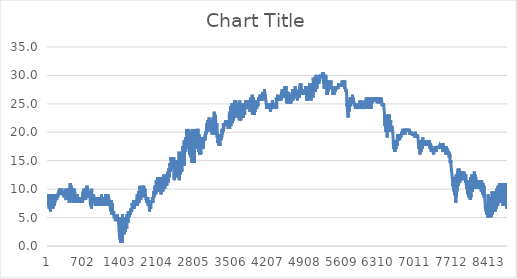
| Category | Series 0 |
|---|---|
| 0 | 9.079 |
| 1 | 9.079 |
| 2 | 8.076 |
| 3 | 7.575 |
| 4 | 7.073 |
| 5 | 7.073 |
| 6 | 7.575 |
| 7 | 8.076 |
| 8 | 8.076 |
| 9 | 8.578 |
| 10 | 8.578 |
| 11 | 9.079 |
| 12 | 8.578 |
| 13 | 8.578 |
| 14 | 8.076 |
| 15 | 7.575 |
| 16 | 8.076 |
| 17 | 8.076 |
| 18 | 7.575 |
| 19 | 7.575 |
| 20 | 7.073 |
| 21 | 6.572 |
| 22 | 7.575 |
| 23 | 8.076 |
| 24 | 8.076 |
| 25 | 8.076 |
| 26 | 8.076 |
| 27 | 8.076 |
| 28 | 7.073 |
| 29 | 7.073 |
| 30 | 7.073 |
| 31 | 6.572 |
| 32 | 7.073 |
| 33 | 7.575 |
| 34 | 7.575 |
| 35 | 8.076 |
| 36 | 8.076 |
| 37 | 8.076 |
| 38 | 8.076 |
| 39 | 7.575 |
| 40 | 7.575 |
| 41 | 7.073 |
| 42 | 7.073 |
| 43 | 7.073 |
| 44 | 6.572 |
| 45 | 6.07 |
| 46 | 6.572 |
| 47 | 7.575 |
| 48 | 8.076 |
| 49 | 8.578 |
| 50 | 8.578 |
| 51 | 8.578 |
| 52 | 8.578 |
| 53 | 8.076 |
| 54 | 7.575 |
| 55 | 7.575 |
| 56 | 7.575 |
| 57 | 8.076 |
| 58 | 8.076 |
| 59 | 9.079 |
| 60 | 9.079 |
| 61 | 9.079 |
| 62 | 9.079 |
| 63 | 8.076 |
| 64 | 8.076 |
| 65 | 8.076 |
| 66 | 7.575 |
| 67 | 7.575 |
| 68 | 7.575 |
| 69 | 6.572 |
| 70 | 6.572 |
| 71 | 7.073 |
| 72 | 8.076 |
| 73 | 8.578 |
| 74 | 8.578 |
| 75 | 8.578 |
| 76 | 8.578 |
| 77 | 8.578 |
| 78 | 8.076 |
| 79 | 7.575 |
| 80 | 7.073 |
| 81 | 7.575 |
| 82 | 7.575 |
| 83 | 7.575 |
| 84 | 8.076 |
| 85 | 8.076 |
| 86 | 8.076 |
| 87 | 7.575 |
| 88 | 7.575 |
| 89 | 7.575 |
| 90 | 7.575 |
| 91 | 7.575 |
| 92 | 7.575 |
| 93 | 6.572 |
| 94 | 6.572 |
| 95 | 7.073 |
| 96 | 8.578 |
| 97 | 9.079 |
| 98 | 9.079 |
| 99 | 9.079 |
| 100 | 9.079 |
| 101 | 9.079 |
| 102 | 8.076 |
| 103 | 7.575 |
| 104 | 7.575 |
| 105 | 7.073 |
| 106 | 7.073 |
| 107 | 7.575 |
| 108 | 7.575 |
| 109 | 8.076 |
| 110 | 8.578 |
| 111 | 8.076 |
| 112 | 8.578 |
| 113 | 8.076 |
| 114 | 7.575 |
| 115 | 7.575 |
| 116 | 7.575 |
| 117 | 7.073 |
| 118 | 7.073 |
| 119 | 7.073 |
| 120 | 8.076 |
| 121 | 8.578 |
| 122 | 9.079 |
| 123 | 9.079 |
| 124 | 9.079 |
| 125 | 9.079 |
| 126 | 8.578 |
| 127 | 8.076 |
| 128 | 7.575 |
| 129 | 7.575 |
| 130 | 7.575 |
| 131 | 7.575 |
| 132 | 8.076 |
| 133 | 8.578 |
| 134 | 9.079 |
| 135 | 9.079 |
| 136 | 8.578 |
| 137 | 8.578 |
| 138 | 8.076 |
| 139 | 8.076 |
| 140 | 8.076 |
| 141 | 8.076 |
| 142 | 8.076 |
| 143 | 8.076 |
| 144 | 8.076 |
| 145 | 8.578 |
| 146 | 9.079 |
| 147 | 9.079 |
| 148 | 9.079 |
| 149 | 9.079 |
| 150 | 8.578 |
| 151 | 8.076 |
| 152 | 8.076 |
| 153 | 8.076 |
| 154 | 8.076 |
| 155 | 8.076 |
| 156 | 8.076 |
| 157 | 8.578 |
| 158 | 8.578 |
| 159 | 8.578 |
| 160 | 8.578 |
| 161 | 8.578 |
| 162 | 8.578 |
| 163 | 8.578 |
| 164 | 8.578 |
| 165 | 8.076 |
| 166 | 8.578 |
| 167 | 8.578 |
| 168 | 8.578 |
| 169 | 8.578 |
| 170 | 8.578 |
| 171 | 8.578 |
| 172 | 8.578 |
| 173 | 9.079 |
| 174 | 9.079 |
| 175 | 8.578 |
| 176 | 8.578 |
| 177 | 8.578 |
| 178 | 8.578 |
| 179 | 8.578 |
| 180 | 9.079 |
| 181 | 9.079 |
| 182 | 8.578 |
| 183 | 9.079 |
| 184 | 9.079 |
| 185 | 8.578 |
| 186 | 9.079 |
| 187 | 9.079 |
| 188 | 9.079 |
| 189 | 9.079 |
| 190 | 9.079 |
| 191 | 9.079 |
| 192 | 9.079 |
| 193 | 9.079 |
| 194 | 9.079 |
| 195 | 9.079 |
| 196 | 9.079 |
| 197 | 9.079 |
| 198 | 9.079 |
| 199 | 9.079 |
| 200 | 9.58 |
| 201 | 9.58 |
| 202 | 9.079 |
| 203 | 9.58 |
| 204 | 9.58 |
| 205 | 9.58 |
| 206 | 9.58 |
| 207 | 9.58 |
| 208 | 9.58 |
| 209 | 9.58 |
| 210 | 9.58 |
| 211 | 9.58 |
| 212 | 9.58 |
| 213 | 9.58 |
| 214 | 9.58 |
| 215 | 9.58 |
| 216 | 9.58 |
| 217 | 9.58 |
| 218 | 9.58 |
| 219 | 9.58 |
| 220 | 9.58 |
| 221 | 9.58 |
| 222 | 10.082 |
| 223 | 9.58 |
| 224 | 9.58 |
| 225 | 9.58 |
| 226 | 9.58 |
| 227 | 9.58 |
| 228 | 9.58 |
| 229 | 9.58 |
| 230 | 9.58 |
| 231 | 9.58 |
| 232 | 9.58 |
| 233 | 9.58 |
| 234 | 9.58 |
| 235 | 9.58 |
| 236 | 9.58 |
| 237 | 9.58 |
| 238 | 9.58 |
| 239 | 9.58 |
| 240 | 9.58 |
| 241 | 9.58 |
| 242 | 9.58 |
| 243 | 9.58 |
| 244 | 9.58 |
| 245 | 9.58 |
| 246 | 9.58 |
| 247 | 10.082 |
| 248 | 9.58 |
| 249 | 9.58 |
| 250 | 9.58 |
| 251 | 9.58 |
| 252 | 9.58 |
| 253 | 9.58 |
| 254 | 9.58 |
| 255 | 10.082 |
| 256 | 9.58 |
| 257 | 9.58 |
| 258 | 9.58 |
| 259 | 9.58 |
| 260 | 9.58 |
| 261 | 9.58 |
| 262 | 9.079 |
| 263 | 9.079 |
| 264 | 9.079 |
| 265 | 9.58 |
| 266 | 9.58 |
| 267 | 9.079 |
| 268 | 9.079 |
| 269 | 9.079 |
| 270 | 9.079 |
| 271 | 9.58 |
| 272 | 9.079 |
| 273 | 9.079 |
| 274 | 9.079 |
| 275 | 9.58 |
| 276 | 9.58 |
| 277 | 9.58 |
| 278 | 9.58 |
| 279 | 9.58 |
| 280 | 9.58 |
| 281 | 9.58 |
| 282 | 9.079 |
| 283 | 9.079 |
| 284 | 9.079 |
| 285 | 9.079 |
| 286 | 9.079 |
| 287 | 9.079 |
| 288 | 9.079 |
| 289 | 9.079 |
| 290 | 9.079 |
| 291 | 9.079 |
| 292 | 9.079 |
| 293 | 9.079 |
| 294 | 9.079 |
| 295 | 9.079 |
| 296 | 9.079 |
| 297 | 9.079 |
| 298 | 9.079 |
| 299 | 9.079 |
| 300 | 9.079 |
| 301 | 9.079 |
| 302 | 9.079 |
| 303 | 9.079 |
| 304 | 9.079 |
| 305 | 9.079 |
| 306 | 9.079 |
| 307 | 9.079 |
| 308 | 9.079 |
| 309 | 8.578 |
| 310 | 9.079 |
| 311 | 8.578 |
| 312 | 8.578 |
| 313 | 8.578 |
| 314 | 8.578 |
| 315 | 8.578 |
| 316 | 8.578 |
| 317 | 8.578 |
| 318 | 8.578 |
| 319 | 8.578 |
| 320 | 9.079 |
| 321 | 9.079 |
| 322 | 9.079 |
| 323 | 9.079 |
| 324 | 9.079 |
| 325 | 10.082 |
| 326 | 9.079 |
| 327 | 9.079 |
| 328 | 9.079 |
| 329 | 9.079 |
| 330 | 9.079 |
| 331 | 8.578 |
| 332 | 8.578 |
| 333 | 9.079 |
| 334 | 9.58 |
| 335 | 9.58 |
| 336 | 9.58 |
| 337 | 9.58 |
| 338 | 9.079 |
| 339 | 8.578 |
| 340 | 8.578 |
| 341 | 8.578 |
| 342 | 8.076 |
| 343 | 8.578 |
| 344 | 9.079 |
| 345 | 9.079 |
| 346 | 9.079 |
| 347 | 9.079 |
| 348 | 9.58 |
| 349 | 9.079 |
| 350 | 8.578 |
| 351 | 8.578 |
| 352 | 8.578 |
| 353 | 8.578 |
| 354 | 8.076 |
| 355 | 8.578 |
| 356 | 8.076 |
| 357 | 9.079 |
| 358 | 9.58 |
| 359 | 9.58 |
| 360 | 9.58 |
| 361 | 9.58 |
| 362 | 10.082 |
| 363 | 9.58 |
| 364 | 9.079 |
| 365 | 8.578 |
| 366 | 8.076 |
| 367 | 8.578 |
| 368 | 9.079 |
| 369 | 9.58 |
| 370 | 10.082 |
| 371 | 10.082 |
| 372 | 10.082 |
| 373 | 10.082 |
| 374 | 9.58 |
| 375 | 9.079 |
| 376 | 8.578 |
| 377 | 8.578 |
| 378 | 8.578 |
| 379 | 8.578 |
| 380 | 8.578 |
| 381 | 8.578 |
| 382 | 9.58 |
| 383 | 10.082 |
| 384 | 9.58 |
| 385 | 10.082 |
| 386 | 10.082 |
| 387 | 9.58 |
| 388 | 9.58 |
| 389 | 9.079 |
| 390 | 9.079 |
| 391 | 8.578 |
| 392 | 9.079 |
| 393 | 9.58 |
| 394 | 10.082 |
| 395 | 10.082 |
| 396 | 10.082 |
| 397 | 10.082 |
| 398 | 9.58 |
| 399 | 9.079 |
| 400 | 8.578 |
| 401 | 8.578 |
| 402 | 8.578 |
| 403 | 8.076 |
| 404 | 8.076 |
| 405 | 7.575 |
| 406 | 8.076 |
| 407 | 8.578 |
| 408 | 8.578 |
| 409 | 9.079 |
| 410 | 9.58 |
| 411 | 9.58 |
| 412 | 8.578 |
| 413 | 8.076 |
| 414 | 7.575 |
| 415 | 7.575 |
| 416 | 8.578 |
| 417 | 9.079 |
| 418 | 10.082 |
| 419 | 10.583 |
| 420 | 10.583 |
| 421 | 10.583 |
| 422 | 11.084 |
| 423 | 10.082 |
| 424 | 9.079 |
| 425 | 8.578 |
| 426 | 8.076 |
| 427 | 8.076 |
| 428 | 8.076 |
| 429 | 8.076 |
| 430 | 8.578 |
| 431 | 9.58 |
| 432 | 10.082 |
| 433 | 10.082 |
| 434 | 10.082 |
| 435 | 10.082 |
| 436 | 9.58 |
| 437 | 10.082 |
| 438 | 9.079 |
| 439 | 8.578 |
| 440 | 8.076 |
| 441 | 8.578 |
| 442 | 9.58 |
| 443 | 10.082 |
| 444 | 10.583 |
| 445 | 10.583 |
| 446 | 10.583 |
| 447 | 10.082 |
| 448 | 9.079 |
| 449 | 9.079 |
| 450 | 8.578 |
| 451 | 8.578 |
| 452 | 8.578 |
| 453 | 8.076 |
| 454 | 8.076 |
| 455 | 9.079 |
| 456 | 10.082 |
| 457 | 9.58 |
| 458 | 10.082 |
| 459 | 10.082 |
| 460 | 10.082 |
| 461 | 9.58 |
| 462 | 9.079 |
| 463 | 8.578 |
| 464 | 8.076 |
| 465 | 8.076 |
| 466 | 9.079 |
| 467 | 9.079 |
| 468 | 9.58 |
| 469 | 10.082 |
| 470 | 9.58 |
| 471 | 9.58 |
| 472 | 9.079 |
| 473 | 8.578 |
| 474 | 8.578 |
| 475 | 8.578 |
| 476 | 8.578 |
| 477 | 8.076 |
| 478 | 7.575 |
| 479 | 8.578 |
| 480 | 9.58 |
| 481 | 9.58 |
| 482 | 9.58 |
| 483 | 10.082 |
| 484 | 10.082 |
| 485 | 10.082 |
| 486 | 10.082 |
| 487 | 9.079 |
| 488 | 8.578 |
| 489 | 8.578 |
| 490 | 9.079 |
| 491 | 9.079 |
| 492 | 10.082 |
| 493 | 9.58 |
| 494 | 10.082 |
| 495 | 9.58 |
| 496 | 9.58 |
| 497 | 9.079 |
| 498 | 8.578 |
| 499 | 8.578 |
| 500 | 8.578 |
| 501 | 8.076 |
| 502 | 7.575 |
| 503 | 7.575 |
| 504 | 8.578 |
| 505 | 9.079 |
| 506 | 9.58 |
| 507 | 9.58 |
| 508 | 9.58 |
| 509 | 9.58 |
| 510 | 9.58 |
| 511 | 9.079 |
| 512 | 8.578 |
| 513 | 8.076 |
| 514 | 8.578 |
| 515 | 8.578 |
| 516 | 9.079 |
| 517 | 9.079 |
| 518 | 9.079 |
| 519 | 9.079 |
| 520 | 8.578 |
| 521 | 8.578 |
| 522 | 8.076 |
| 523 | 8.076 |
| 524 | 8.076 |
| 525 | 8.076 |
| 526 | 8.076 |
| 527 | 8.076 |
| 528 | 8.578 |
| 529 | 8.578 |
| 530 | 9.079 |
| 531 | 9.079 |
| 532 | 9.079 |
| 533 | 9.079 |
| 534 | 8.578 |
| 535 | 8.578 |
| 536 | 8.076 |
| 537 | 8.076 |
| 538 | 8.076 |
| 539 | 8.076 |
| 540 | 8.076 |
| 541 | 9.079 |
| 542 | 8.578 |
| 543 | 8.578 |
| 544 | 8.578 |
| 545 | 8.578 |
| 546 | 8.578 |
| 547 | 8.578 |
| 548 | 8.076 |
| 549 | 8.076 |
| 550 | 8.076 |
| 551 | 7.575 |
| 552 | 8.076 |
| 553 | 8.578 |
| 554 | 8.578 |
| 555 | 8.578 |
| 556 | 9.079 |
| 557 | 8.578 |
| 558 | 8.578 |
| 559 | 8.578 |
| 560 | 8.578 |
| 561 | 8.076 |
| 562 | 8.076 |
| 563 | 8.076 |
| 564 | 8.076 |
| 565 | 8.578 |
| 566 | 8.076 |
| 567 | 8.076 |
| 568 | 8.076 |
| 569 | 8.076 |
| 570 | 8.076 |
| 571 | 7.575 |
| 572 | 7.575 |
| 573 | 7.575 |
| 574 | 7.575 |
| 575 | 7.575 |
| 576 | 8.076 |
| 577 | 8.076 |
| 578 | 8.076 |
| 579 | 8.578 |
| 580 | 8.578 |
| 581 | 8.578 |
| 582 | 8.578 |
| 583 | 8.076 |
| 584 | 8.578 |
| 585 | 8.578 |
| 586 | 8.076 |
| 587 | 7.575 |
| 588 | 7.575 |
| 589 | 7.575 |
| 590 | 8.076 |
| 591 | 7.575 |
| 592 | 7.575 |
| 593 | 7.575 |
| 594 | 7.575 |
| 595 | 7.575 |
| 596 | 7.575 |
| 597 | 7.575 |
| 598 | 7.575 |
| 599 | 7.575 |
| 600 | 7.575 |
| 601 | 7.575 |
| 602 | 7.575 |
| 603 | 8.076 |
| 604 | 8.076 |
| 605 | 8.076 |
| 606 | 8.076 |
| 607 | 8.076 |
| 608 | 8.076 |
| 609 | 8.076 |
| 610 | 8.076 |
| 611 | 7.575 |
| 612 | 7.575 |
| 613 | 7.575 |
| 614 | 8.076 |
| 615 | 8.076 |
| 616 | 7.575 |
| 617 | 7.575 |
| 618 | 7.575 |
| 619 | 7.575 |
| 620 | 8.076 |
| 621 | 8.076 |
| 622 | 8.076 |
| 623 | 8.076 |
| 624 | 7.575 |
| 625 | 7.575 |
| 626 | 7.575 |
| 627 | 7.575 |
| 628 | 7.575 |
| 629 | 7.575 |
| 630 | 8.076 |
| 631 | 8.076 |
| 632 | 8.076 |
| 633 | 8.076 |
| 634 | 8.076 |
| 635 | 8.076 |
| 636 | 8.076 |
| 637 | 7.575 |
| 638 | 8.076 |
| 639 | 8.076 |
| 640 | 8.076 |
| 641 | 7.575 |
| 642 | 7.575 |
| 643 | 7.575 |
| 644 | 8.076 |
| 645 | 8.578 |
| 646 | 8.076 |
| 647 | 8.578 |
| 648 | 8.578 |
| 649 | 8.076 |
| 650 | 8.076 |
| 651 | 8.076 |
| 652 | 8.076 |
| 653 | 7.575 |
| 654 | 8.076 |
| 655 | 8.578 |
| 656 | 9.079 |
| 657 | 8.578 |
| 658 | 8.578 |
| 659 | 9.079 |
| 660 | 8.578 |
| 661 | 8.076 |
| 662 | 8.076 |
| 663 | 8.076 |
| 664 | 8.578 |
| 665 | 8.076 |
| 666 | 8.076 |
| 667 | 8.076 |
| 668 | 8.578 |
| 669 | 9.58 |
| 670 | 9.58 |
| 671 | 9.079 |
| 672 | 9.58 |
| 673 | 9.079 |
| 674 | 9.079 |
| 675 | 8.076 |
| 676 | 8.076 |
| 677 | 8.578 |
| 678 | 8.578 |
| 679 | 8.578 |
| 680 | 9.58 |
| 681 | 10.082 |
| 682 | 9.58 |
| 683 | 9.58 |
| 684 | 9.58 |
| 685 | 9.079 |
| 686 | 8.578 |
| 687 | 8.578 |
| 688 | 8.578 |
| 689 | 8.076 |
| 690 | 8.076 |
| 691 | 8.076 |
| 692 | 9.079 |
| 693 | 9.079 |
| 694 | 9.58 |
| 695 | 9.58 |
| 696 | 9.58 |
| 697 | 9.079 |
| 698 | 9.58 |
| 699 | 9.079 |
| 700 | 8.578 |
| 701 | 8.578 |
| 702 | 8.578 |
| 703 | 8.578 |
| 704 | 9.079 |
| 705 | 10.082 |
| 706 | 10.082 |
| 707 | 10.082 |
| 708 | 10.082 |
| 709 | 9.58 |
| 710 | 9.079 |
| 711 | 8.578 |
| 712 | 8.578 |
| 713 | 8.578 |
| 714 | 8.578 |
| 715 | 8.076 |
| 716 | 8.076 |
| 717 | 9.079 |
| 718 | 9.079 |
| 719 | 10.082 |
| 720 | 10.082 |
| 721 | 10.082 |
| 722 | 10.082 |
| 723 | 9.58 |
| 724 | 9.079 |
| 725 | 8.578 |
| 726 | 8.578 |
| 727 | 9.079 |
| 728 | 9.079 |
| 729 | 9.58 |
| 730 | 10.583 |
| 731 | 10.583 |
| 732 | 10.583 |
| 733 | 10.583 |
| 734 | 10.082 |
| 735 | 9.079 |
| 736 | 9.079 |
| 737 | 8.578 |
| 738 | 8.578 |
| 739 | 8.578 |
| 740 | 8.578 |
| 741 | 8.578 |
| 742 | 9.58 |
| 743 | 10.082 |
| 744 | 10.583 |
| 745 | 10.583 |
| 746 | 10.583 |
| 747 | 10.583 |
| 748 | 10.082 |
| 749 | 9.079 |
| 750 | 9.079 |
| 751 | 9.079 |
| 752 | 9.58 |
| 753 | 9.58 |
| 754 | 10.082 |
| 755 | 10.082 |
| 756 | 10.082 |
| 757 | 10.082 |
| 758 | 10.082 |
| 759 | 9.58 |
| 760 | 9.58 |
| 761 | 9.58 |
| 762 | 9.58 |
| 763 | 9.079 |
| 764 | 9.079 |
| 765 | 9.079 |
| 766 | 9.079 |
| 767 | 9.079 |
| 768 | 9.58 |
| 769 | 9.58 |
| 770 | 9.58 |
| 771 | 9.58 |
| 772 | 9.58 |
| 773 | 9.079 |
| 774 | 9.079 |
| 775 | 9.079 |
| 776 | 9.079 |
| 777 | 9.079 |
| 778 | 9.58 |
| 779 | 9.58 |
| 780 | 9.58 |
| 781 | 9.58 |
| 782 | 9.58 |
| 783 | 9.58 |
| 784 | 9.079 |
| 785 | 9.079 |
| 786 | 9.079 |
| 787 | 9.079 |
| 788 | 8.578 |
| 789 | 8.578 |
| 790 | 8.578 |
| 791 | 9.079 |
| 792 | 9.079 |
| 793 | 9.079 |
| 794 | 9.079 |
| 795 | 8.578 |
| 796 | 8.578 |
| 797 | 8.578 |
| 798 | 8.578 |
| 799 | 8.578 |
| 800 | 8.076 |
| 801 | 8.076 |
| 802 | 8.076 |
| 803 | 7.575 |
| 804 | 7.575 |
| 805 | 7.575 |
| 806 | 7.575 |
| 807 | 7.575 |
| 808 | 7.575 |
| 809 | 7.575 |
| 810 | 7.073 |
| 811 | 7.073 |
| 812 | 7.073 |
| 813 | 7.073 |
| 814 | 7.073 |
| 815 | 7.073 |
| 816 | 8.076 |
| 817 | 8.076 |
| 818 | 8.076 |
| 819 | 8.578 |
| 820 | 8.578 |
| 821 | 7.575 |
| 822 | 7.575 |
| 823 | 7.073 |
| 824 | 7.073 |
| 825 | 6.572 |
| 826 | 7.575 |
| 827 | 9.079 |
| 828 | 9.58 |
| 829 | 10.082 |
| 830 | 9.58 |
| 831 | 9.58 |
| 832 | 9.079 |
| 833 | 8.076 |
| 834 | 7.575 |
| 835 | 7.575 |
| 836 | 7.575 |
| 837 | 7.575 |
| 838 | 7.575 |
| 839 | 7.575 |
| 840 | 7.575 |
| 841 | 9.079 |
| 842 | 9.079 |
| 843 | 9.079 |
| 844 | 9.079 |
| 845 | 9.079 |
| 846 | 8.578 |
| 847 | 8.076 |
| 848 | 8.076 |
| 849 | 8.076 |
| 850 | 7.575 |
| 851 | 7.575 |
| 852 | 8.076 |
| 853 | 8.076 |
| 854 | 8.076 |
| 855 | 8.076 |
| 856 | 8.076 |
| 857 | 8.076 |
| 858 | 8.076 |
| 859 | 8.076 |
| 860 | 7.575 |
| 861 | 7.575 |
| 862 | 7.575 |
| 863 | 7.575 |
| 864 | 8.076 |
| 865 | 8.578 |
| 866 | 9.079 |
| 867 | 9.079 |
| 868 | 9.079 |
| 869 | 8.578 |
| 870 | 8.578 |
| 871 | 8.578 |
| 872 | 8.076 |
| 873 | 8.076 |
| 874 | 7.575 |
| 875 | 7.575 |
| 876 | 8.076 |
| 877 | 8.076 |
| 878 | 8.076 |
| 879 | 8.076 |
| 880 | 8.076 |
| 881 | 8.076 |
| 882 | 8.076 |
| 883 | 7.575 |
| 884 | 7.575 |
| 885 | 7.575 |
| 886 | 7.575 |
| 887 | 7.575 |
| 888 | 7.575 |
| 889 | 7.575 |
| 890 | 8.076 |
| 891 | 8.578 |
| 892 | 8.578 |
| 893 | 7.575 |
| 894 | 7.575 |
| 895 | 7.575 |
| 896 | 7.575 |
| 897 | 7.575 |
| 898 | 7.073 |
| 899 | 7.073 |
| 900 | 7.575 |
| 901 | 7.575 |
| 902 | 7.575 |
| 903 | 7.575 |
| 904 | 7.575 |
| 905 | 7.073 |
| 906 | 7.073 |
| 907 | 7.575 |
| 908 | 7.073 |
| 909 | 7.073 |
| 910 | 7.073 |
| 911 | 7.575 |
| 912 | 8.076 |
| 913 | 8.076 |
| 914 | 8.578 |
| 915 | 8.578 |
| 916 | 8.578 |
| 917 | 8.578 |
| 918 | 8.076 |
| 919 | 8.076 |
| 920 | 8.076 |
| 921 | 7.575 |
| 922 | 7.073 |
| 923 | 7.073 |
| 924 | 7.073 |
| 925 | 7.073 |
| 926 | 7.575 |
| 927 | 7.575 |
| 928 | 7.575 |
| 929 | 7.575 |
| 930 | 7.575 |
| 931 | 8.076 |
| 932 | 8.578 |
| 933 | 8.578 |
| 934 | 8.578 |
| 935 | 8.578 |
| 936 | 8.076 |
| 937 | 8.076 |
| 938 | 8.076 |
| 939 | 7.575 |
| 940 | 7.575 |
| 941 | 8.076 |
| 942 | 8.076 |
| 943 | 8.076 |
| 944 | 8.076 |
| 945 | 8.076 |
| 946 | 7.575 |
| 947 | 7.575 |
| 948 | 7.575 |
| 949 | 7.575 |
| 950 | 8.076 |
| 951 | 7.575 |
| 952 | 7.575 |
| 953 | 7.575 |
| 954 | 8.578 |
| 955 | 8.578 |
| 956 | 8.578 |
| 957 | 8.578 |
| 958 | 8.578 |
| 959 | 8.076 |
| 960 | 8.076 |
| 961 | 8.076 |
| 962 | 7.575 |
| 963 | 7.575 |
| 964 | 7.575 |
| 965 | 7.575 |
| 966 | 7.073 |
| 967 | 7.575 |
| 968 | 7.575 |
| 969 | 7.575 |
| 970 | 7.575 |
| 971 | 7.575 |
| 972 | 7.575 |
| 973 | 7.575 |
| 974 | 8.578 |
| 975 | 8.076 |
| 976 | 8.076 |
| 977 | 8.076 |
| 978 | 7.575 |
| 979 | 7.575 |
| 980 | 7.575 |
| 981 | 7.575 |
| 982 | 7.575 |
| 983 | 7.575 |
| 984 | 7.575 |
| 985 | 7.575 |
| 986 | 7.575 |
| 987 | 7.575 |
| 988 | 7.575 |
| 989 | 7.073 |
| 990 | 7.073 |
| 991 | 7.073 |
| 992 | 7.073 |
| 993 | 7.575 |
| 994 | 7.575 |
| 995 | 7.575 |
| 996 | 7.575 |
| 997 | 7.575 |
| 998 | 7.575 |
| 999 | 8.076 |
| 1000 | 7.575 |
| 1001 | 7.575 |
| 1002 | 7.575 |
| 1003 | 7.575 |
| 1004 | 7.575 |
| 1005 | 8.076 |
| 1006 | 8.578 |
| 1007 | 8.578 |
| 1008 | 8.578 |
| 1009 | 8.578 |
| 1010 | 8.578 |
| 1011 | 8.076 |
| 1012 | 7.575 |
| 1013 | 8.076 |
| 1014 | 8.076 |
| 1015 | 8.578 |
| 1016 | 8.578 |
| 1017 | 9.079 |
| 1018 | 8.578 |
| 1019 | 8.076 |
| 1020 | 8.076 |
| 1021 | 8.076 |
| 1022 | 8.076 |
| 1023 | 7.575 |
| 1024 | 7.575 |
| 1025 | 7.575 |
| 1026 | 7.575 |
| 1027 | 7.073 |
| 1028 | 7.073 |
| 1029 | 7.575 |
| 1030 | 8.076 |
| 1031 | 8.076 |
| 1032 | 7.575 |
| 1033 | 7.575 |
| 1034 | 7.073 |
| 1035 | 7.073 |
| 1036 | 7.073 |
| 1037 | 7.073 |
| 1038 | 7.073 |
| 1039 | 7.073 |
| 1040 | 7.073 |
| 1041 | 7.575 |
| 1042 | 7.575 |
| 1043 | 7.575 |
| 1044 | 7.575 |
| 1045 | 7.575 |
| 1046 | 7.073 |
| 1047 | 7.073 |
| 1048 | 7.073 |
| 1049 | 7.575 |
| 1050 | 7.073 |
| 1051 | 7.073 |
| 1052 | 7.073 |
| 1053 | 8.076 |
| 1054 | 8.076 |
| 1055 | 8.578 |
| 1056 | 8.578 |
| 1057 | 8.076 |
| 1058 | 8.076 |
| 1059 | 7.575 |
| 1060 | 7.073 |
| 1061 | 7.073 |
| 1062 | 7.073 |
| 1063 | 7.073 |
| 1064 | 7.073 |
| 1065 | 7.575 |
| 1066 | 8.076 |
| 1067 | 8.076 |
| 1068 | 8.076 |
| 1069 | 8.578 |
| 1070 | 8.076 |
| 1071 | 7.575 |
| 1072 | 7.575 |
| 1073 | 7.575 |
| 1074 | 7.575 |
| 1075 | 7.575 |
| 1076 | 7.073 |
| 1077 | 7.575 |
| 1078 | 8.076 |
| 1079 | 8.076 |
| 1080 | 8.578 |
| 1081 | 8.076 |
| 1082 | 8.076 |
| 1083 | 7.575 |
| 1084 | 7.575 |
| 1085 | 7.073 |
| 1086 | 7.073 |
| 1087 | 7.073 |
| 1088 | 7.575 |
| 1089 | 7.575 |
| 1090 | 8.076 |
| 1091 | 8.076 |
| 1092 | 8.578 |
| 1093 | 9.079 |
| 1094 | 8.076 |
| 1095 | 7.575 |
| 1096 | 7.575 |
| 1097 | 7.575 |
| 1098 | 7.575 |
| 1099 | 7.575 |
| 1100 | 7.073 |
| 1101 | 7.073 |
| 1102 | 7.575 |
| 1103 | 8.076 |
| 1104 | 8.578 |
| 1105 | 8.578 |
| 1106 | 8.076 |
| 1107 | 8.076 |
| 1108 | 8.076 |
| 1109 | 7.575 |
| 1110 | 7.073 |
| 1111 | 7.073 |
| 1112 | 7.575 |
| 1113 | 7.575 |
| 1114 | 8.076 |
| 1115 | 8.578 |
| 1116 | 8.578 |
| 1117 | 8.578 |
| 1118 | 8.578 |
| 1119 | 8.076 |
| 1120 | 8.076 |
| 1121 | 8.076 |
| 1122 | 8.076 |
| 1123 | 7.575 |
| 1124 | 7.575 |
| 1125 | 7.575 |
| 1126 | 8.076 |
| 1127 | 8.076 |
| 1128 | 8.076 |
| 1129 | 8.578 |
| 1130 | 8.578 |
| 1131 | 8.076 |
| 1132 | 8.076 |
| 1133 | 8.076 |
| 1134 | 7.575 |
| 1135 | 7.575 |
| 1136 | 7.073 |
| 1137 | 7.575 |
| 1138 | 8.076 |
| 1139 | 8.076 |
| 1140 | 9.079 |
| 1141 | 8.578 |
| 1142 | 8.578 |
| 1143 | 8.076 |
| 1144 | 8.076 |
| 1145 | 8.076 |
| 1146 | 8.076 |
| 1147 | 8.076 |
| 1148 | 7.575 |
| 1149 | 7.575 |
| 1150 | 8.076 |
| 1151 | 8.578 |
| 1152 | 8.578 |
| 1153 | 8.578 |
| 1154 | 8.578 |
| 1155 | 8.578 |
| 1156 | 8.578 |
| 1157 | 8.076 |
| 1158 | 8.076 |
| 1159 | 8.076 |
| 1160 | 7.575 |
| 1161 | 7.575 |
| 1162 | 8.076 |
| 1163 | 8.076 |
| 1164 | 8.076 |
| 1165 | 8.076 |
| 1166 | 8.076 |
| 1167 | 8.076 |
| 1168 | 8.076 |
| 1169 | 8.076 |
| 1170 | 7.575 |
| 1171 | 7.575 |
| 1172 | 7.575 |
| 1173 | 7.575 |
| 1174 | 7.073 |
| 1175 | 7.073 |
| 1176 | 8.076 |
| 1177 | 8.076 |
| 1178 | 8.076 |
| 1179 | 7.575 |
| 1180 | 7.073 |
| 1181 | 7.073 |
| 1182 | 7.073 |
| 1183 | 7.073 |
| 1184 | 7.073 |
| 1185 | 7.073 |
| 1186 | 6.572 |
| 1187 | 6.572 |
| 1188 | 6.572 |
| 1189 | 6.572 |
| 1190 | 6.572 |
| 1191 | 6.572 |
| 1192 | 6.572 |
| 1193 | 6.572 |
| 1194 | 6.572 |
| 1195 | 6.572 |
| 1196 | 6.572 |
| 1197 | 6.572 |
| 1198 | 6.07 |
| 1199 | 6.07 |
| 1200 | 7.073 |
| 1201 | 8.076 |
| 1202 | 8.076 |
| 1203 | 7.575 |
| 1204 | 7.073 |
| 1205 | 6.572 |
| 1206 | 6.07 |
| 1207 | 6.07 |
| 1208 | 6.07 |
| 1209 | 6.07 |
| 1210 | 5.569 |
| 1211 | 6.07 |
| 1212 | 6.572 |
| 1213 | 7.575 |
| 1214 | 7.073 |
| 1215 | 6.572 |
| 1216 | 6.572 |
| 1217 | 6.572 |
| 1218 | 6.07 |
| 1219 | 6.07 |
| 1220 | 6.07 |
| 1221 | 6.07 |
| 1222 | 6.07 |
| 1223 | 6.07 |
| 1224 | 6.572 |
| 1225 | 7.575 |
| 1226 | 7.073 |
| 1227 | 6.572 |
| 1228 | 6.572 |
| 1229 | 6.07 |
| 1230 | 6.07 |
| 1231 | 6.07 |
| 1232 | 5.569 |
| 1233 | 5.569 |
| 1234 | 5.569 |
| 1235 | 5.569 |
| 1236 | 5.569 |
| 1237 | 6.07 |
| 1238 | 6.07 |
| 1239 | 6.07 |
| 1240 | 6.07 |
| 1241 | 5.569 |
| 1242 | 5.569 |
| 1243 | 5.569 |
| 1244 | 5.569 |
| 1245 | 5.569 |
| 1246 | 5.569 |
| 1247 | 5.569 |
| 1248 | 6.07 |
| 1249 | 5.569 |
| 1250 | 5.569 |
| 1251 | 5.569 |
| 1252 | 5.569 |
| 1253 | 5.569 |
| 1254 | 5.569 |
| 1255 | 5.067 |
| 1256 | 5.067 |
| 1257 | 5.067 |
| 1258 | 5.067 |
| 1259 | 5.067 |
| 1260 | 5.067 |
| 1261 | 5.067 |
| 1262 | 5.067 |
| 1263 | 5.067 |
| 1264 | 5.067 |
| 1265 | 5.067 |
| 1266 | 5.067 |
| 1267 | 5.067 |
| 1268 | 5.067 |
| 1269 | 5.067 |
| 1270 | 5.067 |
| 1271 | 5.067 |
| 1272 | 5.067 |
| 1273 | 5.067 |
| 1274 | 5.067 |
| 1275 | 5.067 |
| 1276 | 5.067 |
| 1277 | 4.566 |
| 1278 | 4.566 |
| 1279 | 4.566 |
| 1280 | 4.566 |
| 1281 | 4.566 |
| 1282 | 4.566 |
| 1283 | 4.566 |
| 1284 | 4.566 |
| 1285 | 4.566 |
| 1286 | 4.566 |
| 1287 | 4.566 |
| 1288 | 4.566 |
| 1289 | 4.566 |
| 1290 | 4.566 |
| 1291 | 4.566 |
| 1292 | 4.566 |
| 1293 | 4.566 |
| 1294 | 4.566 |
| 1295 | 4.566 |
| 1296 | 4.566 |
| 1297 | 4.566 |
| 1298 | 4.566 |
| 1299 | 4.566 |
| 1300 | 4.566 |
| 1301 | 4.566 |
| 1302 | 4.566 |
| 1303 | 4.566 |
| 1304 | 4.566 |
| 1305 | 4.566 |
| 1306 | 4.566 |
| 1307 | 4.566 |
| 1308 | 5.067 |
| 1309 | 5.067 |
| 1310 | 5.067 |
| 1311 | 5.569 |
| 1312 | 5.569 |
| 1313 | 5.569 |
| 1314 | 5.569 |
| 1315 | 5.569 |
| 1316 | 5.569 |
| 1317 | 5.569 |
| 1318 | 5.569 |
| 1319 | 5.569 |
| 1320 | 5.569 |
| 1321 | 5.569 |
| 1322 | 5.067 |
| 1323 | 5.067 |
| 1324 | 5.067 |
| 1325 | 5.067 |
| 1326 | 5.067 |
| 1327 | 5.067 |
| 1328 | 5.067 |
| 1329 | 5.067 |
| 1330 | 5.067 |
| 1331 | 4.566 |
| 1332 | 4.566 |
| 1333 | 4.566 |
| 1334 | 4.566 |
| 1335 | 4.566 |
| 1336 | 4.566 |
| 1337 | 5.067 |
| 1338 | 4.566 |
| 1339 | 4.064 |
| 1340 | 4.064 |
| 1341 | 4.064 |
| 1342 | 4.064 |
| 1343 | 4.064 |
| 1344 | 4.064 |
| 1345 | 4.064 |
| 1346 | 3.562 |
| 1347 | 3.562 |
| 1348 | 3.06 |
| 1349 | 3.06 |
| 1350 | 3.06 |
| 1351 | 2.558 |
| 1352 | 2.558 |
| 1353 | 2.558 |
| 1354 | 2.558 |
| 1355 | 2.056 |
| 1356 | 2.056 |
| 1357 | 2.056 |
| 1358 | 2.056 |
| 1359 | 2.056 |
| 1360 | 1.555 |
| 1361 | 2.056 |
| 1362 | 1.555 |
| 1363 | 1.555 |
| 1364 | 1.555 |
| 1365 | 2.056 |
| 1366 | 2.056 |
| 1367 | 2.056 |
| 1368 | 1.555 |
| 1369 | 1.555 |
| 1370 | 1.555 |
| 1371 | 1.053 |
| 1372 | 1.053 |
| 1373 | 1.053 |
| 1374 | 1.053 |
| 1375 | 1.555 |
| 1376 | 1.053 |
| 1377 | 1.555 |
| 1378 | 2.558 |
| 1379 | 0.551 |
| 1380 | 1.053 |
| 1381 | 1.053 |
| 1382 | 1.053 |
| 1383 | 0.551 |
| 1384 | 0.551 |
| 1385 | 0.551 |
| 1386 | 1.053 |
| 1387 | 1.053 |
| 1388 | 2.558 |
| 1389 | 4.064 |
| 1390 | 4.566 |
| 1391 | 4.566 |
| 1392 | 4.566 |
| 1393 | 4.064 |
| 1394 | 3.06 |
| 1395 | 2.056 |
| 1396 | 1.555 |
| 1397 | 1.555 |
| 1398 | 1.053 |
| 1399 | 1.053 |
| 1400 | 3.06 |
| 1401 | 4.064 |
| 1402 | 5.067 |
| 1403 | 4.566 |
| 1404 | 3.562 |
| 1405 | 3.562 |
| 1406 | 3.06 |
| 1407 | 2.558 |
| 1408 | 2.056 |
| 1409 | 0.551 |
| 1410 | 2.056 |
| 1411 | 2.056 |
| 1412 | 3.06 |
| 1413 | 4.566 |
| 1414 | 5.569 |
| 1415 | 5.569 |
| 1416 | 4.064 |
| 1417 | 4.566 |
| 1418 | 4.064 |
| 1419 | 3.06 |
| 1420 | 3.06 |
| 1421 | 3.06 |
| 1422 | 2.558 |
| 1423 | 3.06 |
| 1424 | 3.06 |
| 1425 | 4.064 |
| 1426 | 4.566 |
| 1427 | 4.566 |
| 1428 | 4.566 |
| 1429 | 3.562 |
| 1430 | 3.06 |
| 1431 | 3.06 |
| 1432 | 3.06 |
| 1433 | 2.558 |
| 1434 | 2.558 |
| 1435 | 2.056 |
| 1436 | 2.056 |
| 1437 | 2.558 |
| 1438 | 4.064 |
| 1439 | 4.566 |
| 1440 | 4.566 |
| 1441 | 4.566 |
| 1442 | 4.566 |
| 1443 | 3.06 |
| 1444 | 2.558 |
| 1445 | 2.558 |
| 1446 | 2.558 |
| 1447 | 2.056 |
| 1448 | 2.056 |
| 1449 | 3.06 |
| 1450 | 4.064 |
| 1451 | 4.566 |
| 1452 | 4.566 |
| 1453 | 4.566 |
| 1454 | 4.566 |
| 1455 | 4.064 |
| 1456 | 3.06 |
| 1457 | 3.06 |
| 1458 | 3.06 |
| 1459 | 2.558 |
| 1460 | 3.06 |
| 1461 | 3.562 |
| 1462 | 4.566 |
| 1463 | 4.566 |
| 1464 | 5.067 |
| 1465 | 5.067 |
| 1466 | 5.067 |
| 1467 | 4.566 |
| 1468 | 3.562 |
| 1469 | 3.06 |
| 1470 | 3.06 |
| 1471 | 2.558 |
| 1472 | 2.558 |
| 1473 | 3.06 |
| 1474 | 3.562 |
| 1475 | 4.566 |
| 1476 | 5.067 |
| 1477 | 5.067 |
| 1478 | 5.067 |
| 1479 | 4.566 |
| 1480 | 4.064 |
| 1481 | 3.562 |
| 1482 | 3.562 |
| 1483 | 3.562 |
| 1484 | 3.562 |
| 1485 | 3.562 |
| 1486 | 4.064 |
| 1487 | 4.566 |
| 1488 | 5.067 |
| 1489 | 5.067 |
| 1490 | 5.067 |
| 1491 | 5.067 |
| 1492 | 4.064 |
| 1493 | 3.562 |
| 1494 | 3.562 |
| 1495 | 3.562 |
| 1496 | 3.06 |
| 1497 | 3.06 |
| 1498 | 3.06 |
| 1499 | 4.064 |
| 1500 | 5.067 |
| 1501 | 5.569 |
| 1502 | 4.566 |
| 1503 | 4.566 |
| 1504 | 5.067 |
| 1505 | 4.566 |
| 1506 | 4.064 |
| 1507 | 4.064 |
| 1508 | 4.064 |
| 1509 | 4.566 |
| 1510 | 4.566 |
| 1511 | 5.569 |
| 1512 | 5.569 |
| 1513 | 5.569 |
| 1514 | 5.569 |
| 1515 | 5.569 |
| 1516 | 5.067 |
| 1517 | 4.566 |
| 1518 | 4.566 |
| 1519 | 4.566 |
| 1520 | 4.566 |
| 1521 | 4.064 |
| 1522 | 4.064 |
| 1523 | 5.067 |
| 1524 | 5.569 |
| 1525 | 6.07 |
| 1526 | 6.07 |
| 1527 | 6.07 |
| 1528 | 6.07 |
| 1529 | 6.07 |
| 1530 | 5.569 |
| 1531 | 5.067 |
| 1532 | 5.067 |
| 1533 | 5.067 |
| 1534 | 5.067 |
| 1535 | 5.569 |
| 1536 | 5.569 |
| 1537 | 5.569 |
| 1538 | 5.569 |
| 1539 | 5.569 |
| 1540 | 5.569 |
| 1541 | 5.067 |
| 1542 | 5.067 |
| 1543 | 5.067 |
| 1544 | 5.067 |
| 1545 | 5.067 |
| 1546 | 5.067 |
| 1547 | 5.569 |
| 1548 | 5.569 |
| 1549 | 6.07 |
| 1550 | 6.07 |
| 1551 | 6.07 |
| 1552 | 6.07 |
| 1553 | 6.07 |
| 1554 | 5.569 |
| 1555 | 5.569 |
| 1556 | 5.569 |
| 1557 | 5.569 |
| 1558 | 5.569 |
| 1559 | 5.569 |
| 1560 | 6.07 |
| 1561 | 6.07 |
| 1562 | 6.07 |
| 1563 | 6.07 |
| 1564 | 6.07 |
| 1565 | 6.07 |
| 1566 | 5.569 |
| 1567 | 5.569 |
| 1568 | 5.569 |
| 1569 | 5.569 |
| 1570 | 5.569 |
| 1571 | 5.569 |
| 1572 | 6.07 |
| 1573 | 6.07 |
| 1574 | 6.07 |
| 1575 | 6.572 |
| 1576 | 6.572 |
| 1577 | 6.572 |
| 1578 | 6.572 |
| 1579 | 6.572 |
| 1580 | 6.07 |
| 1581 | 6.07 |
| 1582 | 6.572 |
| 1583 | 6.572 |
| 1584 | 6.572 |
| 1585 | 6.572 |
| 1586 | 6.572 |
| 1587 | 6.572 |
| 1588 | 6.572 |
| 1589 | 6.07 |
| 1590 | 6.07 |
| 1591 | 6.07 |
| 1592 | 6.07 |
| 1593 | 6.07 |
| 1594 | 6.07 |
| 1595 | 6.07 |
| 1596 | 6.572 |
| 1597 | 6.572 |
| 1598 | 6.572 |
| 1599 | 7.073 |
| 1600 | 7.575 |
| 1601 | 7.073 |
| 1602 | 7.073 |
| 1603 | 7.575 |
| 1604 | 7.073 |
| 1605 | 7.073 |
| 1606 | 7.073 |
| 1607 | 7.073 |
| 1608 | 7.073 |
| 1609 | 6.572 |
| 1610 | 6.572 |
| 1611 | 6.572 |
| 1612 | 6.572 |
| 1613 | 6.572 |
| 1614 | 6.572 |
| 1615 | 6.572 |
| 1616 | 6.572 |
| 1617 | 6.572 |
| 1618 | 6.572 |
| 1619 | 6.572 |
| 1620 | 7.073 |
| 1621 | 7.575 |
| 1622 | 7.575 |
| 1623 | 7.575 |
| 1624 | 7.575 |
| 1625 | 7.575 |
| 1626 | 8.076 |
| 1627 | 7.575 |
| 1628 | 7.575 |
| 1629 | 7.073 |
| 1630 | 7.073 |
| 1631 | 7.073 |
| 1632 | 7.073 |
| 1633 | 7.073 |
| 1634 | 7.073 |
| 1635 | 7.073 |
| 1636 | 7.073 |
| 1637 | 7.073 |
| 1638 | 6.572 |
| 1639 | 7.073 |
| 1640 | 7.073 |
| 1641 | 7.073 |
| 1642 | 7.073 |
| 1643 | 7.073 |
| 1644 | 7.073 |
| 1645 | 7.575 |
| 1646 | 8.076 |
| 1647 | 8.076 |
| 1648 | 8.076 |
| 1649 | 8.076 |
| 1650 | 8.076 |
| 1651 | 7.575 |
| 1652 | 7.575 |
| 1653 | 7.073 |
| 1654 | 7.073 |
| 1655 | 7.073 |
| 1656 | 7.575 |
| 1657 | 7.073 |
| 1658 | 7.073 |
| 1659 | 7.073 |
| 1660 | 7.575 |
| 1661 | 7.575 |
| 1662 | 7.575 |
| 1663 | 7.575 |
| 1664 | 7.575 |
| 1665 | 7.575 |
| 1666 | 7.575 |
| 1667 | 7.575 |
| 1668 | 7.575 |
| 1669 | 7.575 |
| 1670 | 7.575 |
| 1671 | 7.575 |
| 1672 | 7.575 |
| 1673 | 7.575 |
| 1674 | 7.575 |
| 1675 | 7.575 |
| 1676 | 7.073 |
| 1677 | 7.575 |
| 1678 | 7.575 |
| 1679 | 7.575 |
| 1680 | 7.575 |
| 1681 | 7.575 |
| 1682 | 7.575 |
| 1683 | 7.575 |
| 1684 | 7.575 |
| 1685 | 8.076 |
| 1686 | 8.076 |
| 1687 | 8.076 |
| 1688 | 8.076 |
| 1689 | 8.076 |
| 1690 | 8.076 |
| 1691 | 8.076 |
| 1692 | 8.076 |
| 1693 | 8.076 |
| 1694 | 8.578 |
| 1695 | 9.079 |
| 1696 | 9.079 |
| 1697 | 8.578 |
| 1698 | 8.076 |
| 1699 | 7.073 |
| 1700 | 7.073 |
| 1701 | 7.575 |
| 1702 | 7.073 |
| 1703 | 7.073 |
| 1704 | 7.575 |
| 1705 | 7.575 |
| 1706 | 7.575 |
| 1707 | 8.076 |
| 1708 | 8.076 |
| 1709 | 8.076 |
| 1710 | 8.076 |
| 1711 | 8.578 |
| 1712 | 8.076 |
| 1713 | 8.076 |
| 1714 | 8.076 |
| 1715 | 8.076 |
| 1716 | 8.076 |
| 1717 | 8.578 |
| 1718 | 8.578 |
| 1719 | 9.079 |
| 1720 | 9.58 |
| 1721 | 9.58 |
| 1722 | 9.079 |
| 1723 | 8.578 |
| 1724 | 8.578 |
| 1725 | 8.076 |
| 1726 | 8.076 |
| 1727 | 7.575 |
| 1728 | 7.575 |
| 1729 | 8.076 |
| 1730 | 8.076 |
| 1731 | 8.578 |
| 1732 | 8.578 |
| 1733 | 8.578 |
| 1734 | 8.578 |
| 1735 | 8.578 |
| 1736 | 8.578 |
| 1737 | 8.578 |
| 1738 | 8.076 |
| 1739 | 8.076 |
| 1740 | 8.076 |
| 1741 | 8.578 |
| 1742 | 9.079 |
| 1743 | 9.079 |
| 1744 | 9.58 |
| 1745 | 10.082 |
| 1746 | 10.583 |
| 1747 | 10.082 |
| 1748 | 9.58 |
| 1749 | 9.079 |
| 1750 | 9.58 |
| 1751 | 9.079 |
| 1752 | 8.076 |
| 1753 | 8.076 |
| 1754 | 8.578 |
| 1755 | 9.079 |
| 1756 | 9.58 |
| 1757 | 9.58 |
| 1758 | 9.58 |
| 1759 | 9.58 |
| 1760 | 9.079 |
| 1761 | 8.578 |
| 1762 | 8.076 |
| 1763 | 8.076 |
| 1764 | 8.578 |
| 1765 | 8.578 |
| 1766 | 9.079 |
| 1767 | 9.58 |
| 1768 | 9.58 |
| 1769 | 9.58 |
| 1770 | 9.58 |
| 1771 | 10.082 |
| 1772 | 9.58 |
| 1773 | 9.079 |
| 1774 | 9.079 |
| 1775 | 8.578 |
| 1776 | 8.578 |
| 1777 | 8.578 |
| 1778 | 8.578 |
| 1779 | 9.079 |
| 1780 | 9.079 |
| 1781 | 9.079 |
| 1782 | 9.58 |
| 1783 | 9.58 |
| 1784 | 9.58 |
| 1785 | 9.079 |
| 1786 | 9.079 |
| 1787 | 9.079 |
| 1788 | 9.079 |
| 1789 | 9.58 |
| 1790 | 9.58 |
| 1791 | 10.082 |
| 1792 | 10.082 |
| 1793 | 10.583 |
| 1794 | 10.583 |
| 1795 | 10.583 |
| 1796 | 10.583 |
| 1797 | 10.583 |
| 1798 | 9.58 |
| 1799 | 9.58 |
| 1800 | 9.58 |
| 1801 | 9.079 |
| 1802 | 9.58 |
| 1803 | 9.58 |
| 1804 | 9.58 |
| 1805 | 9.58 |
| 1806 | 10.082 |
| 1807 | 10.082 |
| 1808 | 10.082 |
| 1809 | 9.58 |
| 1810 | 9.079 |
| 1811 | 9.079 |
| 1812 | 9.079 |
| 1813 | 9.58 |
| 1814 | 9.58 |
| 1815 | 9.58 |
| 1816 | 9.58 |
| 1817 | 10.082 |
| 1818 | 10.082 |
| 1819 | 10.583 |
| 1820 | 10.082 |
| 1821 | 10.082 |
| 1822 | 9.079 |
| 1823 | 8.578 |
| 1824 | 9.58 |
| 1825 | 9.079 |
| 1826 | 9.58 |
| 1827 | 9.58 |
| 1828 | 9.58 |
| 1829 | 9.58 |
| 1830 | 9.58 |
| 1831 | 9.58 |
| 1832 | 9.58 |
| 1833 | 9.58 |
| 1834 | 9.58 |
| 1835 | 9.58 |
| 1836 | 9.58 |
| 1837 | 9.58 |
| 1838 | 9.58 |
| 1839 | 9.58 |
| 1840 | 9.58 |
| 1841 | 10.082 |
| 1842 | 10.082 |
| 1843 | 10.082 |
| 1844 | 10.082 |
| 1845 | 10.082 |
| 1846 | 9.58 |
| 1847 | 9.58 |
| 1848 | 9.58 |
| 1849 | 9.58 |
| 1850 | 9.58 |
| 1851 | 9.58 |
| 1852 | 9.58 |
| 1853 | 9.079 |
| 1854 | 9.079 |
| 1855 | 9.079 |
| 1856 | 9.079 |
| 1857 | 8.578 |
| 1858 | 8.578 |
| 1859 | 8.578 |
| 1860 | 8.578 |
| 1861 | 8.578 |
| 1862 | 8.578 |
| 1863 | 8.578 |
| 1864 | 8.578 |
| 1865 | 8.578 |
| 1866 | 8.076 |
| 1867 | 8.076 |
| 1868 | 8.076 |
| 1869 | 8.076 |
| 1870 | 8.076 |
| 1871 | 8.076 |
| 1872 | 8.076 |
| 1873 | 8.076 |
| 1874 | 8.578 |
| 1875 | 7.575 |
| 1876 | 8.076 |
| 1877 | 8.076 |
| 1878 | 7.575 |
| 1879 | 7.575 |
| 1880 | 7.575 |
| 1881 | 7.575 |
| 1882 | 7.575 |
| 1883 | 7.575 |
| 1884 | 8.076 |
| 1885 | 8.578 |
| 1886 | 8.578 |
| 1887 | 8.578 |
| 1888 | 8.578 |
| 1889 | 8.578 |
| 1890 | 8.578 |
| 1891 | 8.076 |
| 1892 | 8.076 |
| 1893 | 8.076 |
| 1894 | 8.076 |
| 1895 | 8.578 |
| 1896 | 8.578 |
| 1897 | 8.076 |
| 1898 | 8.076 |
| 1899 | 8.076 |
| 1900 | 8.076 |
| 1901 | 7.575 |
| 1902 | 7.575 |
| 1903 | 7.575 |
| 1904 | 7.073 |
| 1905 | 7.073 |
| 1906 | 7.073 |
| 1907 | 7.575 |
| 1908 | 7.575 |
| 1909 | 7.575 |
| 1910 | 7.575 |
| 1911 | 8.076 |
| 1912 | 8.076 |
| 1913 | 7.575 |
| 1914 | 7.575 |
| 1915 | 7.575 |
| 1916 | 7.575 |
| 1917 | 7.575 |
| 1918 | 7.575 |
| 1919 | 7.575 |
| 1920 | 7.575 |
| 1921 | 7.575 |
| 1922 | 7.073 |
| 1923 | 7.073 |
| 1924 | 7.073 |
| 1925 | 7.073 |
| 1926 | 7.073 |
| 1927 | 6.572 |
| 1928 | 6.572 |
| 1929 | 6.572 |
| 1930 | 6.07 |
| 1931 | 6.572 |
| 1932 | 6.572 |
| 1933 | 6.572 |
| 1934 | 6.572 |
| 1935 | 7.073 |
| 1936 | 7.073 |
| 1937 | 7.073 |
| 1938 | 7.073 |
| 1939 | 7.073 |
| 1940 | 7.073 |
| 1941 | 7.073 |
| 1942 | 7.073 |
| 1943 | 7.073 |
| 1944 | 7.575 |
| 1945 | 7.575 |
| 1946 | 7.073 |
| 1947 | 7.073 |
| 1948 | 7.073 |
| 1949 | 7.073 |
| 1950 | 7.073 |
| 1951 | 7.073 |
| 1952 | 7.073 |
| 1953 | 7.073 |
| 1954 | 6.572 |
| 1955 | 7.073 |
| 1956 | 7.575 |
| 1957 | 7.575 |
| 1958 | 7.575 |
| 1959 | 7.575 |
| 1960 | 8.076 |
| 1961 | 8.076 |
| 1962 | 8.076 |
| 1963 | 8.076 |
| 1964 | 7.575 |
| 1965 | 8.076 |
| 1966 | 8.076 |
| 1967 | 8.076 |
| 1968 | 8.076 |
| 1969 | 8.076 |
| 1970 | 8.076 |
| 1971 | 8.076 |
| 1972 | 8.076 |
| 1973 | 7.575 |
| 1974 | 7.575 |
| 1975 | 7.575 |
| 1976 | 7.575 |
| 1977 | 7.575 |
| 1978 | 7.575 |
| 1979 | 7.575 |
| 1980 | 8.076 |
| 1981 | 8.076 |
| 1982 | 8.076 |
| 1983 | 8.578 |
| 1984 | 8.578 |
| 1985 | 8.578 |
| 1986 | 8.076 |
| 1987 | 8.076 |
| 1988 | 8.076 |
| 1989 | 8.076 |
| 1990 | 8.076 |
| 1991 | 8.076 |
| 1992 | 8.076 |
| 1993 | 8.076 |
| 1994 | 8.076 |
| 1995 | 8.076 |
| 1996 | 7.575 |
| 1997 | 8.076 |
| 1998 | 8.076 |
| 1999 | 8.076 |
| 2000 | 8.076 |
| 2001 | 8.076 |
| 2002 | 8.076 |
| 2003 | 8.076 |
| 2004 | 8.578 |
| 2005 | 8.578 |
| 2006 | 9.079 |
| 2007 | 9.58 |
| 2008 | 9.079 |
| 2009 | 9.58 |
| 2010 | 9.079 |
| 2011 | 9.079 |
| 2012 | 8.578 |
| 2013 | 8.578 |
| 2014 | 8.578 |
| 2015 | 8.578 |
| 2016 | 8.578 |
| 2017 | 8.578 |
| 2018 | 8.578 |
| 2019 | 8.578 |
| 2020 | 8.578 |
| 2021 | 8.578 |
| 2022 | 8.578 |
| 2023 | 8.578 |
| 2024 | 8.578 |
| 2025 | 8.578 |
| 2026 | 8.578 |
| 2027 | 9.079 |
| 2028 | 9.58 |
| 2029 | 9.58 |
| 2030 | 9.58 |
| 2031 | 10.082 |
| 2032 | 10.583 |
| 2033 | 10.082 |
| 2034 | 9.58 |
| 2035 | 9.58 |
| 2036 | 9.58 |
| 2037 | 9.079 |
| 2038 | 9.079 |
| 2039 | 9.079 |
| 2040 | 9.079 |
| 2041 | 9.079 |
| 2042 | 9.079 |
| 2043 | 9.58 |
| 2044 | 9.58 |
| 2045 | 9.58 |
| 2046 | 9.58 |
| 2047 | 9.58 |
| 2048 | 9.079 |
| 2049 | 9.079 |
| 2050 | 9.079 |
| 2051 | 9.079 |
| 2052 | 9.58 |
| 2053 | 9.58 |
| 2054 | 10.082 |
| 2055 | 10.082 |
| 2056 | 11.585 |
| 2057 | 11.084 |
| 2058 | 10.583 |
| 2059 | 10.583 |
| 2060 | 10.082 |
| 2061 | 9.58 |
| 2062 | 9.58 |
| 2063 | 9.58 |
| 2064 | 9.58 |
| 2065 | 9.58 |
| 2066 | 9.58 |
| 2067 | 9.58 |
| 2068 | 9.58 |
| 2069 | 10.082 |
| 2070 | 9.58 |
| 2071 | 9.58 |
| 2072 | 9.58 |
| 2073 | 9.58 |
| 2074 | 9.58 |
| 2075 | 9.58 |
| 2076 | 10.082 |
| 2077 | 10.583 |
| 2078 | 10.583 |
| 2079 | 11.084 |
| 2080 | 11.585 |
| 2081 | 12.086 |
| 2082 | 11.585 |
| 2083 | 11.585 |
| 2084 | 11.084 |
| 2085 | 10.082 |
| 2086 | 9.58 |
| 2087 | 9.58 |
| 2088 | 9.58 |
| 2089 | 9.58 |
| 2090 | 10.082 |
| 2091 | 10.583 |
| 2092 | 10.583 |
| 2093 | 11.084 |
| 2094 | 10.583 |
| 2095 | 10.583 |
| 2096 | 10.082 |
| 2097 | 10.082 |
| 2098 | 9.58 |
| 2099 | 10.082 |
| 2100 | 10.082 |
| 2101 | 10.583 |
| 2102 | 10.583 |
| 2103 | 11.084 |
| 2104 | 11.084 |
| 2105 | 11.084 |
| 2106 | 11.585 |
| 2107 | 11.585 |
| 2108 | 10.583 |
| 2109 | 10.082 |
| 2110 | 9.58 |
| 2111 | 9.58 |
| 2112 | 9.58 |
| 2113 | 9.58 |
| 2114 | 10.082 |
| 2115 | 10.583 |
| 2116 | 10.583 |
| 2117 | 10.583 |
| 2118 | 10.583 |
| 2119 | 10.583 |
| 2120 | 10.583 |
| 2121 | 10.082 |
| 2122 | 9.58 |
| 2123 | 9.58 |
| 2124 | 10.082 |
| 2125 | 10.583 |
| 2126 | 11.084 |
| 2127 | 11.084 |
| 2128 | 11.585 |
| 2129 | 11.585 |
| 2130 | 12.086 |
| 2131 | 11.585 |
| 2132 | 10.583 |
| 2133 | 10.082 |
| 2134 | 9.58 |
| 2135 | 9.58 |
| 2136 | 9.58 |
| 2137 | 9.58 |
| 2138 | 9.58 |
| 2139 | 10.082 |
| 2140 | 10.082 |
| 2141 | 10.583 |
| 2142 | 10.583 |
| 2143 | 11.084 |
| 2144 | 11.084 |
| 2145 | 10.082 |
| 2146 | 9.58 |
| 2147 | 9.58 |
| 2148 | 9.079 |
| 2149 | 9.58 |
| 2150 | 9.58 |
| 2151 | 10.082 |
| 2152 | 10.583 |
| 2153 | 11.084 |
| 2154 | 11.084 |
| 2155 | 11.084 |
| 2156 | 10.583 |
| 2157 | 9.58 |
| 2158 | 9.58 |
| 2159 | 9.58 |
| 2160 | 9.58 |
| 2161 | 9.58 |
| 2162 | 9.58 |
| 2163 | 10.082 |
| 2164 | 10.082 |
| 2165 | 10.082 |
| 2166 | 10.583 |
| 2167 | 10.583 |
| 2168 | 11.084 |
| 2169 | 11.084 |
| 2170 | 10.583 |
| 2171 | 10.082 |
| 2172 | 10.082 |
| 2173 | 10.082 |
| 2174 | 10.082 |
| 2175 | 10.082 |
| 2176 | 11.084 |
| 2177 | 11.585 |
| 2178 | 12.086 |
| 2179 | 12.086 |
| 2180 | 11.585 |
| 2181 | 11.084 |
| 2182 | 10.082 |
| 2183 | 9.58 |
| 2184 | 9.58 |
| 2185 | 9.58 |
| 2186 | 9.58 |
| 2187 | 10.583 |
| 2188 | 11.084 |
| 2189 | 11.084 |
| 2190 | 11.084 |
| 2191 | 11.084 |
| 2192 | 11.084 |
| 2193 | 11.585 |
| 2194 | 11.084 |
| 2195 | 10.583 |
| 2196 | 10.583 |
| 2197 | 10.583 |
| 2198 | 10.583 |
| 2199 | 11.084 |
| 2200 | 11.585 |
| 2201 | 12.086 |
| 2202 | 12.086 |
| 2203 | 12.086 |
| 2204 | 12.587 |
| 2205 | 12.086 |
| 2206 | 11.585 |
| 2207 | 10.082 |
| 2208 | 10.082 |
| 2209 | 10.082 |
| 2210 | 10.082 |
| 2211 | 10.082 |
| 2212 | 11.084 |
| 2213 | 11.585 |
| 2214 | 11.585 |
| 2215 | 11.585 |
| 2216 | 12.086 |
| 2217 | 12.086 |
| 2218 | 11.585 |
| 2219 | 10.583 |
| 2220 | 10.082 |
| 2221 | 10.082 |
| 2222 | 10.583 |
| 2223 | 10.583 |
| 2224 | 11.084 |
| 2225 | 11.585 |
| 2226 | 12.086 |
| 2227 | 12.086 |
| 2228 | 12.086 |
| 2229 | 12.086 |
| 2230 | 11.585 |
| 2231 | 10.583 |
| 2232 | 10.583 |
| 2233 | 10.583 |
| 2234 | 10.583 |
| 2235 | 10.583 |
| 2236 | 11.084 |
| 2237 | 11.585 |
| 2238 | 11.585 |
| 2239 | 11.585 |
| 2240 | 11.585 |
| 2241 | 12.086 |
| 2242 | 12.086 |
| 2243 | 12.086 |
| 2244 | 11.585 |
| 2245 | 11.585 |
| 2246 | 11.585 |
| 2247 | 11.585 |
| 2248 | 12.086 |
| 2249 | 12.086 |
| 2250 | 12.086 |
| 2251 | 12.086 |
| 2252 | 12.086 |
| 2253 | 12.086 |
| 2254 | 12.587 |
| 2255 | 11.585 |
| 2256 | 10.583 |
| 2257 | 10.583 |
| 2258 | 10.583 |
| 2259 | 11.084 |
| 2260 | 11.084 |
| 2261 | 11.585 |
| 2262 | 11.585 |
| 2263 | 12.086 |
| 2264 | 12.086 |
| 2265 | 12.086 |
| 2266 | 12.587 |
| 2267 | 12.587 |
| 2268 | 12.086 |
| 2269 | 12.587 |
| 2270 | 12.086 |
| 2271 | 12.086 |
| 2272 | 12.086 |
| 2273 | 12.086 |
| 2274 | 12.086 |
| 2275 | 12.587 |
| 2276 | 13.088 |
| 2277 | 13.088 |
| 2278 | 13.088 |
| 2279 | 12.587 |
| 2280 | 11.585 |
| 2281 | 11.585 |
| 2282 | 11.084 |
| 2283 | 11.084 |
| 2284 | 11.585 |
| 2285 | 12.086 |
| 2286 | 12.086 |
| 2287 | 12.587 |
| 2288 | 12.587 |
| 2289 | 12.587 |
| 2290 | 13.088 |
| 2291 | 13.088 |
| 2292 | 13.589 |
| 2293 | 13.589 |
| 2294 | 13.088 |
| 2295 | 13.088 |
| 2296 | 13.589 |
| 2297 | 13.589 |
| 2298 | 13.088 |
| 2299 | 13.088 |
| 2300 | 13.088 |
| 2301 | 13.088 |
| 2302 | 13.088 |
| 2303 | 13.088 |
| 2304 | 12.587 |
| 2305 | 12.587 |
| 2306 | 12.587 |
| 2307 | 12.086 |
| 2308 | 12.086 |
| 2309 | 12.587 |
| 2310 | 12.587 |
| 2311 | 12.587 |
| 2312 | 13.088 |
| 2313 | 13.088 |
| 2314 | 14.09 |
| 2315 | 14.09 |
| 2316 | 14.09 |
| 2317 | 14.09 |
| 2318 | 14.591 |
| 2319 | 14.09 |
| 2320 | 14.09 |
| 2321 | 14.09 |
| 2322 | 14.09 |
| 2323 | 14.591 |
| 2324 | 14.09 |
| 2325 | 14.09 |
| 2326 | 13.088 |
| 2327 | 13.589 |
| 2328 | 13.088 |
| 2329 | 13.088 |
| 2330 | 13.088 |
| 2331 | 13.088 |
| 2332 | 13.088 |
| 2333 | 13.088 |
| 2334 | 13.088 |
| 2335 | 13.088 |
| 2336 | 13.589 |
| 2337 | 13.589 |
| 2338 | 14.09 |
| 2339 | 14.591 |
| 2340 | 15.593 |
| 2341 | 15.092 |
| 2342 | 15.593 |
| 2343 | 15.092 |
| 2344 | 15.593 |
| 2345 | 15.092 |
| 2346 | 15.593 |
| 2347 | 14.591 |
| 2348 | 14.09 |
| 2349 | 13.589 |
| 2350 | 14.09 |
| 2351 | 14.09 |
| 2352 | 14.09 |
| 2353 | 13.589 |
| 2354 | 13.589 |
| 2355 | 14.09 |
| 2356 | 14.09 |
| 2357 | 14.09 |
| 2358 | 14.09 |
| 2359 | 14.09 |
| 2360 | 13.589 |
| 2361 | 13.589 |
| 2362 | 13.589 |
| 2363 | 14.09 |
| 2364 | 15.092 |
| 2365 | 14.591 |
| 2366 | 14.591 |
| 2367 | 14.591 |
| 2368 | 14.591 |
| 2369 | 14.591 |
| 2370 | 14.591 |
| 2371 | 14.591 |
| 2372 | 14.09 |
| 2373 | 14.09 |
| 2374 | 14.09 |
| 2375 | 14.09 |
| 2376 | 14.09 |
| 2377 | 14.09 |
| 2378 | 14.09 |
| 2379 | 14.09 |
| 2380 | 14.09 |
| 2381 | 14.09 |
| 2382 | 14.09 |
| 2383 | 14.09 |
| 2384 | 14.09 |
| 2385 | 14.09 |
| 2386 | 14.09 |
| 2387 | 14.09 |
| 2388 | 14.591 |
| 2389 | 14.591 |
| 2390 | 15.593 |
| 2391 | 15.593 |
| 2392 | 15.092 |
| 2393 | 14.591 |
| 2394 | 14.09 |
| 2395 | 12.587 |
| 2396 | 12.587 |
| 2397 | 12.587 |
| 2398 | 12.587 |
| 2399 | 11.585 |
| 2400 | 12.587 |
| 2401 | 13.088 |
| 2402 | 13.088 |
| 2403 | 13.589 |
| 2404 | 13.589 |
| 2405 | 14.09 |
| 2406 | 14.09 |
| 2407 | 14.09 |
| 2408 | 13.589 |
| 2409 | 13.088 |
| 2410 | 13.088 |
| 2411 | 13.088 |
| 2412 | 13.589 |
| 2413 | 14.09 |
| 2414 | 14.09 |
| 2415 | 14.591 |
| 2416 | 15.092 |
| 2417 | 15.092 |
| 2418 | 14.09 |
| 2419 | 13.088 |
| 2420 | 12.086 |
| 2421 | 12.086 |
| 2422 | 12.587 |
| 2423 | 13.088 |
| 2424 | 13.088 |
| 2425 | 13.088 |
| 2426 | 13.589 |
| 2427 | 14.09 |
| 2428 | 14.09 |
| 2429 | 14.09 |
| 2430 | 14.09 |
| 2431 | 14.09 |
| 2432 | 13.589 |
| 2433 | 13.589 |
| 2434 | 13.589 |
| 2435 | 13.589 |
| 2436 | 13.589 |
| 2437 | 13.589 |
| 2438 | 14.09 |
| 2439 | 14.09 |
| 2440 | 14.591 |
| 2441 | 14.591 |
| 2442 | 14.591 |
| 2443 | 14.09 |
| 2444 | 13.589 |
| 2445 | 13.088 |
| 2446 | 13.088 |
| 2447 | 12.587 |
| 2448 | 12.587 |
| 2449 | 12.587 |
| 2450 | 13.589 |
| 2451 | 13.589 |
| 2452 | 13.589 |
| 2453 | 14.09 |
| 2454 | 14.09 |
| 2455 | 13.589 |
| 2456 | 13.088 |
| 2457 | 12.587 |
| 2458 | 12.086 |
| 2459 | 12.587 |
| 2460 | 12.587 |
| 2461 | 13.088 |
| 2462 | 14.09 |
| 2463 | 14.591 |
| 2464 | 14.591 |
| 2465 | 15.092 |
| 2466 | 15.092 |
| 2467 | 15.092 |
| 2468 | 14.09 |
| 2469 | 13.088 |
| 2470 | 12.587 |
| 2471 | 12.587 |
| 2472 | 12.587 |
| 2473 | 12.587 |
| 2474 | 13.088 |
| 2475 | 14.09 |
| 2476 | 14.09 |
| 2477 | 14.09 |
| 2478 | 14.09 |
| 2479 | 14.09 |
| 2480 | 13.589 |
| 2481 | 13.088 |
| 2482 | 12.086 |
| 2483 | 13.088 |
| 2484 | 13.589 |
| 2485 | 14.09 |
| 2486 | 14.591 |
| 2487 | 14.591 |
| 2488 | 15.593 |
| 2489 | 16.093 |
| 2490 | 16.594 |
| 2491 | 16.093 |
| 2492 | 14.591 |
| 2493 | 13.589 |
| 2494 | 11.585 |
| 2495 | 12.086 |
| 2496 | 12.587 |
| 2497 | 12.086 |
| 2498 | 12.587 |
| 2499 | 13.589 |
| 2500 | 14.591 |
| 2501 | 15.092 |
| 2502 | 15.092 |
| 2503 | 14.591 |
| 2504 | 14.591 |
| 2505 | 14.09 |
| 2506 | 13.589 |
| 2507 | 13.088 |
| 2508 | 13.589 |
| 2509 | 13.589 |
| 2510 | 14.09 |
| 2511 | 14.591 |
| 2512 | 14.591 |
| 2513 | 15.092 |
| 2514 | 15.092 |
| 2515 | 15.593 |
| 2516 | 14.591 |
| 2517 | 13.088 |
| 2518 | 12.587 |
| 2519 | 12.587 |
| 2520 | 12.587 |
| 2521 | 12.587 |
| 2522 | 13.088 |
| 2523 | 14.09 |
| 2524 | 14.09 |
| 2525 | 14.09 |
| 2526 | 14.591 |
| 2527 | 14.591 |
| 2528 | 14.591 |
| 2529 | 14.591 |
| 2530 | 14.09 |
| 2531 | 13.589 |
| 2532 | 13.589 |
| 2533 | 13.589 |
| 2534 | 14.09 |
| 2535 | 15.092 |
| 2536 | 15.593 |
| 2537 | 15.593 |
| 2538 | 16.093 |
| 2539 | 16.594 |
| 2540 | 16.093 |
| 2541 | 15.092 |
| 2542 | 13.589 |
| 2543 | 13.589 |
| 2544 | 13.088 |
| 2545 | 13.589 |
| 2546 | 13.589 |
| 2547 | 14.591 |
| 2548 | 15.092 |
| 2549 | 15.092 |
| 2550 | 15.092 |
| 2551 | 15.593 |
| 2552 | 16.093 |
| 2553 | 16.093 |
| 2554 | 16.093 |
| 2555 | 15.593 |
| 2556 | 14.591 |
| 2557 | 15.092 |
| 2558 | 14.591 |
| 2559 | 15.593 |
| 2560 | 16.093 |
| 2561 | 16.594 |
| 2562 | 16.594 |
| 2563 | 17.595 |
| 2564 | 17.595 |
| 2565 | 17.095 |
| 2566 | 16.093 |
| 2567 | 14.591 |
| 2568 | 14.09 |
| 2569 | 14.09 |
| 2570 | 14.09 |
| 2571 | 15.092 |
| 2572 | 16.093 |
| 2573 | 16.093 |
| 2574 | 16.093 |
| 2575 | 16.594 |
| 2576 | 16.594 |
| 2577 | 17.095 |
| 2578 | 17.095 |
| 2579 | 17.095 |
| 2580 | 15.593 |
| 2581 | 15.593 |
| 2582 | 15.092 |
| 2583 | 15.593 |
| 2584 | 16.594 |
| 2585 | 17.095 |
| 2586 | 17.595 |
| 2587 | 17.595 |
| 2588 | 18.596 |
| 2589 | 17.595 |
| 2590 | 17.095 |
| 2591 | 15.593 |
| 2592 | 14.09 |
| 2593 | 14.591 |
| 2594 | 14.591 |
| 2595 | 15.092 |
| 2596 | 16.093 |
| 2597 | 16.594 |
| 2598 | 16.594 |
| 2599 | 17.095 |
| 2600 | 17.095 |
| 2601 | 17.595 |
| 2602 | 17.595 |
| 2603 | 17.595 |
| 2604 | 17.095 |
| 2605 | 16.594 |
| 2606 | 16.594 |
| 2607 | 17.095 |
| 2608 | 17.095 |
| 2609 | 18.096 |
| 2610 | 18.096 |
| 2611 | 18.596 |
| 2612 | 19.097 |
| 2613 | 18.596 |
| 2614 | 17.595 |
| 2615 | 17.095 |
| 2616 | 16.594 |
| 2617 | 16.594 |
| 2618 | 16.594 |
| 2619 | 16.594 |
| 2620 | 17.095 |
| 2621 | 17.595 |
| 2622 | 17.595 |
| 2623 | 17.095 |
| 2624 | 17.595 |
| 2625 | 18.096 |
| 2626 | 18.596 |
| 2627 | 18.596 |
| 2628 | 18.096 |
| 2629 | 18.096 |
| 2630 | 18.096 |
| 2631 | 18.596 |
| 2632 | 18.596 |
| 2633 | 18.596 |
| 2634 | 18.596 |
| 2635 | 19.097 |
| 2636 | 19.597 |
| 2637 | 20.098 |
| 2638 | 20.598 |
| 2639 | 19.597 |
| 2640 | 19.097 |
| 2641 | 18.596 |
| 2642 | 19.097 |
| 2643 | 18.596 |
| 2644 | 18.096 |
| 2645 | 18.096 |
| 2646 | 18.096 |
| 2647 | 18.596 |
| 2648 | 18.596 |
| 2649 | 19.097 |
| 2650 | 19.597 |
| 2651 | 19.597 |
| 2652 | 19.097 |
| 2653 | 19.097 |
| 2654 | 18.596 |
| 2655 | 18.596 |
| 2656 | 19.097 |
| 2657 | 19.097 |
| 2658 | 18.596 |
| 2659 | 18.596 |
| 2660 | 19.097 |
| 2661 | 19.597 |
| 2662 | 20.098 |
| 2663 | 19.597 |
| 2664 | 19.097 |
| 2665 | 18.596 |
| 2666 | 18.096 |
| 2667 | 17.595 |
| 2668 | 17.595 |
| 2669 | 17.595 |
| 2670 | 18.096 |
| 2671 | 18.096 |
| 2672 | 18.596 |
| 2673 | 18.596 |
| 2674 | 19.097 |
| 2675 | 19.597 |
| 2676 | 20.098 |
| 2677 | 20.598 |
| 2678 | 19.597 |
| 2679 | 18.096 |
| 2680 | 17.095 |
| 2681 | 18.096 |
| 2682 | 17.595 |
| 2683 | 17.595 |
| 2684 | 17.595 |
| 2685 | 17.595 |
| 2686 | 17.595 |
| 2687 | 17.595 |
| 2688 | 17.095 |
| 2689 | 16.093 |
| 2690 | 16.093 |
| 2691 | 16.594 |
| 2692 | 16.093 |
| 2693 | 16.594 |
| 2694 | 16.594 |
| 2695 | 17.095 |
| 2696 | 17.095 |
| 2697 | 17.595 |
| 2698 | 17.595 |
| 2699 | 18.096 |
| 2700 | 18.596 |
| 2701 | 19.597 |
| 2702 | 20.098 |
| 2703 | 19.597 |
| 2704 | 18.596 |
| 2705 | 18.096 |
| 2706 | 16.594 |
| 2707 | 16.093 |
| 2708 | 15.593 |
| 2709 | 15.593 |
| 2710 | 15.593 |
| 2711 | 15.593 |
| 2712 | 16.093 |
| 2713 | 16.594 |
| 2714 | 16.594 |
| 2715 | 17.095 |
| 2716 | 17.595 |
| 2717 | 17.595 |
| 2718 | 17.095 |
| 2719 | 17.095 |
| 2720 | 17.095 |
| 2721 | 17.095 |
| 2722 | 17.095 |
| 2723 | 17.595 |
| 2724 | 18.096 |
| 2725 | 18.596 |
| 2726 | 19.597 |
| 2727 | 19.097 |
| 2728 | 19.097 |
| 2729 | 17.095 |
| 2730 | 17.095 |
| 2731 | 14.591 |
| 2732 | 14.591 |
| 2733 | 15.092 |
| 2734 | 15.092 |
| 2735 | 15.593 |
| 2736 | 16.093 |
| 2737 | 16.594 |
| 2738 | 17.095 |
| 2739 | 17.095 |
| 2740 | 17.595 |
| 2741 | 18.596 |
| 2742 | 18.096 |
| 2743 | 17.595 |
| 2744 | 17.095 |
| 2745 | 17.095 |
| 2746 | 17.095 |
| 2747 | 17.595 |
| 2748 | 18.096 |
| 2749 | 18.596 |
| 2750 | 19.097 |
| 2751 | 19.597 |
| 2752 | 20.598 |
| 2753 | 19.097 |
| 2754 | 17.095 |
| 2755 | 16.594 |
| 2756 | 16.093 |
| 2757 | 15.092 |
| 2758 | 14.591 |
| 2759 | 15.092 |
| 2760 | 15.593 |
| 2761 | 16.594 |
| 2762 | 17.595 |
| 2763 | 17.595 |
| 2764 | 18.096 |
| 2765 | 18.596 |
| 2766 | 18.096 |
| 2767 | 18.096 |
| 2768 | 17.595 |
| 2769 | 17.595 |
| 2770 | 17.095 |
| 2771 | 17.595 |
| 2772 | 18.096 |
| 2773 | 18.596 |
| 2774 | 18.596 |
| 2775 | 19.097 |
| 2776 | 20.098 |
| 2777 | 20.598 |
| 2778 | 19.597 |
| 2779 | 17.595 |
| 2780 | 17.595 |
| 2781 | 15.092 |
| 2782 | 14.591 |
| 2783 | 14.591 |
| 2784 | 15.593 |
| 2785 | 16.594 |
| 2786 | 18.096 |
| 2787 | 18.096 |
| 2788 | 18.596 |
| 2789 | 18.596 |
| 2790 | 18.596 |
| 2791 | 18.096 |
| 2792 | 18.096 |
| 2793 | 18.096 |
| 2794 | 18.096 |
| 2795 | 18.596 |
| 2796 | 18.596 |
| 2797 | 18.596 |
| 2798 | 19.097 |
| 2799 | 19.097 |
| 2800 | 19.597 |
| 2801 | 19.597 |
| 2802 | 20.098 |
| 2803 | 20.098 |
| 2804 | 19.597 |
| 2805 | 19.097 |
| 2806 | 18.596 |
| 2807 | 18.596 |
| 2808 | 18.596 |
| 2809 | 19.097 |
| 2810 | 19.597 |
| 2811 | 19.597 |
| 2812 | 19.597 |
| 2813 | 19.597 |
| 2814 | 19.097 |
| 2815 | 19.097 |
| 2816 | 19.597 |
| 2817 | 19.597 |
| 2818 | 19.097 |
| 2819 | 19.097 |
| 2820 | 18.596 |
| 2821 | 19.097 |
| 2822 | 19.597 |
| 2823 | 20.098 |
| 2824 | 20.098 |
| 2825 | 20.598 |
| 2826 | 20.598 |
| 2827 | 20.598 |
| 2828 | 20.098 |
| 2829 | 18.096 |
| 2830 | 17.595 |
| 2831 | 17.095 |
| 2832 | 17.095 |
| 2833 | 17.095 |
| 2834 | 18.096 |
| 2835 | 19.097 |
| 2836 | 19.097 |
| 2837 | 19.097 |
| 2838 | 19.597 |
| 2839 | 19.597 |
| 2840 | 20.098 |
| 2841 | 19.597 |
| 2842 | 18.096 |
| 2843 | 18.096 |
| 2844 | 19.097 |
| 2845 | 18.096 |
| 2846 | 19.097 |
| 2847 | 20.098 |
| 2848 | 20.098 |
| 2849 | 20.598 |
| 2850 | 20.598 |
| 2851 | 20.598 |
| 2852 | 19.097 |
| 2853 | 18.096 |
| 2854 | 17.595 |
| 2855 | 17.595 |
| 2856 | 17.595 |
| 2857 | 17.095 |
| 2858 | 18.096 |
| 2859 | 19.097 |
| 2860 | 19.097 |
| 2861 | 19.097 |
| 2862 | 19.597 |
| 2863 | 19.597 |
| 2864 | 19.597 |
| 2865 | 19.097 |
| 2866 | 17.595 |
| 2867 | 16.594 |
| 2868 | 17.095 |
| 2869 | 17.595 |
| 2870 | 17.595 |
| 2871 | 18.096 |
| 2872 | 19.097 |
| 2873 | 19.597 |
| 2874 | 19.597 |
| 2875 | 19.597 |
| 2876 | 19.097 |
| 2877 | 18.096 |
| 2878 | 17.095 |
| 2879 | 16.093 |
| 2880 | 16.594 |
| 2881 | 16.093 |
| 2882 | 16.594 |
| 2883 | 17.595 |
| 2884 | 18.596 |
| 2885 | 18.596 |
| 2886 | 18.596 |
| 2887 | 18.596 |
| 2888 | 18.096 |
| 2889 | 18.096 |
| 2890 | 17.095 |
| 2891 | 16.093 |
| 2892 | 16.594 |
| 2893 | 16.594 |
| 2894 | 16.594 |
| 2895 | 16.594 |
| 2896 | 17.595 |
| 2897 | 18.096 |
| 2898 | 18.596 |
| 2899 | 18.596 |
| 2900 | 18.596 |
| 2901 | 17.595 |
| 2902 | 17.095 |
| 2903 | 16.594 |
| 2904 | 16.093 |
| 2905 | 16.093 |
| 2906 | 16.093 |
| 2907 | 16.594 |
| 2908 | 17.595 |
| 2909 | 17.595 |
| 2910 | 17.595 |
| 2911 | 17.595 |
| 2912 | 17.595 |
| 2913 | 17.595 |
| 2914 | 17.595 |
| 2915 | 17.595 |
| 2916 | 17.595 |
| 2917 | 17.595 |
| 2918 | 17.595 |
| 2919 | 18.096 |
| 2920 | 18.096 |
| 2921 | 18.596 |
| 2922 | 18.596 |
| 2923 | 18.596 |
| 2924 | 19.097 |
| 2925 | 18.596 |
| 2926 | 18.596 |
| 2927 | 17.595 |
| 2928 | 17.095 |
| 2929 | 17.095 |
| 2930 | 17.095 |
| 2931 | 17.095 |
| 2932 | 18.096 |
| 2933 | 18.096 |
| 2934 | 18.096 |
| 2935 | 18.096 |
| 2936 | 18.596 |
| 2937 | 18.596 |
| 2938 | 18.596 |
| 2939 | 18.096 |
| 2940 | 17.595 |
| 2941 | 17.595 |
| 2942 | 18.096 |
| 2943 | 18.096 |
| 2944 | 18.096 |
| 2945 | 18.096 |
| 2946 | 18.596 |
| 2947 | 19.097 |
| 2948 | 18.596 |
| 2949 | 18.096 |
| 2950 | 17.595 |
| 2951 | 17.095 |
| 2952 | 17.095 |
| 2953 | 17.095 |
| 2954 | 17.595 |
| 2955 | 17.595 |
| 2956 | 17.595 |
| 2957 | 18.096 |
| 2958 | 18.096 |
| 2959 | 18.096 |
| 2960 | 18.096 |
| 2961 | 18.096 |
| 2962 | 18.596 |
| 2963 | 18.596 |
| 2964 | 18.596 |
| 2965 | 18.596 |
| 2966 | 18.596 |
| 2967 | 18.596 |
| 2968 | 18.596 |
| 2969 | 18.596 |
| 2970 | 18.596 |
| 2971 | 18.596 |
| 2972 | 19.097 |
| 2973 | 19.097 |
| 2974 | 19.097 |
| 2975 | 19.097 |
| 2976 | 19.097 |
| 2977 | 19.097 |
| 2978 | 19.097 |
| 2979 | 18.596 |
| 2980 | 19.097 |
| 2981 | 18.596 |
| 2982 | 18.596 |
| 2983 | 18.596 |
| 2984 | 19.097 |
| 2985 | 19.097 |
| 2986 | 19.097 |
| 2987 | 19.097 |
| 2988 | 19.597 |
| 2989 | 19.097 |
| 2990 | 19.097 |
| 2991 | 19.097 |
| 2992 | 19.597 |
| 2993 | 19.597 |
| 2994 | 19.597 |
| 2995 | 19.597 |
| 2996 | 20.098 |
| 2997 | 20.098 |
| 2998 | 20.098 |
| 2999 | 20.098 |
| 3000 | 19.597 |
| 3001 | 19.597 |
| 3002 | 19.597 |
| 3003 | 19.597 |
| 3004 | 19.597 |
| 3005 | 19.597 |
| 3006 | 19.597 |
| 3007 | 19.597 |
| 3008 | 20.098 |
| 3009 | 20.098 |
| 3010 | 20.098 |
| 3011 | 20.598 |
| 3012 | 20.598 |
| 3013 | 20.598 |
| 3014 | 20.598 |
| 3015 | 20.598 |
| 3016 | 20.598 |
| 3017 | 20.598 |
| 3018 | 20.598 |
| 3019 | 20.598 |
| 3020 | 20.598 |
| 3021 | 21.599 |
| 3022 | 21.599 |
| 3023 | 21.599 |
| 3024 | 20.598 |
| 3025 | 20.098 |
| 3026 | 20.098 |
| 3027 | 20.098 |
| 3028 | 20.098 |
| 3029 | 20.598 |
| 3030 | 20.598 |
| 3031 | 20.598 |
| 3032 | 20.598 |
| 3033 | 20.598 |
| 3034 | 20.598 |
| 3035 | 21.099 |
| 3036 | 21.599 |
| 3037 | 21.599 |
| 3038 | 22.099 |
| 3039 | 21.599 |
| 3040 | 21.599 |
| 3041 | 21.599 |
| 3042 | 21.099 |
| 3043 | 21.599 |
| 3044 | 21.599 |
| 3045 | 21.599 |
| 3046 | 21.599 |
| 3047 | 21.599 |
| 3048 | 21.099 |
| 3049 | 21.099 |
| 3050 | 21.099 |
| 3051 | 21.599 |
| 3052 | 21.599 |
| 3053 | 21.099 |
| 3054 | 21.099 |
| 3055 | 21.099 |
| 3056 | 21.099 |
| 3057 | 21.099 |
| 3058 | 21.599 |
| 3059 | 21.599 |
| 3060 | 22.099 |
| 3061 | 22.099 |
| 3062 | 22.599 |
| 3063 | 22.099 |
| 3064 | 21.599 |
| 3065 | 22.099 |
| 3066 | 21.599 |
| 3067 | 20.598 |
| 3068 | 20.598 |
| 3069 | 21.099 |
| 3070 | 21.099 |
| 3071 | 21.099 |
| 3072 | 21.099 |
| 3073 | 21.099 |
| 3074 | 21.099 |
| 3075 | 21.099 |
| 3076 | 21.099 |
| 3077 | 21.099 |
| 3078 | 21.099 |
| 3079 | 21.099 |
| 3080 | 20.598 |
| 3081 | 20.598 |
| 3082 | 21.099 |
| 3083 | 21.099 |
| 3084 | 21.599 |
| 3085 | 21.599 |
| 3086 | 22.099 |
| 3087 | 22.099 |
| 3088 | 22.099 |
| 3089 | 22.099 |
| 3090 | 21.099 |
| 3091 | 20.598 |
| 3092 | 20.598 |
| 3093 | 20.598 |
| 3094 | 20.098 |
| 3095 | 20.098 |
| 3096 | 20.598 |
| 3097 | 21.099 |
| 3098 | 21.099 |
| 3099 | 21.099 |
| 3100 | 21.099 |
| 3101 | 21.099 |
| 3102 | 21.099 |
| 3103 | 21.099 |
| 3104 | 21.099 |
| 3105 | 21.099 |
| 3106 | 21.099 |
| 3107 | 21.099 |
| 3108 | 21.099 |
| 3109 | 21.599 |
| 3110 | 21.599 |
| 3111 | 22.099 |
| 3112 | 22.099 |
| 3113 | 22.099 |
| 3114 | 21.099 |
| 3115 | 19.597 |
| 3116 | 19.597 |
| 3117 | 19.597 |
| 3118 | 19.597 |
| 3119 | 20.098 |
| 3120 | 20.098 |
| 3121 | 20.598 |
| 3122 | 20.598 |
| 3123 | 20.598 |
| 3124 | 21.099 |
| 3125 | 21.099 |
| 3126 | 21.099 |
| 3127 | 20.598 |
| 3128 | 20.598 |
| 3129 | 20.598 |
| 3130 | 20.598 |
| 3131 | 20.598 |
| 3132 | 20.598 |
| 3133 | 21.099 |
| 3134 | 21.599 |
| 3135 | 21.599 |
| 3136 | 22.599 |
| 3137 | 22.099 |
| 3138 | 21.599 |
| 3139 | 20.598 |
| 3140 | 20.098 |
| 3141 | 20.098 |
| 3142 | 20.098 |
| 3143 | 20.098 |
| 3144 | 20.098 |
| 3145 | 20.598 |
| 3146 | 21.099 |
| 3147 | 21.099 |
| 3148 | 21.599 |
| 3149 | 21.599 |
| 3150 | 21.599 |
| 3151 | 21.099 |
| 3152 | 20.598 |
| 3153 | 20.598 |
| 3154 | 20.598 |
| 3155 | 20.598 |
| 3156 | 21.099 |
| 3157 | 21.599 |
| 3158 | 22.099 |
| 3159 | 22.599 |
| 3160 | 23.099 |
| 3161 | 23.6 |
| 3162 | 22.599 |
| 3163 | 20.598 |
| 3164 | 19.597 |
| 3165 | 19.597 |
| 3166 | 19.597 |
| 3167 | 19.597 |
| 3168 | 19.597 |
| 3169 | 20.098 |
| 3170 | 21.099 |
| 3171 | 21.599 |
| 3172 | 22.099 |
| 3173 | 22.099 |
| 3174 | 22.099 |
| 3175 | 21.599 |
| 3176 | 21.099 |
| 3177 | 20.598 |
| 3178 | 20.098 |
| 3179 | 20.098 |
| 3180 | 20.598 |
| 3181 | 21.099 |
| 3182 | 21.599 |
| 3183 | 22.599 |
| 3184 | 23.099 |
| 3185 | 23.099 |
| 3186 | 22.099 |
| 3187 | 21.599 |
| 3188 | 20.098 |
| 3189 | 19.597 |
| 3190 | 19.597 |
| 3191 | 19.597 |
| 3192 | 19.597 |
| 3193 | 19.597 |
| 3194 | 20.598 |
| 3195 | 21.099 |
| 3196 | 21.099 |
| 3197 | 21.099 |
| 3198 | 21.099 |
| 3199 | 21.099 |
| 3200 | 21.099 |
| 3201 | 20.598 |
| 3202 | 19.597 |
| 3203 | 19.597 |
| 3204 | 19.597 |
| 3205 | 20.098 |
| 3206 | 20.598 |
| 3207 | 21.099 |
| 3208 | 21.599 |
| 3209 | 21.599 |
| 3210 | 21.099 |
| 3211 | 21.099 |
| 3212 | 20.098 |
| 3213 | 19.597 |
| 3214 | 19.097 |
| 3215 | 19.097 |
| 3216 | 19.097 |
| 3217 | 19.097 |
| 3218 | 19.097 |
| 3219 | 20.098 |
| 3220 | 20.098 |
| 3221 | 19.597 |
| 3222 | 19.597 |
| 3223 | 19.597 |
| 3224 | 19.097 |
| 3225 | 19.097 |
| 3226 | 18.596 |
| 3227 | 18.596 |
| 3228 | 18.096 |
| 3229 | 18.596 |
| 3230 | 18.596 |
| 3231 | 19.097 |
| 3232 | 19.097 |
| 3233 | 19.597 |
| 3234 | 19.597 |
| 3235 | 19.597 |
| 3236 | 19.097 |
| 3237 | 19.097 |
| 3238 | 18.596 |
| 3239 | 18.596 |
| 3240 | 18.596 |
| 3241 | 18.596 |
| 3242 | 19.097 |
| 3243 | 18.596 |
| 3244 | 18.596 |
| 3245 | 18.596 |
| 3246 | 18.596 |
| 3247 | 18.596 |
| 3248 | 18.596 |
| 3249 | 18.596 |
| 3250 | 18.596 |
| 3251 | 17.595 |
| 3252 | 17.595 |
| 3253 | 18.096 |
| 3254 | 18.096 |
| 3255 | 18.096 |
| 3256 | 18.596 |
| 3257 | 19.097 |
| 3258 | 19.097 |
| 3259 | 19.097 |
| 3260 | 19.097 |
| 3261 | 19.097 |
| 3262 | 18.596 |
| 3263 | 17.595 |
| 3264 | 18.096 |
| 3265 | 17.595 |
| 3266 | 17.595 |
| 3267 | 18.096 |
| 3268 | 18.596 |
| 3269 | 18.596 |
| 3270 | 18.596 |
| 3271 | 18.596 |
| 3272 | 18.596 |
| 3273 | 18.596 |
| 3274 | 19.097 |
| 3275 | 18.596 |
| 3276 | 18.596 |
| 3277 | 19.097 |
| 3278 | 19.097 |
| 3279 | 19.097 |
| 3280 | 19.097 |
| 3281 | 19.097 |
| 3282 | 19.597 |
| 3283 | 19.597 |
| 3284 | 19.597 |
| 3285 | 19.597 |
| 3286 | 19.097 |
| 3287 | 18.596 |
| 3288 | 18.596 |
| 3289 | 18.596 |
| 3290 | 18.596 |
| 3291 | 19.097 |
| 3292 | 19.097 |
| 3293 | 19.097 |
| 3294 | 19.097 |
| 3295 | 19.097 |
| 3296 | 19.097 |
| 3297 | 19.097 |
| 3298 | 19.597 |
| 3299 | 19.597 |
| 3300 | 19.597 |
| 3301 | 19.097 |
| 3302 | 19.597 |
| 3303 | 19.597 |
| 3304 | 19.597 |
| 3305 | 20.098 |
| 3306 | 20.098 |
| 3307 | 20.098 |
| 3308 | 20.598 |
| 3309 | 20.598 |
| 3310 | 20.598 |
| 3311 | 19.597 |
| 3312 | 19.597 |
| 3313 | 19.597 |
| 3314 | 19.597 |
| 3315 | 19.597 |
| 3316 | 20.098 |
| 3317 | 20.098 |
| 3318 | 20.098 |
| 3319 | 20.098 |
| 3320 | 20.098 |
| 3321 | 20.098 |
| 3322 | 20.598 |
| 3323 | 20.598 |
| 3324 | 20.098 |
| 3325 | 20.598 |
| 3326 | 20.098 |
| 3327 | 20.598 |
| 3328 | 20.098 |
| 3329 | 20.598 |
| 3330 | 20.598 |
| 3331 | 21.099 |
| 3332 | 21.099 |
| 3333 | 21.599 |
| 3334 | 21.599 |
| 3335 | 21.599 |
| 3336 | 21.099 |
| 3337 | 21.099 |
| 3338 | 20.598 |
| 3339 | 20.598 |
| 3340 | 20.598 |
| 3341 | 20.598 |
| 3342 | 20.598 |
| 3343 | 20.598 |
| 3344 | 20.598 |
| 3345 | 20.598 |
| 3346 | 21.099 |
| 3347 | 21.599 |
| 3348 | 21.099 |
| 3349 | 21.099 |
| 3350 | 21.099 |
| 3351 | 21.099 |
| 3352 | 21.599 |
| 3353 | 21.099 |
| 3354 | 21.099 |
| 3355 | 21.099 |
| 3356 | 21.099 |
| 3357 | 21.599 |
| 3358 | 21.599 |
| 3359 | 21.599 |
| 3360 | 21.599 |
| 3361 | 21.099 |
| 3362 | 21.099 |
| 3363 | 21.099 |
| 3364 | 21.099 |
| 3365 | 21.099 |
| 3366 | 21.099 |
| 3367 | 21.099 |
| 3368 | 21.099 |
| 3369 | 21.099 |
| 3370 | 21.599 |
| 3371 | 21.599 |
| 3372 | 22.099 |
| 3373 | 22.099 |
| 3374 | 22.099 |
| 3375 | 21.599 |
| 3376 | 21.599 |
| 3377 | 21.099 |
| 3378 | 21.099 |
| 3379 | 21.099 |
| 3380 | 21.099 |
| 3381 | 21.099 |
| 3382 | 21.099 |
| 3383 | 21.599 |
| 3384 | 22.099 |
| 3385 | 22.099 |
| 3386 | 22.099 |
| 3387 | 22.099 |
| 3388 | 22.099 |
| 3389 | 21.599 |
| 3390 | 21.599 |
| 3391 | 21.599 |
| 3392 | 22.099 |
| 3393 | 21.599 |
| 3394 | 21.599 |
| 3395 | 21.599 |
| 3396 | 21.599 |
| 3397 | 21.599 |
| 3398 | 21.599 |
| 3399 | 22.099 |
| 3400 | 21.599 |
| 3401 | 21.099 |
| 3402 | 21.099 |
| 3403 | 21.099 |
| 3404 | 21.099 |
| 3405 | 21.099 |
| 3406 | 21.099 |
| 3407 | 21.599 |
| 3408 | 21.599 |
| 3409 | 21.599 |
| 3410 | 21.599 |
| 3411 | 21.599 |
| 3412 | 21.599 |
| 3413 | 21.099 |
| 3414 | 21.599 |
| 3415 | 21.099 |
| 3416 | 21.599 |
| 3417 | 21.599 |
| 3418 | 21.599 |
| 3419 | 21.599 |
| 3420 | 21.599 |
| 3421 | 21.099 |
| 3422 | 21.599 |
| 3423 | 21.599 |
| 3424 | 21.099 |
| 3425 | 21.099 |
| 3426 | 20.598 |
| 3427 | 20.598 |
| 3428 | 20.598 |
| 3429 | 20.598 |
| 3430 | 20.598 |
| 3431 | 21.099 |
| 3432 | 21.099 |
| 3433 | 21.599 |
| 3434 | 21.599 |
| 3435 | 21.599 |
| 3436 | 21.599 |
| 3437 | 21.599 |
| 3438 | 21.599 |
| 3439 | 21.099 |
| 3440 | 21.099 |
| 3441 | 21.099 |
| 3442 | 21.599 |
| 3443 | 21.599 |
| 3444 | 22.099 |
| 3445 | 22.099 |
| 3446 | 22.599 |
| 3447 | 22.599 |
| 3448 | 23.6 |
| 3449 | 22.099 |
| 3450 | 21.099 |
| 3451 | 21.099 |
| 3452 | 20.598 |
| 3453 | 20.598 |
| 3454 | 20.598 |
| 3455 | 21.099 |
| 3456 | 21.599 |
| 3457 | 22.099 |
| 3458 | 22.599 |
| 3459 | 22.599 |
| 3460 | 22.599 |
| 3461 | 22.599 |
| 3462 | 22.099 |
| 3463 | 22.099 |
| 3464 | 21.599 |
| 3465 | 21.099 |
| 3466 | 21.599 |
| 3467 | 21.599 |
| 3468 | 22.099 |
| 3469 | 22.599 |
| 3470 | 23.099 |
| 3471 | 23.6 |
| 3472 | 24.6 |
| 3473 | 23.099 |
| 3474 | 22.099 |
| 3475 | 21.099 |
| 3476 | 21.099 |
| 3477 | 21.099 |
| 3478 | 21.099 |
| 3479 | 21.099 |
| 3480 | 21.599 |
| 3481 | 22.099 |
| 3482 | 23.099 |
| 3483 | 23.099 |
| 3484 | 23.099 |
| 3485 | 23.099 |
| 3486 | 23.099 |
| 3487 | 22.599 |
| 3488 | 22.599 |
| 3489 | 22.099 |
| 3490 | 22.099 |
| 3491 | 22.599 |
| 3492 | 22.599 |
| 3493 | 23.099 |
| 3494 | 23.6 |
| 3495 | 24.1 |
| 3496 | 24.1 |
| 3497 | 25.1 |
| 3498 | 23.6 |
| 3499 | 22.099 |
| 3500 | 22.099 |
| 3501 | 21.599 |
| 3502 | 21.599 |
| 3503 | 21.599 |
| 3504 | 21.599 |
| 3505 | 22.099 |
| 3506 | 23.099 |
| 3507 | 23.6 |
| 3508 | 24.1 |
| 3509 | 24.1 |
| 3510 | 23.6 |
| 3511 | 23.6 |
| 3512 | 23.099 |
| 3513 | 23.099 |
| 3514 | 22.099 |
| 3515 | 22.599 |
| 3516 | 22.599 |
| 3517 | 23.099 |
| 3518 | 24.1 |
| 3519 | 24.6 |
| 3520 | 24.6 |
| 3521 | 25.1 |
| 3522 | 24.1 |
| 3523 | 24.1 |
| 3524 | 23.099 |
| 3525 | 22.599 |
| 3526 | 22.099 |
| 3527 | 22.099 |
| 3528 | 22.099 |
| 3529 | 22.599 |
| 3530 | 23.6 |
| 3531 | 24.6 |
| 3532 | 24.6 |
| 3533 | 24.1 |
| 3534 | 24.1 |
| 3535 | 24.1 |
| 3536 | 24.1 |
| 3537 | 23.6 |
| 3538 | 23.099 |
| 3539 | 22.599 |
| 3540 | 23.099 |
| 3541 | 23.6 |
| 3542 | 23.6 |
| 3543 | 24.6 |
| 3544 | 24.6 |
| 3545 | 25.1 |
| 3546 | 25.6 |
| 3547 | 24.6 |
| 3548 | 24.1 |
| 3549 | 23.099 |
| 3550 | 22.599 |
| 3551 | 22.599 |
| 3552 | 22.599 |
| 3553 | 22.599 |
| 3554 | 24.1 |
| 3555 | 24.6 |
| 3556 | 24.6 |
| 3557 | 24.6 |
| 3558 | 24.6 |
| 3559 | 24.6 |
| 3560 | 25.1 |
| 3561 | 24.1 |
| 3562 | 23.099 |
| 3563 | 23.099 |
| 3564 | 23.099 |
| 3565 | 23.099 |
| 3566 | 23.6 |
| 3567 | 24.1 |
| 3568 | 24.6 |
| 3569 | 24.6 |
| 3570 | 25.6 |
| 3571 | 25.1 |
| 3572 | 24.6 |
| 3573 | 24.1 |
| 3574 | 23.099 |
| 3575 | 23.099 |
| 3576 | 23.099 |
| 3577 | 23.099 |
| 3578 | 24.1 |
| 3579 | 24.6 |
| 3580 | 24.6 |
| 3581 | 24.6 |
| 3582 | 24.6 |
| 3583 | 24.6 |
| 3584 | 25.1 |
| 3585 | 25.1 |
| 3586 | 23.6 |
| 3587 | 23.099 |
| 3588 | 23.099 |
| 3589 | 23.6 |
| 3590 | 23.6 |
| 3591 | 23.6 |
| 3592 | 24.6 |
| 3593 | 24.6 |
| 3594 | 25.1 |
| 3595 | 25.1 |
| 3596 | 25.1 |
| 3597 | 24.6 |
| 3598 | 23.6 |
| 3599 | 23.099 |
| 3600 | 23.099 |
| 3601 | 23.099 |
| 3602 | 23.6 |
| 3603 | 24.6 |
| 3604 | 24.6 |
| 3605 | 24.6 |
| 3606 | 24.6 |
| 3607 | 24.6 |
| 3608 | 25.1 |
| 3609 | 25.1 |
| 3610 | 24.1 |
| 3611 | 23.099 |
| 3612 | 22.599 |
| 3613 | 22.599 |
| 3614 | 23.099 |
| 3615 | 23.099 |
| 3616 | 23.6 |
| 3617 | 24.1 |
| 3618 | 25.1 |
| 3619 | 24.6 |
| 3620 | 25.1 |
| 3621 | 24.1 |
| 3622 | 23.6 |
| 3623 | 23.099 |
| 3624 | 23.099 |
| 3625 | 22.599 |
| 3626 | 22.599 |
| 3627 | 23.6 |
| 3628 | 24.1 |
| 3629 | 24.1 |
| 3630 | 24.1 |
| 3631 | 24.6 |
| 3632 | 24.1 |
| 3633 | 24.1 |
| 3634 | 24.1 |
| 3635 | 23.099 |
| 3636 | 22.099 |
| 3637 | 22.099 |
| 3638 | 22.599 |
| 3639 | 22.599 |
| 3640 | 23.099 |
| 3641 | 23.6 |
| 3642 | 24.6 |
| 3643 | 24.6 |
| 3644 | 25.6 |
| 3645 | 24.1 |
| 3646 | 23.099 |
| 3647 | 22.599 |
| 3648 | 22.099 |
| 3649 | 22.099 |
| 3650 | 22.099 |
| 3651 | 22.099 |
| 3652 | 23.099 |
| 3653 | 23.6 |
| 3654 | 24.1 |
| 3655 | 24.1 |
| 3656 | 24.1 |
| 3657 | 24.1 |
| 3658 | 23.6 |
| 3659 | 23.6 |
| 3660 | 23.099 |
| 3661 | 22.599 |
| 3662 | 22.099 |
| 3663 | 22.599 |
| 3664 | 23.099 |
| 3665 | 23.6 |
| 3666 | 23.6 |
| 3667 | 23.6 |
| 3668 | 24.1 |
| 3669 | 24.1 |
| 3670 | 23.099 |
| 3671 | 23.099 |
| 3672 | 22.599 |
| 3673 | 22.599 |
| 3674 | 22.599 |
| 3675 | 22.599 |
| 3676 | 23.099 |
| 3677 | 23.6 |
| 3678 | 24.1 |
| 3679 | 24.1 |
| 3680 | 24.1 |
| 3681 | 24.1 |
| 3682 | 24.6 |
| 3683 | 24.6 |
| 3684 | 24.1 |
| 3685 | 23.6 |
| 3686 | 23.6 |
| 3687 | 23.6 |
| 3688 | 23.6 |
| 3689 | 23.6 |
| 3690 | 24.6 |
| 3691 | 24.6 |
| 3692 | 24.6 |
| 3693 | 25.1 |
| 3694 | 24.6 |
| 3695 | 24.1 |
| 3696 | 23.099 |
| 3697 | 22.599 |
| 3698 | 22.599 |
| 3699 | 23.099 |
| 3700 | 23.099 |
| 3701 | 24.1 |
| 3702 | 24.6 |
| 3703 | 24.6 |
| 3704 | 25.1 |
| 3705 | 25.1 |
| 3706 | 25.1 |
| 3707 | 25.1 |
| 3708 | 25.1 |
| 3709 | 24.1 |
| 3710 | 23.6 |
| 3711 | 22.599 |
| 3712 | 23.099 |
| 3713 | 22.599 |
| 3714 | 23.099 |
| 3715 | 23.6 |
| 3716 | 23.6 |
| 3717 | 24.1 |
| 3718 | 24.1 |
| 3719 | 24.6 |
| 3720 | 24.6 |
| 3721 | 24.1 |
| 3722 | 24.1 |
| 3723 | 23.6 |
| 3724 | 23.6 |
| 3725 | 24.1 |
| 3726 | 24.6 |
| 3727 | 24.6 |
| 3728 | 24.6 |
| 3729 | 24.6 |
| 3730 | 24.6 |
| 3731 | 25.1 |
| 3732 | 25.1 |
| 3733 | 24.6 |
| 3734 | 23.6 |
| 3735 | 23.6 |
| 3736 | 23.6 |
| 3737 | 23.099 |
| 3738 | 23.099 |
| 3739 | 23.099 |
| 3740 | 23.6 |
| 3741 | 23.6 |
| 3742 | 24.1 |
| 3743 | 24.1 |
| 3744 | 24.6 |
| 3745 | 24.6 |
| 3746 | 24.6 |
| 3747 | 24.6 |
| 3748 | 24.6 |
| 3749 | 24.1 |
| 3750 | 24.1 |
| 3751 | 24.6 |
| 3752 | 24.6 |
| 3753 | 25.1 |
| 3754 | 25.1 |
| 3755 | 25.6 |
| 3756 | 25.6 |
| 3757 | 25.1 |
| 3758 | 25.1 |
| 3759 | 24.1 |
| 3760 | 24.6 |
| 3761 | 24.1 |
| 3762 | 24.1 |
| 3763 | 24.1 |
| 3764 | 24.1 |
| 3765 | 24.1 |
| 3766 | 24.6 |
| 3767 | 24.6 |
| 3768 | 25.1 |
| 3769 | 25.1 |
| 3770 | 24.6 |
| 3771 | 24.6 |
| 3772 | 24.6 |
| 3773 | 24.6 |
| 3774 | 24.6 |
| 3775 | 24.6 |
| 3776 | 24.6 |
| 3777 | 24.6 |
| 3778 | 25.1 |
| 3779 | 25.1 |
| 3780 | 25.1 |
| 3781 | 25.1 |
| 3782 | 25.6 |
| 3783 | 25.1 |
| 3784 | 25.1 |
| 3785 | 25.1 |
| 3786 | 24.6 |
| 3787 | 24.1 |
| 3788 | 24.6 |
| 3789 | 24.1 |
| 3790 | 24.6 |
| 3791 | 24.6 |
| 3792 | 25.1 |
| 3793 | 25.1 |
| 3794 | 25.6 |
| 3795 | 25.1 |
| 3796 | 25.1 |
| 3797 | 25.1 |
| 3798 | 24.6 |
| 3799 | 24.6 |
| 3800 | 24.6 |
| 3801 | 24.6 |
| 3802 | 24.6 |
| 3803 | 24.6 |
| 3804 | 24.6 |
| 3805 | 24.6 |
| 3806 | 24.6 |
| 3807 | 24.6 |
| 3808 | 24.1 |
| 3809 | 24.6 |
| 3810 | 24.6 |
| 3811 | 24.6 |
| 3812 | 24.6 |
| 3813 | 24.6 |
| 3814 | 24.6 |
| 3815 | 24.6 |
| 3816 | 24.6 |
| 3817 | 24.1 |
| 3818 | 24.1 |
| 3819 | 24.1 |
| 3820 | 24.1 |
| 3821 | 24.1 |
| 3822 | 24.1 |
| 3823 | 24.6 |
| 3824 | 24.6 |
| 3825 | 24.6 |
| 3826 | 24.6 |
| 3827 | 24.6 |
| 3828 | 24.6 |
| 3829 | 25.1 |
| 3830 | 25.1 |
| 3831 | 25.6 |
| 3832 | 24.6 |
| 3833 | 24.6 |
| 3834 | 24.1 |
| 3835 | 23.6 |
| 3836 | 23.6 |
| 3837 | 23.6 |
| 3838 | 23.6 |
| 3839 | 23.6 |
| 3840 | 24.1 |
| 3841 | 24.6 |
| 3842 | 24.6 |
| 3843 | 24.6 |
| 3844 | 24.6 |
| 3845 | 24.6 |
| 3846 | 24.6 |
| 3847 | 24.6 |
| 3848 | 24.6 |
| 3849 | 24.6 |
| 3850 | 24.1 |
| 3851 | 24.6 |
| 3852 | 25.1 |
| 3853 | 25.1 |
| 3854 | 25.6 |
| 3855 | 25.6 |
| 3856 | 26.099 |
| 3857 | 25.1 |
| 3858 | 24.6 |
| 3859 | 24.1 |
| 3860 | 24.1 |
| 3861 | 23.6 |
| 3862 | 23.6 |
| 3863 | 23.6 |
| 3864 | 24.1 |
| 3865 | 24.1 |
| 3866 | 25.1 |
| 3867 | 25.6 |
| 3868 | 25.6 |
| 3869 | 25.1 |
| 3870 | 25.1 |
| 3871 | 25.1 |
| 3872 | 24.6 |
| 3873 | 24.1 |
| 3874 | 23.6 |
| 3875 | 23.6 |
| 3876 | 24.1 |
| 3877 | 24.6 |
| 3878 | 25.1 |
| 3879 | 25.6 |
| 3880 | 26.099 |
| 3881 | 26.599 |
| 3882 | 25.6 |
| 3883 | 23.6 |
| 3884 | 23.6 |
| 3885 | 23.099 |
| 3886 | 23.099 |
| 3887 | 23.099 |
| 3888 | 23.099 |
| 3889 | 23.6 |
| 3890 | 24.6 |
| 3891 | 25.1 |
| 3892 | 25.1 |
| 3893 | 25.1 |
| 3894 | 25.1 |
| 3895 | 25.1 |
| 3896 | 25.1 |
| 3897 | 23.6 |
| 3898 | 23.099 |
| 3899 | 23.6 |
| 3900 | 23.6 |
| 3901 | 24.1 |
| 3902 | 24.6 |
| 3903 | 25.1 |
| 3904 | 25.6 |
| 3905 | 26.099 |
| 3906 | 25.6 |
| 3907 | 25.1 |
| 3908 | 23.6 |
| 3909 | 23.099 |
| 3910 | 23.099 |
| 3911 | 23.099 |
| 3912 | 23.099 |
| 3913 | 23.6 |
| 3914 | 24.6 |
| 3915 | 25.1 |
| 3916 | 24.6 |
| 3917 | 24.6 |
| 3918 | 25.1 |
| 3919 | 24.6 |
| 3920 | 25.1 |
| 3921 | 25.1 |
| 3922 | 23.6 |
| 3923 | 23.099 |
| 3924 | 23.099 |
| 3925 | 23.099 |
| 3926 | 23.6 |
| 3927 | 24.1 |
| 3928 | 24.6 |
| 3929 | 25.1 |
| 3930 | 25.6 |
| 3931 | 24.6 |
| 3932 | 24.1 |
| 3933 | 23.6 |
| 3934 | 23.6 |
| 3935 | 23.6 |
| 3936 | 23.6 |
| 3937 | 23.6 |
| 3938 | 24.1 |
| 3939 | 24.6 |
| 3940 | 24.1 |
| 3941 | 24.1 |
| 3942 | 24.1 |
| 3943 | 24.1 |
| 3944 | 24.6 |
| 3945 | 24.6 |
| 3946 | 24.6 |
| 3947 | 24.6 |
| 3948 | 24.6 |
| 3949 | 24.6 |
| 3950 | 24.6 |
| 3951 | 24.6 |
| 3952 | 25.1 |
| 3953 | 25.1 |
| 3954 | 25.1 |
| 3955 | 25.6 |
| 3956 | 25.1 |
| 3957 | 25.1 |
| 3958 | 24.6 |
| 3959 | 24.6 |
| 3960 | 24.6 |
| 3961 | 24.6 |
| 3962 | 24.6 |
| 3963 | 24.6 |
| 3964 | 24.6 |
| 3965 | 24.6 |
| 3966 | 24.1 |
| 3967 | 24.1 |
| 3968 | 24.1 |
| 3969 | 24.6 |
| 3970 | 24.6 |
| 3971 | 24.6 |
| 3972 | 24.6 |
| 3973 | 24.6 |
| 3974 | 24.6 |
| 3975 | 24.6 |
| 3976 | 25.1 |
| 3977 | 25.1 |
| 3978 | 25.1 |
| 3979 | 25.6 |
| 3980 | 25.6 |
| 3981 | 25.6 |
| 3982 | 25.6 |
| 3983 | 25.1 |
| 3984 | 24.6 |
| 3985 | 24.6 |
| 3986 | 24.6 |
| 3987 | 24.6 |
| 3988 | 25.1 |
| 3989 | 25.1 |
| 3990 | 24.6 |
| 3991 | 24.6 |
| 3992 | 25.1 |
| 3993 | 25.1 |
| 3994 | 25.1 |
| 3995 | 25.1 |
| 3996 | 25.1 |
| 3997 | 25.1 |
| 3998 | 25.1 |
| 3999 | 25.1 |
| 4000 | 25.6 |
| 4001 | 25.6 |
| 4002 | 25.6 |
| 4003 | 26.099 |
| 4004 | 26.099 |
| 4005 | 26.099 |
| 4006 | 26.099 |
| 4007 | 26.099 |
| 4008 | 25.6 |
| 4009 | 25.6 |
| 4010 | 25.6 |
| 4011 | 25.6 |
| 4012 | 25.6 |
| 4013 | 25.6 |
| 4014 | 25.6 |
| 4015 | 25.6 |
| 4016 | 25.6 |
| 4017 | 25.6 |
| 4018 | 26.099 |
| 4019 | 26.099 |
| 4020 | 25.6 |
| 4021 | 25.6 |
| 4022 | 25.6 |
| 4023 | 25.6 |
| 4024 | 25.6 |
| 4025 | 26.099 |
| 4026 | 25.6 |
| 4027 | 26.099 |
| 4028 | 26.599 |
| 4029 | 26.599 |
| 4030 | 26.599 |
| 4031 | 26.599 |
| 4032 | 26.099 |
| 4033 | 26.099 |
| 4034 | 25.6 |
| 4035 | 25.6 |
| 4036 | 25.6 |
| 4037 | 26.099 |
| 4038 | 26.099 |
| 4039 | 26.099 |
| 4040 | 26.099 |
| 4041 | 26.099 |
| 4042 | 26.099 |
| 4043 | 26.099 |
| 4044 | 26.099 |
| 4045 | 26.099 |
| 4046 | 25.6 |
| 4047 | 25.6 |
| 4048 | 25.6 |
| 4049 | 25.6 |
| 4050 | 25.6 |
| 4051 | 25.6 |
| 4052 | 26.099 |
| 4053 | 26.099 |
| 4054 | 26.599 |
| 4055 | 26.099 |
| 4056 | 26.599 |
| 4057 | 26.099 |
| 4058 | 26.099 |
| 4059 | 26.099 |
| 4060 | 26.099 |
| 4061 | 26.099 |
| 4062 | 26.099 |
| 4063 | 26.099 |
| 4064 | 26.099 |
| 4065 | 26.099 |
| 4066 | 26.099 |
| 4067 | 26.599 |
| 4068 | 26.599 |
| 4069 | 26.599 |
| 4070 | 26.099 |
| 4071 | 25.6 |
| 4072 | 25.6 |
| 4073 | 25.6 |
| 4074 | 25.6 |
| 4075 | 26.099 |
| 4076 | 26.099 |
| 4077 | 26.099 |
| 4078 | 26.599 |
| 4079 | 26.599 |
| 4080 | 26.599 |
| 4081 | 27.099 |
| 4082 | 26.599 |
| 4083 | 26.599 |
| 4084 | 26.599 |
| 4085 | 26.099 |
| 4086 | 26.599 |
| 4087 | 26.599 |
| 4088 | 26.599 |
| 4089 | 26.599 |
| 4090 | 26.599 |
| 4091 | 27.099 |
| 4092 | 27.099 |
| 4093 | 27.099 |
| 4094 | 27.099 |
| 4095 | 26.599 |
| 4096 | 26.599 |
| 4097 | 26.099 |
| 4098 | 26.099 |
| 4099 | 26.099 |
| 4100 | 26.099 |
| 4101 | 26.099 |
| 4102 | 26.599 |
| 4103 | 26.599 |
| 4104 | 27.099 |
| 4105 | 27.099 |
| 4106 | 27.099 |
| 4107 | 27.099 |
| 4108 | 27.099 |
| 4109 | 26.599 |
| 4110 | 26.599 |
| 4111 | 26.599 |
| 4112 | 26.599 |
| 4113 | 26.599 |
| 4114 | 27.099 |
| 4115 | 27.099 |
| 4116 | 27.599 |
| 4117 | 27.599 |
| 4118 | 27.599 |
| 4119 | 26.599 |
| 4120 | 26.099 |
| 4121 | 25.6 |
| 4122 | 26.099 |
| 4123 | 26.099 |
| 4124 | 25.6 |
| 4125 | 25.6 |
| 4126 | 25.6 |
| 4127 | 25.6 |
| 4128 | 26.099 |
| 4129 | 26.599 |
| 4130 | 26.599 |
| 4131 | 26.599 |
| 4132 | 26.599 |
| 4133 | 26.599 |
| 4134 | 26.599 |
| 4135 | 26.099 |
| 4136 | 26.099 |
| 4137 | 26.099 |
| 4138 | 26.099 |
| 4139 | 26.099 |
| 4140 | 26.099 |
| 4141 | 25.6 |
| 4142 | 25.6 |
| 4143 | 25.6 |
| 4144 | 25.6 |
| 4145 | 25.1 |
| 4146 | 25.1 |
| 4147 | 25.1 |
| 4148 | 25.1 |
| 4149 | 25.1 |
| 4150 | 25.1 |
| 4151 | 25.1 |
| 4152 | 25.1 |
| 4153 | 25.1 |
| 4154 | 25.1 |
| 4155 | 25.1 |
| 4156 | 24.6 |
| 4157 | 24.6 |
| 4158 | 24.1 |
| 4159 | 24.1 |
| 4160 | 24.1 |
| 4161 | 24.6 |
| 4162 | 24.6 |
| 4163 | 24.6 |
| 4164 | 24.6 |
| 4165 | 24.6 |
| 4166 | 24.6 |
| 4167 | 25.1 |
| 4168 | 25.1 |
| 4169 | 25.1 |
| 4170 | 24.6 |
| 4171 | 24.6 |
| 4172 | 24.6 |
| 4173 | 24.6 |
| 4174 | 24.6 |
| 4175 | 24.6 |
| 4176 | 24.6 |
| 4177 | 24.6 |
| 4178 | 24.6 |
| 4179 | 24.6 |
| 4180 | 24.6 |
| 4181 | 24.1 |
| 4182 | 24.1 |
| 4183 | 24.1 |
| 4184 | 24.1 |
| 4185 | 24.6 |
| 4186 | 24.6 |
| 4187 | 24.6 |
| 4188 | 25.1 |
| 4189 | 25.1 |
| 4190 | 25.1 |
| 4191 | 25.1 |
| 4192 | 25.1 |
| 4193 | 25.1 |
| 4194 | 25.1 |
| 4195 | 25.1 |
| 4196 | 25.1 |
| 4197 | 24.6 |
| 4198 | 24.6 |
| 4199 | 24.6 |
| 4200 | 24.6 |
| 4201 | 24.6 |
| 4202 | 24.6 |
| 4203 | 24.6 |
| 4204 | 24.6 |
| 4205 | 24.1 |
| 4206 | 24.1 |
| 4207 | 24.1 |
| 4208 | 24.1 |
| 4209 | 24.1 |
| 4210 | 24.1 |
| 4211 | 24.6 |
| 4212 | 24.1 |
| 4213 | 24.6 |
| 4214 | 24.6 |
| 4215 | 24.1 |
| 4216 | 24.6 |
| 4217 | 24.6 |
| 4218 | 24.6 |
| 4219 | 24.6 |
| 4220 | 24.6 |
| 4221 | 24.1 |
| 4222 | 24.1 |
| 4223 | 24.1 |
| 4224 | 24.1 |
| 4225 | 24.1 |
| 4226 | 24.1 |
| 4227 | 24.1 |
| 4228 | 23.6 |
| 4229 | 23.6 |
| 4230 | 23.6 |
| 4231 | 23.6 |
| 4232 | 23.6 |
| 4233 | 23.6 |
| 4234 | 23.6 |
| 4235 | 24.1 |
| 4236 | 24.1 |
| 4237 | 24.1 |
| 4238 | 24.1 |
| 4239 | 24.1 |
| 4240 | 24.6 |
| 4241 | 24.6 |
| 4242 | 25.1 |
| 4243 | 25.1 |
| 4244 | 25.1 |
| 4245 | 24.6 |
| 4246 | 24.6 |
| 4247 | 24.6 |
| 4248 | 24.6 |
| 4249 | 24.1 |
| 4250 | 24.6 |
| 4251 | 24.6 |
| 4252 | 24.1 |
| 4253 | 24.1 |
| 4254 | 24.1 |
| 4255 | 24.1 |
| 4256 | 24.1 |
| 4257 | 24.1 |
| 4258 | 24.6 |
| 4259 | 24.6 |
| 4260 | 24.6 |
| 4261 | 25.1 |
| 4262 | 25.1 |
| 4263 | 25.1 |
| 4264 | 25.1 |
| 4265 | 25.6 |
| 4266 | 25.1 |
| 4267 | 25.6 |
| 4268 | 25.1 |
| 4269 | 25.1 |
| 4270 | 24.6 |
| 4271 | 24.6 |
| 4272 | 24.1 |
| 4273 | 24.6 |
| 4274 | 24.6 |
| 4275 | 24.6 |
| 4276 | 24.6 |
| 4277 | 24.6 |
| 4278 | 24.6 |
| 4279 | 24.1 |
| 4280 | 24.6 |
| 4281 | 24.1 |
| 4282 | 24.1 |
| 4283 | 24.1 |
| 4284 | 24.6 |
| 4285 | 24.6 |
| 4286 | 24.6 |
| 4287 | 24.6 |
| 4288 | 24.6 |
| 4289 | 24.6 |
| 4290 | 25.1 |
| 4291 | 25.1 |
| 4292 | 24.6 |
| 4293 | 24.6 |
| 4294 | 24.1 |
| 4295 | 24.1 |
| 4296 | 24.1 |
| 4297 | 24.1 |
| 4298 | 24.1 |
| 4299 | 24.6 |
| 4300 | 24.1 |
| 4301 | 24.1 |
| 4302 | 24.1 |
| 4303 | 24.1 |
| 4304 | 24.1 |
| 4305 | 24.1 |
| 4306 | 24.1 |
| 4307 | 24.1 |
| 4308 | 24.1 |
| 4309 | 24.6 |
| 4310 | 24.6 |
| 4311 | 24.6 |
| 4312 | 24.6 |
| 4313 | 25.1 |
| 4314 | 25.1 |
| 4315 | 25.1 |
| 4316 | 25.1 |
| 4317 | 25.1 |
| 4318 | 24.6 |
| 4319 | 24.6 |
| 4320 | 24.6 |
| 4321 | 24.6 |
| 4322 | 24.6 |
| 4323 | 24.6 |
| 4324 | 25.1 |
| 4325 | 25.1 |
| 4326 | 25.1 |
| 4327 | 25.1 |
| 4328 | 25.1 |
| 4329 | 25.1 |
| 4330 | 25.1 |
| 4331 | 25.1 |
| 4332 | 24.6 |
| 4333 | 24.6 |
| 4334 | 24.6 |
| 4335 | 25.1 |
| 4336 | 25.1 |
| 4337 | 25.6 |
| 4338 | 25.6 |
| 4339 | 26.099 |
| 4340 | 26.099 |
| 4341 | 26.099 |
| 4342 | 25.6 |
| 4343 | 25.1 |
| 4344 | 24.6 |
| 4345 | 24.1 |
| 4346 | 24.6 |
| 4347 | 24.6 |
| 4348 | 25.1 |
| 4349 | 25.6 |
| 4350 | 25.6 |
| 4351 | 25.6 |
| 4352 | 25.6 |
| 4353 | 25.6 |
| 4354 | 25.6 |
| 4355 | 25.6 |
| 4356 | 25.6 |
| 4357 | 25.6 |
| 4358 | 25.6 |
| 4359 | 25.6 |
| 4360 | 25.6 |
| 4361 | 25.6 |
| 4362 | 26.099 |
| 4363 | 26.099 |
| 4364 | 26.599 |
| 4365 | 26.599 |
| 4366 | 26.099 |
| 4367 | 26.099 |
| 4368 | 25.6 |
| 4369 | 25.6 |
| 4370 | 25.6 |
| 4371 | 26.099 |
| 4372 | 26.099 |
| 4373 | 25.6 |
| 4374 | 25.6 |
| 4375 | 25.6 |
| 4376 | 25.6 |
| 4377 | 25.6 |
| 4378 | 25.6 |
| 4379 | 25.6 |
| 4380 | 25.6 |
| 4381 | 25.6 |
| 4382 | 25.6 |
| 4383 | 25.6 |
| 4384 | 25.6 |
| 4385 | 25.6 |
| 4386 | 26.099 |
| 4387 | 26.099 |
| 4388 | 26.099 |
| 4389 | 26.099 |
| 4390 | 26.099 |
| 4391 | 26.099 |
| 4392 | 26.099 |
| 4393 | 25.6 |
| 4394 | 25.6 |
| 4395 | 25.6 |
| 4396 | 25.6 |
| 4397 | 26.099 |
| 4398 | 26.099 |
| 4399 | 26.099 |
| 4400 | 26.099 |
| 4401 | 26.099 |
| 4402 | 26.099 |
| 4403 | 26.099 |
| 4404 | 26.099 |
| 4405 | 26.099 |
| 4406 | 26.099 |
| 4407 | 26.099 |
| 4408 | 25.6 |
| 4409 | 26.099 |
| 4410 | 26.099 |
| 4411 | 26.099 |
| 4412 | 26.599 |
| 4413 | 26.599 |
| 4414 | 26.599 |
| 4415 | 26.599 |
| 4416 | 26.599 |
| 4417 | 26.599 |
| 4418 | 26.599 |
| 4419 | 26.599 |
| 4420 | 26.599 |
| 4421 | 26.599 |
| 4422 | 26.599 |
| 4423 | 26.599 |
| 4424 | 26.599 |
| 4425 | 26.599 |
| 4426 | 26.599 |
| 4427 | 26.599 |
| 4428 | 26.599 |
| 4429 | 26.099 |
| 4430 | 25.6 |
| 4431 | 25.6 |
| 4432 | 26.099 |
| 4433 | 26.099 |
| 4434 | 26.099 |
| 4435 | 26.599 |
| 4436 | 26.599 |
| 4437 | 26.599 |
| 4438 | 27.099 |
| 4439 | 27.099 |
| 4440 | 27.099 |
| 4441 | 27.099 |
| 4442 | 26.599 |
| 4443 | 26.599 |
| 4444 | 26.599 |
| 4445 | 27.099 |
| 4446 | 26.599 |
| 4447 | 27.099 |
| 4448 | 27.099 |
| 4449 | 27.099 |
| 4450 | 27.099 |
| 4451 | 27.099 |
| 4452 | 27.599 |
| 4453 | 27.099 |
| 4454 | 26.599 |
| 4455 | 26.599 |
| 4456 | 26.599 |
| 4457 | 26.099 |
| 4458 | 26.599 |
| 4459 | 26.599 |
| 4460 | 26.599 |
| 4461 | 26.599 |
| 4462 | 26.599 |
| 4463 | 27.099 |
| 4464 | 27.099 |
| 4465 | 27.099 |
| 4466 | 27.099 |
| 4467 | 27.099 |
| 4468 | 27.099 |
| 4469 | 26.599 |
| 4470 | 26.599 |
| 4471 | 26.599 |
| 4472 | 27.099 |
| 4473 | 27.099 |
| 4474 | 27.599 |
| 4475 | 27.599 |
| 4476 | 27.599 |
| 4477 | 27.599 |
| 4478 | 27.599 |
| 4479 | 27.099 |
| 4480 | 26.599 |
| 4481 | 26.599 |
| 4482 | 26.599 |
| 4483 | 26.599 |
| 4484 | 26.599 |
| 4485 | 26.599 |
| 4486 | 27.099 |
| 4487 | 27.599 |
| 4488 | 27.599 |
| 4489 | 27.599 |
| 4490 | 27.599 |
| 4491 | 27.599 |
| 4492 | 27.599 |
| 4493 | 27.099 |
| 4494 | 27.099 |
| 4495 | 27.099 |
| 4496 | 27.099 |
| 4497 | 27.099 |
| 4498 | 27.099 |
| 4499 | 27.599 |
| 4500 | 27.599 |
| 4501 | 28.099 |
| 4502 | 28.099 |
| 4503 | 27.599 |
| 4504 | 27.099 |
| 4505 | 26.599 |
| 4506 | 26.099 |
| 4507 | 26.099 |
| 4508 | 26.599 |
| 4509 | 26.099 |
| 4510 | 26.599 |
| 4511 | 27.099 |
| 4512 | 27.099 |
| 4513 | 27.599 |
| 4514 | 27.599 |
| 4515 | 27.599 |
| 4516 | 27.599 |
| 4517 | 27.099 |
| 4518 | 27.099 |
| 4519 | 27.099 |
| 4520 | 27.099 |
| 4521 | 27.099 |
| 4522 | 27.099 |
| 4523 | 27.099 |
| 4524 | 27.599 |
| 4525 | 27.599 |
| 4526 | 28.099 |
| 4527 | 28.099 |
| 4528 | 27.599 |
| 4529 | 26.599 |
| 4530 | 25.6 |
| 4531 | 25.6 |
| 4532 | 25.6 |
| 4533 | 25.6 |
| 4534 | 25.1 |
| 4535 | 25.1 |
| 4536 | 26.099 |
| 4537 | 27.099 |
| 4538 | 27.099 |
| 4539 | 27.099 |
| 4540 | 27.099 |
| 4541 | 26.599 |
| 4542 | 26.599 |
| 4543 | 26.599 |
| 4544 | 25.6 |
| 4545 | 25.6 |
| 4546 | 25.6 |
| 4547 | 26.099 |
| 4548 | 26.099 |
| 4549 | 26.599 |
| 4550 | 27.099 |
| 4551 | 27.099 |
| 4552 | 27.099 |
| 4553 | 26.599 |
| 4554 | 25.6 |
| 4555 | 25.6 |
| 4556 | 25.1 |
| 4557 | 25.1 |
| 4558 | 25.1 |
| 4559 | 25.1 |
| 4560 | 26.099 |
| 4561 | 26.599 |
| 4562 | 27.099 |
| 4563 | 27.099 |
| 4564 | 26.599 |
| 4565 | 26.599 |
| 4566 | 26.599 |
| 4567 | 26.599 |
| 4568 | 25.6 |
| 4569 | 25.1 |
| 4570 | 25.1 |
| 4571 | 25.1 |
| 4572 | 25.6 |
| 4573 | 26.099 |
| 4574 | 26.599 |
| 4575 | 26.599 |
| 4576 | 26.599 |
| 4577 | 27.099 |
| 4578 | 26.599 |
| 4579 | 26.099 |
| 4580 | 25.6 |
| 4581 | 25.6 |
| 4582 | 25.6 |
| 4583 | 25.1 |
| 4584 | 25.1 |
| 4585 | 26.099 |
| 4586 | 26.099 |
| 4587 | 25.6 |
| 4588 | 25.6 |
| 4589 | 25.6 |
| 4590 | 25.6 |
| 4591 | 25.6 |
| 4592 | 25.6 |
| 4593 | 25.6 |
| 4594 | 25.6 |
| 4595 | 25.6 |
| 4596 | 25.6 |
| 4597 | 25.6 |
| 4598 | 25.6 |
| 4599 | 25.6 |
| 4600 | 25.6 |
| 4601 | 25.6 |
| 4602 | 25.6 |
| 4603 | 25.6 |
| 4604 | 25.6 |
| 4605 | 25.1 |
| 4606 | 25.1 |
| 4607 | 25.1 |
| 4608 | 25.1 |
| 4609 | 25.1 |
| 4610 | 25.6 |
| 4611 | 25.1 |
| 4612 | 25.6 |
| 4613 | 25.1 |
| 4614 | 25.1 |
| 4615 | 25.1 |
| 4616 | 25.1 |
| 4617 | 25.1 |
| 4618 | 25.1 |
| 4619 | 25.6 |
| 4620 | 25.6 |
| 4621 | 25.6 |
| 4622 | 25.6 |
| 4623 | 26.099 |
| 4624 | 26.099 |
| 4625 | 26.099 |
| 4626 | 26.599 |
| 4627 | 26.599 |
| 4628 | 26.099 |
| 4629 | 26.099 |
| 4630 | 25.6 |
| 4631 | 25.6 |
| 4632 | 25.6 |
| 4633 | 25.6 |
| 4634 | 26.099 |
| 4635 | 26.099 |
| 4636 | 25.6 |
| 4637 | 25.6 |
| 4638 | 25.6 |
| 4639 | 25.6 |
| 4640 | 25.6 |
| 4641 | 26.099 |
| 4642 | 26.099 |
| 4643 | 26.099 |
| 4644 | 25.6 |
| 4645 | 26.099 |
| 4646 | 26.099 |
| 4647 | 26.099 |
| 4648 | 26.599 |
| 4649 | 27.099 |
| 4650 | 27.599 |
| 4651 | 27.099 |
| 4652 | 27.099 |
| 4653 | 27.099 |
| 4654 | 26.099 |
| 4655 | 25.6 |
| 4656 | 25.6 |
| 4657 | 25.6 |
| 4658 | 26.099 |
| 4659 | 26.599 |
| 4660 | 26.599 |
| 4661 | 26.599 |
| 4662 | 26.599 |
| 4663 | 26.599 |
| 4664 | 26.599 |
| 4665 | 26.599 |
| 4666 | 26.599 |
| 4667 | 26.599 |
| 4668 | 26.099 |
| 4669 | 26.099 |
| 4670 | 26.099 |
| 4671 | 26.599 |
| 4672 | 26.599 |
| 4673 | 27.099 |
| 4674 | 27.599 |
| 4675 | 27.599 |
| 4676 | 27.599 |
| 4677 | 27.599 |
| 4678 | 27.099 |
| 4679 | 26.599 |
| 4680 | 26.099 |
| 4681 | 26.099 |
| 4682 | 26.099 |
| 4683 | 26.599 |
| 4684 | 27.099 |
| 4685 | 26.599 |
| 4686 | 26.599 |
| 4687 | 26.599 |
| 4688 | 26.599 |
| 4689 | 27.099 |
| 4690 | 27.099 |
| 4691 | 27.099 |
| 4692 | 26.599 |
| 4693 | 26.099 |
| 4694 | 26.099 |
| 4695 | 26.099 |
| 4696 | 26.099 |
| 4697 | 26.599 |
| 4698 | 27.099 |
| 4699 | 27.599 |
| 4700 | 28.099 |
| 4701 | 27.599 |
| 4702 | 27.599 |
| 4703 | 27.099 |
| 4704 | 26.599 |
| 4705 | 26.099 |
| 4706 | 26.099 |
| 4707 | 26.599 |
| 4708 | 27.099 |
| 4709 | 27.099 |
| 4710 | 26.599 |
| 4711 | 26.599 |
| 4712 | 26.599 |
| 4713 | 26.599 |
| 4714 | 26.599 |
| 4715 | 26.599 |
| 4716 | 26.599 |
| 4717 | 26.599 |
| 4718 | 26.599 |
| 4719 | 26.099 |
| 4720 | 26.599 |
| 4721 | 26.099 |
| 4722 | 26.599 |
| 4723 | 26.599 |
| 4724 | 27.099 |
| 4725 | 27.099 |
| 4726 | 26.599 |
| 4727 | 26.599 |
| 4728 | 26.599 |
| 4729 | 26.099 |
| 4730 | 26.099 |
| 4731 | 26.099 |
| 4732 | 26.099 |
| 4733 | 26.099 |
| 4734 | 26.099 |
| 4735 | 26.099 |
| 4736 | 26.099 |
| 4737 | 26.099 |
| 4738 | 26.099 |
| 4739 | 26.099 |
| 4740 | 26.099 |
| 4741 | 25.6 |
| 4742 | 25.6 |
| 4743 | 25.6 |
| 4744 | 25.6 |
| 4745 | 25.6 |
| 4746 | 26.099 |
| 4747 | 26.099 |
| 4748 | 26.599 |
| 4749 | 27.099 |
| 4750 | 27.099 |
| 4751 | 27.099 |
| 4752 | 27.099 |
| 4753 | 26.599 |
| 4754 | 26.599 |
| 4755 | 26.599 |
| 4756 | 26.599 |
| 4757 | 26.599 |
| 4758 | 26.599 |
| 4759 | 26.599 |
| 4760 | 26.599 |
| 4761 | 26.599 |
| 4762 | 27.099 |
| 4763 | 27.099 |
| 4764 | 27.099 |
| 4765 | 26.099 |
| 4766 | 26.099 |
| 4767 | 26.099 |
| 4768 | 26.099 |
| 4769 | 27.099 |
| 4770 | 27.599 |
| 4771 | 27.599 |
| 4772 | 27.099 |
| 4773 | 27.099 |
| 4774 | 26.599 |
| 4775 | 26.099 |
| 4776 | 26.099 |
| 4777 | 26.599 |
| 4778 | 26.599 |
| 4779 | 27.099 |
| 4780 | 27.599 |
| 4781 | 28.099 |
| 4782 | 28.099 |
| 4783 | 28.099 |
| 4784 | 28.099 |
| 4785 | 28.099 |
| 4786 | 27.599 |
| 4787 | 27.599 |
| 4788 | 27.599 |
| 4789 | 27.599 |
| 4790 | 27.599 |
| 4791 | 27.599 |
| 4792 | 27.599 |
| 4793 | 27.599 |
| 4794 | 28.099 |
| 4795 | 28.099 |
| 4796 | 28.598 |
| 4797 | 28.099 |
| 4798 | 28.099 |
| 4799 | 28.099 |
| 4800 | 27.099 |
| 4801 | 26.599 |
| 4802 | 27.599 |
| 4803 | 28.099 |
| 4804 | 27.599 |
| 4805 | 28.099 |
| 4806 | 28.598 |
| 4807 | 28.598 |
| 4808 | 28.598 |
| 4809 | 28.099 |
| 4810 | 28.099 |
| 4811 | 28.099 |
| 4812 | 27.599 |
| 4813 | 27.599 |
| 4814 | 27.599 |
| 4815 | 27.599 |
| 4816 | 27.599 |
| 4817 | 27.599 |
| 4818 | 27.599 |
| 4819 | 27.099 |
| 4820 | 27.099 |
| 4821 | 27.099 |
| 4822 | 27.599 |
| 4823 | 27.599 |
| 4824 | 27.599 |
| 4825 | 27.599 |
| 4826 | 27.599 |
| 4827 | 27.599 |
| 4828 | 27.099 |
| 4829 | 27.099 |
| 4830 | 27.099 |
| 4831 | 27.099 |
| 4832 | 27.099 |
| 4833 | 27.099 |
| 4834 | 27.099 |
| 4835 | 27.099 |
| 4836 | 27.099 |
| 4837 | 26.599 |
| 4838 | 26.599 |
| 4839 | 27.099 |
| 4840 | 26.599 |
| 4841 | 27.099 |
| 4842 | 27.099 |
| 4843 | 27.099 |
| 4844 | 27.099 |
| 4845 | 27.099 |
| 4846 | 27.599 |
| 4847 | 27.599 |
| 4848 | 27.099 |
| 4849 | 27.599 |
| 4850 | 27.099 |
| 4851 | 27.099 |
| 4852 | 27.099 |
| 4853 | 27.099 |
| 4854 | 27.099 |
| 4855 | 27.099 |
| 4856 | 27.599 |
| 4857 | 27.599 |
| 4858 | 27.099 |
| 4859 | 27.099 |
| 4860 | 27.099 |
| 4861 | 26.599 |
| 4862 | 26.599 |
| 4863 | 26.599 |
| 4864 | 26.599 |
| 4865 | 27.099 |
| 4866 | 27.099 |
| 4867 | 27.099 |
| 4868 | 27.599 |
| 4869 | 27.599 |
| 4870 | 27.599 |
| 4871 | 27.599 |
| 4872 | 27.599 |
| 4873 | 27.599 |
| 4874 | 27.099 |
| 4875 | 27.099 |
| 4876 | 27.099 |
| 4877 | 26.599 |
| 4878 | 26.599 |
| 4879 | 26.599 |
| 4880 | 27.099 |
| 4881 | 27.099 |
| 4882 | 27.099 |
| 4883 | 27.099 |
| 4884 | 27.099 |
| 4885 | 27.599 |
| 4886 | 27.099 |
| 4887 | 27.599 |
| 4888 | 27.099 |
| 4889 | 26.599 |
| 4890 | 26.599 |
| 4891 | 26.599 |
| 4892 | 27.099 |
| 4893 | 27.099 |
| 4894 | 27.599 |
| 4895 | 27.599 |
| 4896 | 28.099 |
| 4897 | 28.099 |
| 4898 | 27.599 |
| 4899 | 27.099 |
| 4900 | 26.599 |
| 4901 | 26.599 |
| 4902 | 26.599 |
| 4903 | 27.099 |
| 4904 | 27.099 |
| 4905 | 27.599 |
| 4906 | 27.599 |
| 4907 | 28.099 |
| 4908 | 28.099 |
| 4909 | 27.599 |
| 4910 | 27.599 |
| 4911 | 27.599 |
| 4912 | 27.099 |
| 4913 | 26.099 |
| 4914 | 25.6 |
| 4915 | 25.6 |
| 4916 | 26.099 |
| 4917 | 26.099 |
| 4918 | 27.099 |
| 4919 | 27.599 |
| 4920 | 28.099 |
| 4921 | 28.099 |
| 4922 | 28.099 |
| 4923 | 27.599 |
| 4924 | 26.599 |
| 4925 | 26.599 |
| 4926 | 26.099 |
| 4927 | 26.099 |
| 4928 | 26.599 |
| 4929 | 26.599 |
| 4930 | 27.599 |
| 4931 | 27.599 |
| 4932 | 28.099 |
| 4933 | 27.599 |
| 4934 | 27.599 |
| 4935 | 27.599 |
| 4936 | 27.599 |
| 4937 | 26.599 |
| 4938 | 26.099 |
| 4939 | 25.6 |
| 4940 | 26.099 |
| 4941 | 26.099 |
| 4942 | 26.599 |
| 4943 | 27.099 |
| 4944 | 27.599 |
| 4945 | 28.099 |
| 4946 | 28.099 |
| 4947 | 28.099 |
| 4948 | 27.099 |
| 4949 | 26.599 |
| 4950 | 26.599 |
| 4951 | 26.599 |
| 4952 | 26.599 |
| 4953 | 26.599 |
| 4954 | 27.099 |
| 4955 | 27.599 |
| 4956 | 27.099 |
| 4957 | 27.599 |
| 4958 | 27.099 |
| 4959 | 27.099 |
| 4960 | 27.099 |
| 4961 | 27.099 |
| 4962 | 26.599 |
| 4963 | 26.099 |
| 4964 | 26.099 |
| 4965 | 26.599 |
| 4966 | 26.599 |
| 4967 | 27.099 |
| 4968 | 28.099 |
| 4969 | 28.099 |
| 4970 | 28.099 |
| 4971 | 28.598 |
| 4972 | 28.099 |
| 4973 | 27.099 |
| 4974 | 26.599 |
| 4975 | 26.599 |
| 4976 | 26.599 |
| 4977 | 26.099 |
| 4978 | 27.099 |
| 4979 | 27.099 |
| 4980 | 27.599 |
| 4981 | 27.599 |
| 4982 | 27.599 |
| 4983 | 27.599 |
| 4984 | 27.599 |
| 4985 | 27.599 |
| 4986 | 26.599 |
| 4987 | 26.099 |
| 4988 | 26.099 |
| 4989 | 26.599 |
| 4990 | 26.599 |
| 4991 | 26.599 |
| 4992 | 27.599 |
| 4993 | 28.099 |
| 4994 | 28.099 |
| 4995 | 28.099 |
| 4996 | 27.599 |
| 4997 | 27.099 |
| 4998 | 26.099 |
| 4999 | 25.6 |
| 5000 | 26.099 |
| 5001 | 26.099 |
| 5002 | 26.099 |
| 5003 | 27.099 |
| 5004 | 27.599 |
| 5005 | 27.599 |
| 5006 | 27.599 |
| 5007 | 27.599 |
| 5008 | 27.599 |
| 5009 | 27.599 |
| 5010 | 27.099 |
| 5011 | 26.099 |
| 5012 | 26.599 |
| 5013 | 27.099 |
| 5014 | 27.599 |
| 5015 | 27.099 |
| 5016 | 27.599 |
| 5017 | 28.598 |
| 5018 | 28.598 |
| 5019 | 28.598 |
| 5020 | 28.598 |
| 5021 | 28.099 |
| 5022 | 27.599 |
| 5023 | 27.099 |
| 5024 | 26.599 |
| 5025 | 26.599 |
| 5026 | 26.599 |
| 5027 | 27.599 |
| 5028 | 28.099 |
| 5029 | 28.099 |
| 5030 | 28.099 |
| 5031 | 28.099 |
| 5032 | 28.099 |
| 5033 | 28.598 |
| 5034 | 28.099 |
| 5035 | 27.099 |
| 5036 | 26.099 |
| 5037 | 26.599 |
| 5038 | 27.099 |
| 5039 | 26.599 |
| 5040 | 27.599 |
| 5041 | 28.598 |
| 5042 | 29.098 |
| 5043 | 29.598 |
| 5044 | 29.598 |
| 5045 | 28.598 |
| 5046 | 28.598 |
| 5047 | 27.599 |
| 5048 | 27.099 |
| 5049 | 27.599 |
| 5050 | 27.099 |
| 5051 | 27.599 |
| 5052 | 28.598 |
| 5053 | 28.598 |
| 5054 | 29.098 |
| 5055 | 29.098 |
| 5056 | 29.098 |
| 5057 | 29.098 |
| 5058 | 29.098 |
| 5059 | 27.599 |
| 5060 | 27.099 |
| 5061 | 27.099 |
| 5062 | 27.599 |
| 5063 | 27.099 |
| 5064 | 27.599 |
| 5065 | 28.598 |
| 5066 | 29.598 |
| 5067 | 29.598 |
| 5068 | 29.598 |
| 5069 | 29.098 |
| 5070 | 29.098 |
| 5071 | 28.099 |
| 5072 | 28.099 |
| 5073 | 27.099 |
| 5074 | 27.599 |
| 5075 | 27.599 |
| 5076 | 28.099 |
| 5077 | 28.598 |
| 5078 | 29.098 |
| 5079 | 29.098 |
| 5080 | 29.098 |
| 5081 | 29.098 |
| 5082 | 29.098 |
| 5083 | 28.598 |
| 5084 | 27.599 |
| 5085 | 27.099 |
| 5086 | 27.099 |
| 5087 | 27.599 |
| 5088 | 28.099 |
| 5089 | 28.598 |
| 5090 | 29.098 |
| 5091 | 29.598 |
| 5092 | 30.097 |
| 5093 | 30.097 |
| 5094 | 30.097 |
| 5095 | 29.098 |
| 5096 | 28.598 |
| 5097 | 28.099 |
| 5098 | 28.099 |
| 5099 | 28.099 |
| 5100 | 28.598 |
| 5101 | 29.098 |
| 5102 | 29.098 |
| 5103 | 29.098 |
| 5104 | 29.098 |
| 5105 | 29.098 |
| 5106 | 28.598 |
| 5107 | 29.098 |
| 5108 | 28.099 |
| 5109 | 28.099 |
| 5110 | 27.599 |
| 5111 | 28.099 |
| 5112 | 28.099 |
| 5113 | 28.099 |
| 5114 | 29.098 |
| 5115 | 29.098 |
| 5116 | 29.098 |
| 5117 | 29.098 |
| 5118 | 29.098 |
| 5119 | 29.098 |
| 5120 | 29.098 |
| 5121 | 28.598 |
| 5122 | 28.598 |
| 5123 | 28.598 |
| 5124 | 28.598 |
| 5125 | 28.598 |
| 5126 | 28.598 |
| 5127 | 28.598 |
| 5128 | 28.598 |
| 5129 | 28.598 |
| 5130 | 28.598 |
| 5131 | 28.598 |
| 5132 | 29.098 |
| 5133 | 28.598 |
| 5134 | 28.598 |
| 5135 | 29.098 |
| 5136 | 29.098 |
| 5137 | 29.098 |
| 5138 | 29.098 |
| 5139 | 29.098 |
| 5140 | 29.598 |
| 5141 | 29.598 |
| 5142 | 29.598 |
| 5143 | 29.598 |
| 5144 | 29.598 |
| 5145 | 29.598 |
| 5146 | 29.098 |
| 5147 | 29.098 |
| 5148 | 29.098 |
| 5149 | 29.098 |
| 5150 | 29.098 |
| 5151 | 28.598 |
| 5152 | 28.598 |
| 5153 | 28.598 |
| 5154 | 29.098 |
| 5155 | 29.098 |
| 5156 | 29.098 |
| 5157 | 29.098 |
| 5158 | 29.098 |
| 5159 | 29.098 |
| 5160 | 29.098 |
| 5161 | 29.098 |
| 5162 | 29.598 |
| 5163 | 29.098 |
| 5164 | 29.598 |
| 5165 | 29.598 |
| 5166 | 30.097 |
| 5167 | 30.097 |
| 5168 | 30.097 |
| 5169 | 30.097 |
| 5170 | 29.598 |
| 5171 | 29.598 |
| 5172 | 29.598 |
| 5173 | 29.598 |
| 5174 | 29.598 |
| 5175 | 29.598 |
| 5176 | 29.598 |
| 5177 | 29.598 |
| 5178 | 29.598 |
| 5179 | 29.598 |
| 5180 | 29.598 |
| 5181 | 30.097 |
| 5182 | 30.097 |
| 5183 | 29.598 |
| 5184 | 29.598 |
| 5185 | 29.598 |
| 5186 | 29.598 |
| 5187 | 29.598 |
| 5188 | 29.598 |
| 5189 | 29.598 |
| 5190 | 30.097 |
| 5191 | 30.097 |
| 5192 | 30.097 |
| 5193 | 30.097 |
| 5194 | 30.097 |
| 5195 | 30.097 |
| 5196 | 30.097 |
| 5197 | 29.598 |
| 5198 | 29.598 |
| 5199 | 29.598 |
| 5200 | 29.598 |
| 5201 | 29.598 |
| 5202 | 29.598 |
| 5203 | 30.097 |
| 5204 | 30.097 |
| 5205 | 30.097 |
| 5206 | 30.097 |
| 5207 | 30.097 |
| 5208 | 29.598 |
| 5209 | 29.598 |
| 5210 | 29.598 |
| 5211 | 29.598 |
| 5212 | 29.598 |
| 5213 | 29.598 |
| 5214 | 29.598 |
| 5215 | 29.598 |
| 5216 | 30.097 |
| 5217 | 30.597 |
| 5218 | 30.097 |
| 5219 | 30.097 |
| 5220 | 30.097 |
| 5221 | 30.097 |
| 5222 | 29.598 |
| 5223 | 29.598 |
| 5224 | 29.598 |
| 5225 | 29.598 |
| 5226 | 29.598 |
| 5227 | 29.598 |
| 5228 | 29.598 |
| 5229 | 30.097 |
| 5230 | 30.097 |
| 5231 | 30.597 |
| 5232 | 30.097 |
| 5233 | 29.598 |
| 5234 | 29.598 |
| 5235 | 29.098 |
| 5236 | 28.598 |
| 5237 | 29.098 |
| 5238 | 29.098 |
| 5239 | 29.098 |
| 5240 | 29.598 |
| 5241 | 30.097 |
| 5242 | 30.097 |
| 5243 | 30.097 |
| 5244 | 29.598 |
| 5245 | 29.598 |
| 5246 | 29.598 |
| 5247 | 29.598 |
| 5248 | 28.099 |
| 5249 | 28.099 |
| 5250 | 27.599 |
| 5251 | 28.099 |
| 5252 | 28.099 |
| 5253 | 28.598 |
| 5254 | 29.598 |
| 5255 | 30.097 |
| 5256 | 30.097 |
| 5257 | 29.598 |
| 5258 | 29.098 |
| 5259 | 28.598 |
| 5260 | 28.099 |
| 5261 | 28.598 |
| 5262 | 28.099 |
| 5263 | 28.099 |
| 5264 | 28.598 |
| 5265 | 29.598 |
| 5266 | 29.598 |
| 5267 | 29.598 |
| 5268 | 29.598 |
| 5269 | 29.598 |
| 5270 | 29.598 |
| 5271 | 29.098 |
| 5272 | 29.098 |
| 5273 | 28.099 |
| 5274 | 27.599 |
| 5275 | 28.099 |
| 5276 | 28.598 |
| 5277 | 28.598 |
| 5278 | 29.098 |
| 5279 | 29.598 |
| 5280 | 30.097 |
| 5281 | 30.097 |
| 5282 | 29.598 |
| 5283 | 29.098 |
| 5284 | 28.099 |
| 5285 | 28.099 |
| 5286 | 27.599 |
| 5287 | 28.099 |
| 5288 | 28.099 |
| 5289 | 28.598 |
| 5290 | 29.098 |
| 5291 | 29.098 |
| 5292 | 28.598 |
| 5293 | 28.598 |
| 5294 | 28.598 |
| 5295 | 28.598 |
| 5296 | 28.598 |
| 5297 | 27.599 |
| 5298 | 26.599 |
| 5299 | 26.599 |
| 5300 | 26.599 |
| 5301 | 26.599 |
| 5302 | 27.099 |
| 5303 | 28.099 |
| 5304 | 28.598 |
| 5305 | 29.098 |
| 5306 | 28.598 |
| 5307 | 28.598 |
| 5308 | 28.099 |
| 5309 | 27.599 |
| 5310 | 27.099 |
| 5311 | 26.599 |
| 5312 | 26.599 |
| 5313 | 27.099 |
| 5314 | 27.599 |
| 5315 | 28.099 |
| 5316 | 28.598 |
| 5317 | 28.598 |
| 5318 | 28.099 |
| 5319 | 28.099 |
| 5320 | 28.099 |
| 5321 | 28.099 |
| 5322 | 27.099 |
| 5323 | 27.099 |
| 5324 | 27.099 |
| 5325 | 27.599 |
| 5326 | 27.599 |
| 5327 | 27.599 |
| 5328 | 28.598 |
| 5329 | 29.098 |
| 5330 | 29.098 |
| 5331 | 29.098 |
| 5332 | 29.098 |
| 5333 | 28.598 |
| 5334 | 28.099 |
| 5335 | 27.599 |
| 5336 | 28.099 |
| 5337 | 27.599 |
| 5338 | 28.099 |
| 5339 | 28.099 |
| 5340 | 28.099 |
| 5341 | 28.099 |
| 5342 | 27.599 |
| 5343 | 27.599 |
| 5344 | 27.599 |
| 5345 | 27.599 |
| 5346 | 28.099 |
| 5347 | 28.099 |
| 5348 | 28.099 |
| 5349 | 28.099 |
| 5350 | 28.099 |
| 5351 | 28.099 |
| 5352 | 28.598 |
| 5353 | 28.598 |
| 5354 | 28.598 |
| 5355 | 28.598 |
| 5356 | 28.598 |
| 5357 | 28.598 |
| 5358 | 28.598 |
| 5359 | 28.099 |
| 5360 | 28.099 |
| 5361 | 28.099 |
| 5362 | 28.099 |
| 5363 | 28.099 |
| 5364 | 28.099 |
| 5365 | 28.099 |
| 5366 | 28.099 |
| 5367 | 28.099 |
| 5368 | 28.099 |
| 5369 | 28.099 |
| 5370 | 28.099 |
| 5371 | 28.099 |
| 5372 | 28.099 |
| 5373 | 28.099 |
| 5374 | 28.099 |
| 5375 | 28.099 |
| 5376 | 28.099 |
| 5377 | 28.598 |
| 5378 | 29.098 |
| 5379 | 29.098 |
| 5380 | 28.598 |
| 5381 | 28.598 |
| 5382 | 28.598 |
| 5383 | 28.598 |
| 5384 | 28.099 |
| 5385 | 28.099 |
| 5386 | 28.099 |
| 5387 | 28.099 |
| 5388 | 28.099 |
| 5389 | 28.099 |
| 5390 | 28.099 |
| 5391 | 27.599 |
| 5392 | 27.599 |
| 5393 | 27.599 |
| 5394 | 27.599 |
| 5395 | 28.099 |
| 5396 | 28.099 |
| 5397 | 28.099 |
| 5398 | 28.099 |
| 5399 | 28.099 |
| 5400 | 28.099 |
| 5401 | 28.099 |
| 5402 | 28.099 |
| 5403 | 28.099 |
| 5404 | 28.099 |
| 5405 | 28.099 |
| 5406 | 27.599 |
| 5407 | 27.599 |
| 5408 | 27.599 |
| 5409 | 27.599 |
| 5410 | 27.599 |
| 5411 | 27.599 |
| 5412 | 27.599 |
| 5413 | 27.099 |
| 5414 | 27.099 |
| 5415 | 27.099 |
| 5416 | 26.599 |
| 5417 | 26.599 |
| 5418 | 26.599 |
| 5419 | 26.599 |
| 5420 | 27.099 |
| 5421 | 27.099 |
| 5422 | 27.599 |
| 5423 | 27.599 |
| 5424 | 27.599 |
| 5425 | 27.599 |
| 5426 | 27.599 |
| 5427 | 27.599 |
| 5428 | 27.599 |
| 5429 | 27.599 |
| 5430 | 27.599 |
| 5431 | 27.599 |
| 5432 | 27.099 |
| 5433 | 27.599 |
| 5434 | 27.599 |
| 5435 | 27.599 |
| 5436 | 27.099 |
| 5437 | 27.099 |
| 5438 | 26.599 |
| 5439 | 26.599 |
| 5440 | 26.599 |
| 5441 | 26.599 |
| 5442 | 26.599 |
| 5443 | 26.599 |
| 5444 | 26.599 |
| 5445 | 27.099 |
| 5446 | 27.099 |
| 5447 | 27.599 |
| 5448 | 27.599 |
| 5449 | 27.599 |
| 5450 | 27.599 |
| 5451 | 27.599 |
| 5452 | 27.599 |
| 5453 | 27.599 |
| 5454 | 27.099 |
| 5455 | 27.099 |
| 5456 | 27.099 |
| 5457 | 27.099 |
| 5458 | 27.599 |
| 5459 | 27.599 |
| 5460 | 27.599 |
| 5461 | 27.099 |
| 5462 | 27.099 |
| 5463 | 27.099 |
| 5464 | 27.099 |
| 5465 | 27.099 |
| 5466 | 27.099 |
| 5467 | 27.099 |
| 5468 | 27.099 |
| 5469 | 27.599 |
| 5470 | 27.599 |
| 5471 | 27.599 |
| 5472 | 27.599 |
| 5473 | 28.099 |
| 5474 | 27.599 |
| 5475 | 28.099 |
| 5476 | 28.099 |
| 5477 | 27.599 |
| 5478 | 27.599 |
| 5479 | 27.599 |
| 5480 | 27.599 |
| 5481 | 27.599 |
| 5482 | 27.599 |
| 5483 | 28.099 |
| 5484 | 28.099 |
| 5485 | 27.599 |
| 5486 | 27.599 |
| 5487 | 27.599 |
| 5488 | 27.599 |
| 5489 | 27.599 |
| 5490 | 27.599 |
| 5491 | 27.599 |
| 5492 | 27.599 |
| 5493 | 28.099 |
| 5494 | 28.099 |
| 5495 | 28.099 |
| 5496 | 28.099 |
| 5497 | 28.099 |
| 5498 | 28.099 |
| 5499 | 28.099 |
| 5500 | 28.099 |
| 5501 | 28.099 |
| 5502 | 28.099 |
| 5503 | 28.099 |
| 5504 | 28.099 |
| 5505 | 28.099 |
| 5506 | 28.099 |
| 5507 | 28.099 |
| 5508 | 28.099 |
| 5509 | 27.599 |
| 5510 | 27.599 |
| 5511 | 27.599 |
| 5512 | 27.599 |
| 5513 | 27.599 |
| 5514 | 27.599 |
| 5515 | 27.599 |
| 5516 | 27.599 |
| 5517 | 28.099 |
| 5518 | 28.099 |
| 5519 | 28.099 |
| 5520 | 28.099 |
| 5521 | 28.099 |
| 5522 | 28.099 |
| 5523 | 28.598 |
| 5524 | 28.598 |
| 5525 | 28.099 |
| 5526 | 28.099 |
| 5527 | 28.099 |
| 5528 | 28.099 |
| 5529 | 28.099 |
| 5530 | 28.099 |
| 5531 | 28.099 |
| 5532 | 28.099 |
| 5533 | 28.099 |
| 5534 | 28.099 |
| 5535 | 28.099 |
| 5536 | 28.099 |
| 5537 | 28.099 |
| 5538 | 28.099 |
| 5539 | 28.099 |
| 5540 | 28.099 |
| 5541 | 28.598 |
| 5542 | 28.598 |
| 5543 | 28.598 |
| 5544 | 28.598 |
| 5545 | 28.099 |
| 5546 | 28.099 |
| 5547 | 28.099 |
| 5548 | 28.099 |
| 5549 | 28.099 |
| 5550 | 28.099 |
| 5551 | 28.099 |
| 5552 | 28.099 |
| 5553 | 28.099 |
| 5554 | 28.099 |
| 5555 | 28.099 |
| 5556 | 28.099 |
| 5557 | 28.099 |
| 5558 | 28.099 |
| 5559 | 28.099 |
| 5560 | 28.099 |
| 5561 | 28.099 |
| 5562 | 28.099 |
| 5563 | 28.099 |
| 5564 | 28.099 |
| 5565 | 28.598 |
| 5566 | 28.598 |
| 5567 | 28.598 |
| 5568 | 28.598 |
| 5569 | 28.598 |
| 5570 | 28.598 |
| 5571 | 28.598 |
| 5572 | 28.099 |
| 5573 | 28.099 |
| 5574 | 28.099 |
| 5575 | 28.099 |
| 5576 | 28.598 |
| 5577 | 28.598 |
| 5578 | 28.598 |
| 5579 | 28.598 |
| 5580 | 28.598 |
| 5581 | 28.099 |
| 5582 | 28.099 |
| 5583 | 28.099 |
| 5584 | 28.099 |
| 5585 | 28.099 |
| 5586 | 28.099 |
| 5587 | 28.099 |
| 5588 | 28.099 |
| 5589 | 28.099 |
| 5590 | 28.598 |
| 5591 | 29.098 |
| 5592 | 29.098 |
| 5593 | 29.098 |
| 5594 | 28.598 |
| 5595 | 28.598 |
| 5596 | 28.598 |
| 5597 | 28.099 |
| 5598 | 28.099 |
| 5599 | 28.099 |
| 5600 | 28.598 |
| 5601 | 28.598 |
| 5602 | 28.598 |
| 5603 | 28.598 |
| 5604 | 28.598 |
| 5605 | 28.598 |
| 5606 | 28.598 |
| 5607 | 28.598 |
| 5608 | 28.099 |
| 5609 | 28.099 |
| 5610 | 28.099 |
| 5611 | 28.099 |
| 5612 | 28.099 |
| 5613 | 28.099 |
| 5614 | 28.598 |
| 5615 | 29.098 |
| 5616 | 29.098 |
| 5617 | 29.098 |
| 5618 | 29.098 |
| 5619 | 28.598 |
| 5620 | 28.598 |
| 5621 | 28.099 |
| 5622 | 28.099 |
| 5623 | 28.099 |
| 5624 | 28.099 |
| 5625 | 28.598 |
| 5626 | 28.598 |
| 5627 | 28.598 |
| 5628 | 28.598 |
| 5629 | 28.598 |
| 5630 | 28.598 |
| 5631 | 28.598 |
| 5632 | 28.598 |
| 5633 | 28.099 |
| 5634 | 27.599 |
| 5635 | 27.599 |
| 5636 | 27.599 |
| 5637 | 27.599 |
| 5638 | 28.099 |
| 5639 | 28.598 |
| 5640 | 28.598 |
| 5641 | 29.098 |
| 5642 | 28.598 |
| 5643 | 28.598 |
| 5644 | 28.598 |
| 5645 | 28.099 |
| 5646 | 28.099 |
| 5647 | 28.099 |
| 5648 | 28.099 |
| 5649 | 28.099 |
| 5650 | 28.099 |
| 5651 | 28.099 |
| 5652 | 28.099 |
| 5653 | 27.599 |
| 5654 | 27.599 |
| 5655 | 27.099 |
| 5656 | 27.099 |
| 5657 | 27.099 |
| 5658 | 27.099 |
| 5659 | 27.599 |
| 5660 | 27.599 |
| 5661 | 27.599 |
| 5662 | 27.599 |
| 5663 | 27.599 |
| 5664 | 27.599 |
| 5665 | 27.599 |
| 5666 | 27.599 |
| 5667 | 27.599 |
| 5668 | 27.599 |
| 5669 | 27.599 |
| 5670 | 27.599 |
| 5671 | 27.599 |
| 5672 | 27.599 |
| 5673 | 27.099 |
| 5674 | 27.099 |
| 5675 | 27.099 |
| 5676 | 26.599 |
| 5677 | 26.599 |
| 5678 | 26.599 |
| 5679 | 26.099 |
| 5680 | 25.6 |
| 5681 | 25.1 |
| 5682 | 25.1 |
| 5683 | 25.1 |
| 5684 | 24.6 |
| 5685 | 25.1 |
| 5686 | 24.6 |
| 5687 | 24.6 |
| 5688 | 24.6 |
| 5689 | 24.1 |
| 5690 | 24.1 |
| 5691 | 24.1 |
| 5692 | 23.6 |
| 5693 | 23.6 |
| 5694 | 23.6 |
| 5695 | 24.1 |
| 5696 | 25.1 |
| 5697 | 24.6 |
| 5698 | 24.6 |
| 5699 | 23.6 |
| 5700 | 23.099 |
| 5701 | 23.099 |
| 5702 | 23.099 |
| 5703 | 23.099 |
| 5704 | 22.599 |
| 5705 | 22.599 |
| 5706 | 22.599 |
| 5707 | 23.6 |
| 5708 | 24.6 |
| 5709 | 24.6 |
| 5710 | 25.1 |
| 5711 | 24.6 |
| 5712 | 24.1 |
| 5713 | 23.6 |
| 5714 | 23.6 |
| 5715 | 23.6 |
| 5716 | 23.6 |
| 5717 | 24.1 |
| 5718 | 24.6 |
| 5719 | 25.1 |
| 5720 | 25.1 |
| 5721 | 25.1 |
| 5722 | 25.1 |
| 5723 | 24.6 |
| 5724 | 24.1 |
| 5725 | 23.6 |
| 5726 | 23.6 |
| 5727 | 23.6 |
| 5728 | 23.6 |
| 5729 | 23.6 |
| 5730 | 23.6 |
| 5731 | 24.6 |
| 5732 | 25.1 |
| 5733 | 25.6 |
| 5734 | 25.6 |
| 5735 | 25.6 |
| 5736 | 25.6 |
| 5737 | 25.1 |
| 5738 | 24.6 |
| 5739 | 24.6 |
| 5740 | 25.1 |
| 5741 | 25.1 |
| 5742 | 25.6 |
| 5743 | 25.6 |
| 5744 | 25.6 |
| 5745 | 26.099 |
| 5746 | 25.6 |
| 5747 | 25.6 |
| 5748 | 25.1 |
| 5749 | 24.6 |
| 5750 | 24.6 |
| 5751 | 24.6 |
| 5752 | 24.6 |
| 5753 | 24.6 |
| 5754 | 25.1 |
| 5755 | 25.6 |
| 5756 | 25.6 |
| 5757 | 25.6 |
| 5758 | 26.099 |
| 5759 | 26.099 |
| 5760 | 26.099 |
| 5761 | 26.099 |
| 5762 | 25.6 |
| 5763 | 26.099 |
| 5764 | 25.6 |
| 5765 | 26.099 |
| 5766 | 26.099 |
| 5767 | 26.099 |
| 5768 | 25.6 |
| 5769 | 25.6 |
| 5770 | 25.6 |
| 5771 | 25.6 |
| 5772 | 25.6 |
| 5773 | 25.6 |
| 5774 | 25.6 |
| 5775 | 25.1 |
| 5776 | 25.6 |
| 5777 | 25.6 |
| 5778 | 25.6 |
| 5779 | 25.6 |
| 5780 | 25.6 |
| 5781 | 25.6 |
| 5782 | 25.6 |
| 5783 | 26.099 |
| 5784 | 26.099 |
| 5785 | 26.099 |
| 5786 | 26.599 |
| 5787 | 26.599 |
| 5788 | 26.099 |
| 5789 | 26.099 |
| 5790 | 26.099 |
| 5791 | 26.099 |
| 5792 | 25.6 |
| 5793 | 25.6 |
| 5794 | 25.6 |
| 5795 | 25.6 |
| 5796 | 25.6 |
| 5797 | 25.6 |
| 5798 | 25.6 |
| 5799 | 25.6 |
| 5800 | 25.6 |
| 5801 | 25.6 |
| 5802 | 25.6 |
| 5803 | 26.099 |
| 5804 | 25.6 |
| 5805 | 25.6 |
| 5806 | 25.6 |
| 5807 | 25.1 |
| 5808 | 25.6 |
| 5809 | 25.6 |
| 5810 | 25.6 |
| 5811 | 25.6 |
| 5812 | 25.6 |
| 5813 | 25.6 |
| 5814 | 25.6 |
| 5815 | 25.1 |
| 5816 | 25.1 |
| 5817 | 25.1 |
| 5818 | 25.1 |
| 5819 | 25.1 |
| 5820 | 25.1 |
| 5821 | 25.1 |
| 5822 | 25.1 |
| 5823 | 24.6 |
| 5824 | 24.6 |
| 5825 | 24.6 |
| 5826 | 24.6 |
| 5827 | 24.6 |
| 5828 | 24.6 |
| 5829 | 24.6 |
| 5830 | 24.6 |
| 5831 | 25.1 |
| 5832 | 25.1 |
| 5833 | 25.1 |
| 5834 | 25.1 |
| 5835 | 25.1 |
| 5836 | 25.1 |
| 5837 | 24.6 |
| 5838 | 24.6 |
| 5839 | 24.6 |
| 5840 | 24.6 |
| 5841 | 24.6 |
| 5842 | 24.6 |
| 5843 | 24.6 |
| 5844 | 24.1 |
| 5845 | 24.1 |
| 5846 | 24.1 |
| 5847 | 24.1 |
| 5848 | 24.1 |
| 5849 | 24.1 |
| 5850 | 24.1 |
| 5851 | 24.1 |
| 5852 | 24.1 |
| 5853 | 24.6 |
| 5854 | 25.1 |
| 5855 | 25.1 |
| 5856 | 25.1 |
| 5857 | 25.1 |
| 5858 | 25.1 |
| 5859 | 24.6 |
| 5860 | 24.6 |
| 5861 | 24.6 |
| 5862 | 24.6 |
| 5863 | 24.1 |
| 5864 | 24.1 |
| 5865 | 24.1 |
| 5866 | 24.1 |
| 5867 | 24.6 |
| 5868 | 24.1 |
| 5869 | 24.1 |
| 5870 | 24.1 |
| 5871 | 24.1 |
| 5872 | 24.1 |
| 5873 | 24.1 |
| 5874 | 24.1 |
| 5875 | 24.1 |
| 5876 | 24.6 |
| 5877 | 24.6 |
| 5878 | 24.6 |
| 5879 | 25.1 |
| 5880 | 25.1 |
| 5881 | 25.1 |
| 5882 | 25.1 |
| 5883 | 25.1 |
| 5884 | 25.1 |
| 5885 | 24.6 |
| 5886 | 24.6 |
| 5887 | 24.6 |
| 5888 | 24.1 |
| 5889 | 24.1 |
| 5890 | 24.1 |
| 5891 | 24.1 |
| 5892 | 24.1 |
| 5893 | 24.1 |
| 5894 | 24.6 |
| 5895 | 24.6 |
| 5896 | 24.6 |
| 5897 | 24.6 |
| 5898 | 24.6 |
| 5899 | 24.6 |
| 5900 | 24.6 |
| 5901 | 24.6 |
| 5902 | 24.6 |
| 5903 | 24.6 |
| 5904 | 24.6 |
| 5905 | 24.6 |
| 5906 | 24.6 |
| 5907 | 24.6 |
| 5908 | 24.6 |
| 5909 | 24.6 |
| 5910 | 24.6 |
| 5911 | 24.6 |
| 5912 | 24.6 |
| 5913 | 24.6 |
| 5914 | 24.6 |
| 5915 | 24.1 |
| 5916 | 24.6 |
| 5917 | 24.6 |
| 5918 | 24.6 |
| 5919 | 24.6 |
| 5920 | 24.6 |
| 5921 | 24.6 |
| 5922 | 24.6 |
| 5923 | 24.6 |
| 5924 | 24.6 |
| 5925 | 25.1 |
| 5926 | 25.1 |
| 5927 | 25.1 |
| 5928 | 25.6 |
| 5929 | 25.1 |
| 5930 | 25.1 |
| 5931 | 25.1 |
| 5932 | 24.6 |
| 5933 | 24.6 |
| 5934 | 25.1 |
| 5935 | 25.1 |
| 5936 | 25.1 |
| 5937 | 25.1 |
| 5938 | 25.1 |
| 5939 | 25.1 |
| 5940 | 25.1 |
| 5941 | 25.1 |
| 5942 | 25.1 |
| 5943 | 24.6 |
| 5944 | 24.6 |
| 5945 | 24.6 |
| 5946 | 24.6 |
| 5947 | 24.6 |
| 5948 | 24.6 |
| 5949 | 25.1 |
| 5950 | 25.1 |
| 5951 | 25.6 |
| 5952 | 25.6 |
| 5953 | 25.6 |
| 5954 | 25.1 |
| 5955 | 25.1 |
| 5956 | 24.6 |
| 5957 | 24.6 |
| 5958 | 24.6 |
| 5959 | 24.6 |
| 5960 | 24.6 |
| 5961 | 25.1 |
| 5962 | 25.1 |
| 5963 | 25.1 |
| 5964 | 24.6 |
| 5965 | 24.6 |
| 5966 | 24.6 |
| 5967 | 24.6 |
| 5968 | 24.6 |
| 5969 | 24.6 |
| 5970 | 24.1 |
| 5971 | 24.1 |
| 5972 | 24.1 |
| 5973 | 24.1 |
| 5974 | 24.6 |
| 5975 | 24.6 |
| 5976 | 24.6 |
| 5977 | 24.6 |
| 5978 | 24.6 |
| 5979 | 24.6 |
| 5980 | 24.6 |
| 5981 | 24.1 |
| 5982 | 24.1 |
| 5983 | 24.1 |
| 5984 | 24.1 |
| 5985 | 24.1 |
| 5986 | 24.1 |
| 5987 | 24.1 |
| 5988 | 24.1 |
| 5989 | 24.1 |
| 5990 | 24.1 |
| 5991 | 24.1 |
| 5992 | 24.1 |
| 5993 | 24.1 |
| 5994 | 24.1 |
| 5995 | 24.1 |
| 5996 | 24.1 |
| 5997 | 24.1 |
| 5998 | 24.6 |
| 5999 | 24.6 |
| 6000 | 25.1 |
| 6001 | 25.1 |
| 6002 | 25.1 |
| 6003 | 25.1 |
| 6004 | 25.1 |
| 6005 | 24.6 |
| 6006 | 24.6 |
| 6007 | 24.1 |
| 6008 | 24.1 |
| 6009 | 24.6 |
| 6010 | 24.6 |
| 6011 | 24.6 |
| 6012 | 24.6 |
| 6013 | 24.6 |
| 6014 | 24.6 |
| 6015 | 24.6 |
| 6016 | 24.6 |
| 6017 | 24.6 |
| 6018 | 24.6 |
| 6019 | 24.6 |
| 6020 | 24.6 |
| 6021 | 24.6 |
| 6022 | 24.6 |
| 6023 | 25.1 |
| 6024 | 25.6 |
| 6025 | 25.6 |
| 6026 | 25.6 |
| 6027 | 25.6 |
| 6028 | 25.6 |
| 6029 | 25.1 |
| 6030 | 24.6 |
| 6031 | 24.6 |
| 6032 | 24.6 |
| 6033 | 24.6 |
| 6034 | 24.6 |
| 6035 | 25.1 |
| 6036 | 25.1 |
| 6037 | 25.1 |
| 6038 | 25.1 |
| 6039 | 25.1 |
| 6040 | 25.1 |
| 6041 | 24.6 |
| 6042 | 24.6 |
| 6043 | 24.6 |
| 6044 | 24.1 |
| 6045 | 24.6 |
| 6046 | 24.6 |
| 6047 | 25.1 |
| 6048 | 25.6 |
| 6049 | 26.099 |
| 6050 | 25.6 |
| 6051 | 25.6 |
| 6052 | 25.6 |
| 6053 | 25.6 |
| 6054 | 24.6 |
| 6055 | 24.1 |
| 6056 | 24.1 |
| 6057 | 24.1 |
| 6058 | 24.1 |
| 6059 | 24.6 |
| 6060 | 25.1 |
| 6061 | 25.1 |
| 6062 | 25.1 |
| 6063 | 25.1 |
| 6064 | 25.1 |
| 6065 | 25.1 |
| 6066 | 24.6 |
| 6067 | 24.6 |
| 6068 | 24.6 |
| 6069 | 24.6 |
| 6070 | 24.6 |
| 6071 | 24.6 |
| 6072 | 25.6 |
| 6073 | 26.099 |
| 6074 | 26.099 |
| 6075 | 26.099 |
| 6076 | 25.6 |
| 6077 | 25.6 |
| 6078 | 25.1 |
| 6079 | 24.6 |
| 6080 | 24.1 |
| 6081 | 24.6 |
| 6082 | 24.1 |
| 6083 | 24.6 |
| 6084 | 25.1 |
| 6085 | 25.1 |
| 6086 | 25.1 |
| 6087 | 25.1 |
| 6088 | 25.1 |
| 6089 | 25.1 |
| 6090 | 24.6 |
| 6091 | 24.1 |
| 6092 | 24.6 |
| 6093 | 24.6 |
| 6094 | 24.6 |
| 6095 | 24.6 |
| 6096 | 25.1 |
| 6097 | 26.099 |
| 6098 | 26.099 |
| 6099 | 26.099 |
| 6100 | 26.099 |
| 6101 | 26.099 |
| 6102 | 26.099 |
| 6103 | 25.1 |
| 6104 | 24.6 |
| 6105 | 24.6 |
| 6106 | 24.6 |
| 6107 | 24.6 |
| 6108 | 25.1 |
| 6109 | 25.1 |
| 6110 | 25.1 |
| 6111 | 25.6 |
| 6112 | 25.6 |
| 6113 | 25.1 |
| 6114 | 25.1 |
| 6115 | 24.6 |
| 6116 | 24.1 |
| 6117 | 24.6 |
| 6118 | 24.6 |
| 6119 | 24.6 |
| 6120 | 24.6 |
| 6121 | 25.1 |
| 6122 | 25.6 |
| 6123 | 25.6 |
| 6124 | 25.6 |
| 6125 | 25.6 |
| 6126 | 25.6 |
| 6127 | 25.6 |
| 6128 | 24.6 |
| 6129 | 24.6 |
| 6130 | 24.6 |
| 6131 | 24.6 |
| 6132 | 24.6 |
| 6133 | 25.1 |
| 6134 | 25.1 |
| 6135 | 25.1 |
| 6136 | 25.1 |
| 6137 | 25.1 |
| 6138 | 25.1 |
| 6139 | 24.6 |
| 6140 | 24.1 |
| 6141 | 24.6 |
| 6142 | 24.6 |
| 6143 | 24.6 |
| 6144 | 25.1 |
| 6145 | 25.1 |
| 6146 | 25.6 |
| 6147 | 25.6 |
| 6148 | 26.099 |
| 6149 | 25.6 |
| 6150 | 25.6 |
| 6151 | 25.6 |
| 6152 | 25.6 |
| 6153 | 25.6 |
| 6154 | 25.1 |
| 6155 | 25.1 |
| 6156 | 25.1 |
| 6157 | 25.1 |
| 6158 | 25.1 |
| 6159 | 25.1 |
| 6160 | 25.1 |
| 6161 | 25.1 |
| 6162 | 25.1 |
| 6163 | 25.1 |
| 6164 | 25.1 |
| 6165 | 25.1 |
| 6166 | 25.1 |
| 6167 | 25.1 |
| 6168 | 25.1 |
| 6169 | 25.1 |
| 6170 | 25.6 |
| 6171 | 25.6 |
| 6172 | 25.6 |
| 6173 | 25.6 |
| 6174 | 25.6 |
| 6175 | 25.6 |
| 6176 | 25.6 |
| 6177 | 25.6 |
| 6178 | 25.6 |
| 6179 | 25.6 |
| 6180 | 25.6 |
| 6181 | 25.6 |
| 6182 | 25.6 |
| 6183 | 25.6 |
| 6184 | 25.6 |
| 6185 | 25.6 |
| 6186 | 25.6 |
| 6187 | 25.6 |
| 6188 | 25.6 |
| 6189 | 25.6 |
| 6190 | 25.6 |
| 6191 | 25.6 |
| 6192 | 26.099 |
| 6193 | 26.099 |
| 6194 | 25.6 |
| 6195 | 25.6 |
| 6196 | 25.6 |
| 6197 | 26.099 |
| 6198 | 26.099 |
| 6199 | 25.6 |
| 6200 | 25.6 |
| 6201 | 25.6 |
| 6202 | 25.6 |
| 6203 | 25.6 |
| 6204 | 25.6 |
| 6205 | 25.6 |
| 6206 | 25.6 |
| 6207 | 25.6 |
| 6208 | 25.6 |
| 6209 | 25.6 |
| 6210 | 25.6 |
| 6211 | 25.6 |
| 6212 | 25.6 |
| 6213 | 25.6 |
| 6214 | 25.6 |
| 6215 | 26.099 |
| 6216 | 26.099 |
| 6217 | 26.099 |
| 6218 | 26.099 |
| 6219 | 26.099 |
| 6220 | 26.099 |
| 6221 | 26.099 |
| 6222 | 26.099 |
| 6223 | 25.6 |
| 6224 | 26.099 |
| 6225 | 26.099 |
| 6226 | 26.099 |
| 6227 | 25.6 |
| 6228 | 25.6 |
| 6229 | 25.6 |
| 6230 | 25.6 |
| 6231 | 25.6 |
| 6232 | 25.6 |
| 6233 | 25.6 |
| 6234 | 25.6 |
| 6235 | 25.6 |
| 6236 | 25.6 |
| 6237 | 26.099 |
| 6238 | 26.099 |
| 6239 | 26.099 |
| 6240 | 26.099 |
| 6241 | 26.099 |
| 6242 | 26.099 |
| 6243 | 26.099 |
| 6244 | 25.6 |
| 6245 | 26.099 |
| 6246 | 25.6 |
| 6247 | 25.6 |
| 6248 | 26.099 |
| 6249 | 26.099 |
| 6250 | 26.099 |
| 6251 | 26.099 |
| 6252 | 26.099 |
| 6253 | 26.099 |
| 6254 | 25.6 |
| 6255 | 25.6 |
| 6256 | 25.1 |
| 6257 | 25.1 |
| 6258 | 25.6 |
| 6259 | 25.6 |
| 6260 | 25.6 |
| 6261 | 26.099 |
| 6262 | 26.099 |
| 6263 | 26.099 |
| 6264 | 26.099 |
| 6265 | 26.099 |
| 6266 | 25.6 |
| 6267 | 25.6 |
| 6268 | 25.6 |
| 6269 | 25.6 |
| 6270 | 25.6 |
| 6271 | 25.6 |
| 6272 | 25.6 |
| 6273 | 26.099 |
| 6274 | 26.099 |
| 6275 | 26.099 |
| 6276 | 26.099 |
| 6277 | 26.099 |
| 6278 | 25.6 |
| 6279 | 25.6 |
| 6280 | 25.1 |
| 6281 | 25.1 |
| 6282 | 25.1 |
| 6283 | 25.1 |
| 6284 | 25.1 |
| 6285 | 25.6 |
| 6286 | 26.099 |
| 6287 | 26.099 |
| 6288 | 26.099 |
| 6289 | 26.099 |
| 6290 | 26.099 |
| 6291 | 25.6 |
| 6292 | 25.6 |
| 6293 | 25.6 |
| 6294 | 25.6 |
| 6295 | 25.6 |
| 6296 | 25.6 |
| 6297 | 26.099 |
| 6298 | 26.099 |
| 6299 | 26.099 |
| 6300 | 26.099 |
| 6301 | 25.6 |
| 6302 | 25.6 |
| 6303 | 26.099 |
| 6304 | 25.6 |
| 6305 | 25.1 |
| 6306 | 25.1 |
| 6307 | 25.1 |
| 6308 | 25.1 |
| 6309 | 25.6 |
| 6310 | 26.099 |
| 6311 | 26.099 |
| 6312 | 26.099 |
| 6313 | 26.099 |
| 6314 | 26.099 |
| 6315 | 26.099 |
| 6316 | 25.6 |
| 6317 | 25.6 |
| 6318 | 25.6 |
| 6319 | 25.6 |
| 6320 | 25.6 |
| 6321 | 25.6 |
| 6322 | 25.6 |
| 6323 | 25.6 |
| 6324 | 25.6 |
| 6325 | 25.6 |
| 6326 | 25.6 |
| 6327 | 25.6 |
| 6328 | 25.6 |
| 6329 | 25.1 |
| 6330 | 25.1 |
| 6331 | 25.1 |
| 6332 | 25.1 |
| 6333 | 25.6 |
| 6334 | 25.6 |
| 6335 | 25.6 |
| 6336 | 26.099 |
| 6337 | 26.099 |
| 6338 | 26.099 |
| 6339 | 26.099 |
| 6340 | 26.099 |
| 6341 | 25.6 |
| 6342 | 25.6 |
| 6343 | 25.6 |
| 6344 | 25.6 |
| 6345 | 25.6 |
| 6346 | 25.6 |
| 6347 | 25.1 |
| 6348 | 25.1 |
| 6349 | 25.1 |
| 6350 | 25.1 |
| 6351 | 24.6 |
| 6352 | 24.6 |
| 6353 | 24.6 |
| 6354 | 25.1 |
| 6355 | 25.1 |
| 6356 | 25.1 |
| 6357 | 25.1 |
| 6358 | 25.1 |
| 6359 | 25.1 |
| 6360 | 25.1 |
| 6361 | 25.1 |
| 6362 | 25.1 |
| 6363 | 25.1 |
| 6364 | 25.1 |
| 6365 | 25.1 |
| 6366 | 25.1 |
| 6367 | 25.1 |
| 6368 | 25.1 |
| 6369 | 25.1 |
| 6370 | 25.1 |
| 6371 | 25.1 |
| 6372 | 25.1 |
| 6373 | 24.6 |
| 6374 | 24.6 |
| 6375 | 24.6 |
| 6376 | 24.6 |
| 6377 | 25.1 |
| 6378 | 25.1 |
| 6379 | 25.1 |
| 6380 | 25.1 |
| 6381 | 25.1 |
| 6382 | 25.1 |
| 6383 | 24.6 |
| 6384 | 24.6 |
| 6385 | 24.6 |
| 6386 | 24.6 |
| 6387 | 24.1 |
| 6388 | 24.1 |
| 6389 | 24.1 |
| 6390 | 24.1 |
| 6391 | 24.1 |
| 6392 | 24.1 |
| 6393 | 23.6 |
| 6394 | 23.6 |
| 6395 | 23.099 |
| 6396 | 23.099 |
| 6397 | 23.099 |
| 6398 | 22.599 |
| 6399 | 22.099 |
| 6400 | 22.099 |
| 6401 | 21.099 |
| 6402 | 21.599 |
| 6403 | 22.099 |
| 6404 | 22.599 |
| 6405 | 22.599 |
| 6406 | 22.099 |
| 6407 | 22.099 |
| 6408 | 22.099 |
| 6409 | 22.099 |
| 6410 | 22.099 |
| 6411 | 21.599 |
| 6412 | 21.599 |
| 6413 | 21.599 |
| 6414 | 22.099 |
| 6415 | 22.599 |
| 6416 | 22.599 |
| 6417 | 22.599 |
| 6418 | 22.099 |
| 6419 | 21.599 |
| 6420 | 21.099 |
| 6421 | 21.099 |
| 6422 | 21.099 |
| 6423 | 20.598 |
| 6424 | 20.098 |
| 6425 | 20.098 |
| 6426 | 20.098 |
| 6427 | 21.099 |
| 6428 | 21.599 |
| 6429 | 21.099 |
| 6430 | 20.098 |
| 6431 | 20.098 |
| 6432 | 20.598 |
| 6433 | 21.099 |
| 6434 | 20.598 |
| 6435 | 20.598 |
| 6436 | 20.598 |
| 6437 | 20.098 |
| 6438 | 20.098 |
| 6439 | 21.599 |
| 6440 | 22.099 |
| 6441 | 22.099 |
| 6442 | 22.099 |
| 6443 | 21.599 |
| 6444 | 20.598 |
| 6445 | 19.597 |
| 6446 | 19.597 |
| 6447 | 19.097 |
| 6448 | 19.597 |
| 6449 | 19.597 |
| 6450 | 20.598 |
| 6451 | 21.599 |
| 6452 | 22.599 |
| 6453 | 22.599 |
| 6454 | 23.099 |
| 6455 | 22.099 |
| 6456 | 21.099 |
| 6457 | 20.598 |
| 6458 | 20.598 |
| 6459 | 20.598 |
| 6460 | 20.598 |
| 6461 | 20.598 |
| 6462 | 20.598 |
| 6463 | 22.099 |
| 6464 | 22.599 |
| 6465 | 22.599 |
| 6466 | 23.099 |
| 6467 | 22.599 |
| 6468 | 22.099 |
| 6469 | 21.099 |
| 6470 | 20.598 |
| 6471 | 20.098 |
| 6472 | 20.598 |
| 6473 | 20.598 |
| 6474 | 21.099 |
| 6475 | 22.599 |
| 6476 | 22.599 |
| 6477 | 23.099 |
| 6478 | 23.099 |
| 6479 | 23.099 |
| 6480 | 22.599 |
| 6481 | 21.599 |
| 6482 | 21.599 |
| 6483 | 21.599 |
| 6484 | 21.599 |
| 6485 | 21.599 |
| 6486 | 22.099 |
| 6487 | 22.599 |
| 6488 | 22.599 |
| 6489 | 23.099 |
| 6490 | 22.599 |
| 6491 | 22.599 |
| 6492 | 22.599 |
| 6493 | 22.099 |
| 6494 | 21.099 |
| 6495 | 21.099 |
| 6496 | 21.099 |
| 6497 | 21.099 |
| 6498 | 21.599 |
| 6499 | 21.599 |
| 6500 | 22.099 |
| 6501 | 22.099 |
| 6502 | 22.099 |
| 6503 | 22.099 |
| 6504 | 22.099 |
| 6505 | 22.099 |
| 6506 | 21.599 |
| 6507 | 21.599 |
| 6508 | 21.599 |
| 6509 | 21.599 |
| 6510 | 21.599 |
| 6511 | 21.599 |
| 6512 | 22.099 |
| 6513 | 22.099 |
| 6514 | 22.099 |
| 6515 | 22.099 |
| 6516 | 21.599 |
| 6517 | 21.599 |
| 6518 | 21.099 |
| 6519 | 21.099 |
| 6520 | 20.598 |
| 6521 | 20.598 |
| 6522 | 20.598 |
| 6523 | 20.598 |
| 6524 | 20.598 |
| 6525 | 21.099 |
| 6526 | 21.099 |
| 6527 | 21.099 |
| 6528 | 21.099 |
| 6529 | 21.099 |
| 6530 | 21.099 |
| 6531 | 21.099 |
| 6532 | 20.598 |
| 6533 | 20.598 |
| 6534 | 20.598 |
| 6535 | 20.098 |
| 6536 | 20.098 |
| 6537 | 20.598 |
| 6538 | 21.099 |
| 6539 | 21.099 |
| 6540 | 20.098 |
| 6541 | 20.598 |
| 6542 | 20.598 |
| 6543 | 20.598 |
| 6544 | 20.098 |
| 6545 | 20.098 |
| 6546 | 20.098 |
| 6547 | 20.098 |
| 6548 | 20.598 |
| 6549 | 20.598 |
| 6550 | 20.598 |
| 6551 | 20.598 |
| 6552 | 20.098 |
| 6553 | 20.098 |
| 6554 | 20.098 |
| 6555 | 19.597 |
| 6556 | 19.597 |
| 6557 | 19.597 |
| 6558 | 19.097 |
| 6559 | 19.097 |
| 6560 | 19.097 |
| 6561 | 18.596 |
| 6562 | 18.596 |
| 6563 | 18.096 |
| 6564 | 18.096 |
| 6565 | 18.096 |
| 6566 | 17.595 |
| 6567 | 17.595 |
| 6568 | 17.095 |
| 6569 | 17.095 |
| 6570 | 17.095 |
| 6571 | 17.095 |
| 6572 | 17.095 |
| 6573 | 17.595 |
| 6574 | 17.595 |
| 6575 | 17.595 |
| 6576 | 17.595 |
| 6577 | 17.595 |
| 6578 | 17.595 |
| 6579 | 17.595 |
| 6580 | 17.595 |
| 6581 | 17.595 |
| 6582 | 17.095 |
| 6583 | 17.095 |
| 6584 | 17.095 |
| 6585 | 17.095 |
| 6586 | 16.594 |
| 6587 | 17.095 |
| 6588 | 17.095 |
| 6589 | 16.594 |
| 6590 | 16.594 |
| 6591 | 17.095 |
| 6592 | 16.594 |
| 6593 | 16.594 |
| 6594 | 16.594 |
| 6595 | 16.594 |
| 6596 | 17.095 |
| 6597 | 17.095 |
| 6598 | 17.095 |
| 6599 | 17.095 |
| 6600 | 17.595 |
| 6601 | 18.096 |
| 6602 | 18.596 |
| 6603 | 18.596 |
| 6604 | 18.596 |
| 6605 | 18.596 |
| 6606 | 18.096 |
| 6607 | 18.096 |
| 6608 | 17.595 |
| 6609 | 17.095 |
| 6610 | 17.095 |
| 6611 | 17.595 |
| 6612 | 17.095 |
| 6613 | 17.595 |
| 6614 | 17.595 |
| 6615 | 18.096 |
| 6616 | 18.596 |
| 6617 | 18.596 |
| 6618 | 18.596 |
| 6619 | 18.596 |
| 6620 | 18.596 |
| 6621 | 18.096 |
| 6622 | 18.096 |
| 6623 | 18.096 |
| 6624 | 18.096 |
| 6625 | 18.596 |
| 6626 | 18.596 |
| 6627 | 18.596 |
| 6628 | 18.596 |
| 6629 | 18.596 |
| 6630 | 18.596 |
| 6631 | 18.596 |
| 6632 | 18.096 |
| 6633 | 18.096 |
| 6634 | 18.096 |
| 6635 | 18.096 |
| 6636 | 17.595 |
| 6637 | 18.096 |
| 6638 | 18.096 |
| 6639 | 18.596 |
| 6640 | 19.097 |
| 6641 | 19.097 |
| 6642 | 19.097 |
| 6643 | 19.597 |
| 6644 | 19.097 |
| 6645 | 19.097 |
| 6646 | 18.596 |
| 6647 | 18.596 |
| 6648 | 18.596 |
| 6649 | 19.097 |
| 6650 | 19.097 |
| 6651 | 19.097 |
| 6652 | 19.097 |
| 6653 | 19.597 |
| 6654 | 19.097 |
| 6655 | 19.097 |
| 6656 | 19.097 |
| 6657 | 18.596 |
| 6658 | 18.596 |
| 6659 | 18.596 |
| 6660 | 18.596 |
| 6661 | 18.596 |
| 6662 | 18.596 |
| 6663 | 19.097 |
| 6664 | 19.097 |
| 6665 | 19.097 |
| 6666 | 19.097 |
| 6667 | 19.097 |
| 6668 | 19.097 |
| 6669 | 19.097 |
| 6670 | 19.097 |
| 6671 | 19.097 |
| 6672 | 19.097 |
| 6673 | 19.097 |
| 6674 | 19.097 |
| 6675 | 19.097 |
| 6676 | 19.097 |
| 6677 | 19.097 |
| 6678 | 19.097 |
| 6679 | 19.097 |
| 6680 | 19.097 |
| 6681 | 19.097 |
| 6682 | 19.097 |
| 6683 | 18.596 |
| 6684 | 18.596 |
| 6685 | 18.596 |
| 6686 | 18.596 |
| 6687 | 18.596 |
| 6688 | 19.097 |
| 6689 | 19.097 |
| 6690 | 19.097 |
| 6691 | 19.097 |
| 6692 | 19.097 |
| 6693 | 19.597 |
| 6694 | 19.097 |
| 6695 | 19.097 |
| 6696 | 19.597 |
| 6697 | 19.597 |
| 6698 | 19.597 |
| 6699 | 19.597 |
| 6700 | 19.597 |
| 6701 | 19.597 |
| 6702 | 19.597 |
| 6703 | 19.597 |
| 6704 | 19.597 |
| 6705 | 19.597 |
| 6706 | 19.097 |
| 6707 | 19.097 |
| 6708 | 19.097 |
| 6709 | 19.097 |
| 6710 | 19.097 |
| 6711 | 19.097 |
| 6712 | 19.097 |
| 6713 | 19.597 |
| 6714 | 19.597 |
| 6715 | 19.597 |
| 6716 | 19.597 |
| 6717 | 19.597 |
| 6718 | 19.597 |
| 6719 | 19.597 |
| 6720 | 19.597 |
| 6721 | 20.098 |
| 6722 | 20.098 |
| 6723 | 20.098 |
| 6724 | 20.098 |
| 6725 | 19.597 |
| 6726 | 19.597 |
| 6727 | 19.597 |
| 6728 | 19.597 |
| 6729 | 19.597 |
| 6730 | 19.597 |
| 6731 | 19.597 |
| 6732 | 19.597 |
| 6733 | 19.597 |
| 6734 | 19.597 |
| 6735 | 19.597 |
| 6736 | 19.597 |
| 6737 | 19.597 |
| 6738 | 19.597 |
| 6739 | 20.098 |
| 6740 | 20.098 |
| 6741 | 20.098 |
| 6742 | 20.098 |
| 6743 | 20.098 |
| 6744 | 20.098 |
| 6745 | 20.098 |
| 6746 | 20.598 |
| 6747 | 20.098 |
| 6748 | 20.598 |
| 6749 | 20.098 |
| 6750 | 20.098 |
| 6751 | 20.098 |
| 6752 | 20.098 |
| 6753 | 20.098 |
| 6754 | 20.098 |
| 6755 | 20.098 |
| 6756 | 20.098 |
| 6757 | 20.098 |
| 6758 | 20.098 |
| 6759 | 19.597 |
| 6760 | 19.597 |
| 6761 | 19.597 |
| 6762 | 19.597 |
| 6763 | 20.098 |
| 6764 | 20.098 |
| 6765 | 20.098 |
| 6766 | 20.098 |
| 6767 | 20.098 |
| 6768 | 20.598 |
| 6769 | 20.598 |
| 6770 | 20.598 |
| 6771 | 20.598 |
| 6772 | 20.598 |
| 6773 | 20.598 |
| 6774 | 20.098 |
| 6775 | 20.098 |
| 6776 | 20.098 |
| 6777 | 20.098 |
| 6778 | 20.098 |
| 6779 | 20.098 |
| 6780 | 20.098 |
| 6781 | 20.098 |
| 6782 | 20.098 |
| 6783 | 20.098 |
| 6784 | 19.597 |
| 6785 | 19.597 |
| 6786 | 19.597 |
| 6787 | 20.098 |
| 6788 | 20.098 |
| 6789 | 20.098 |
| 6790 | 20.098 |
| 6791 | 20.098 |
| 6792 | 20.098 |
| 6793 | 20.098 |
| 6794 | 20.098 |
| 6795 | 20.098 |
| 6796 | 20.098 |
| 6797 | 20.598 |
| 6798 | 20.098 |
| 6799 | 20.098 |
| 6800 | 20.098 |
| 6801 | 20.098 |
| 6802 | 20.098 |
| 6803 | 20.098 |
| 6804 | 20.098 |
| 6805 | 20.098 |
| 6806 | 20.098 |
| 6807 | 20.098 |
| 6808 | 20.098 |
| 6809 | 20.098 |
| 6810 | 20.098 |
| 6811 | 20.098 |
| 6812 | 20.098 |
| 6813 | 20.098 |
| 6814 | 20.098 |
| 6815 | 20.098 |
| 6816 | 20.598 |
| 6817 | 20.598 |
| 6818 | 20.598 |
| 6819 | 20.598 |
| 6820 | 20.598 |
| 6821 | 20.598 |
| 6822 | 20.598 |
| 6823 | 20.598 |
| 6824 | 20.098 |
| 6825 | 20.098 |
| 6826 | 20.098 |
| 6827 | 20.098 |
| 6828 | 20.098 |
| 6829 | 20.098 |
| 6830 | 20.098 |
| 6831 | 20.098 |
| 6832 | 20.098 |
| 6833 | 20.098 |
| 6834 | 20.098 |
| 6835 | 20.098 |
| 6836 | 20.098 |
| 6837 | 20.098 |
| 6838 | 20.098 |
| 6839 | 20.098 |
| 6840 | 20.598 |
| 6841 | 20.598 |
| 6842 | 20.598 |
| 6843 | 20.598 |
| 6844 | 20.598 |
| 6845 | 20.598 |
| 6846 | 20.598 |
| 6847 | 20.598 |
| 6848 | 20.598 |
| 6849 | 20.098 |
| 6850 | 20.098 |
| 6851 | 20.098 |
| 6852 | 20.098 |
| 6853 | 20.098 |
| 6854 | 20.098 |
| 6855 | 20.098 |
| 6856 | 20.098 |
| 6857 | 20.098 |
| 6858 | 20.098 |
| 6859 | 20.098 |
| 6860 | 20.098 |
| 6861 | 20.098 |
| 6862 | 20.098 |
| 6863 | 20.098 |
| 6864 | 20.098 |
| 6865 | 20.098 |
| 6866 | 20.598 |
| 6867 | 20.598 |
| 6868 | 20.598 |
| 6869 | 20.598 |
| 6870 | 20.598 |
| 6871 | 20.098 |
| 6872 | 20.098 |
| 6873 | 20.098 |
| 6874 | 20.098 |
| 6875 | 20.098 |
| 6876 | 20.098 |
| 6877 | 19.597 |
| 6878 | 19.597 |
| 6879 | 19.597 |
| 6880 | 19.597 |
| 6881 | 20.098 |
| 6882 | 19.597 |
| 6883 | 20.098 |
| 6884 | 20.098 |
| 6885 | 20.098 |
| 6886 | 20.098 |
| 6887 | 20.098 |
| 6888 | 20.098 |
| 6889 | 20.098 |
| 6890 | 20.098 |
| 6891 | 20.098 |
| 6892 | 20.098 |
| 6893 | 20.098 |
| 6894 | 20.098 |
| 6895 | 20.098 |
| 6896 | 20.098 |
| 6897 | 20.098 |
| 6898 | 19.597 |
| 6899 | 19.597 |
| 6900 | 19.597 |
| 6901 | 19.597 |
| 6902 | 19.597 |
| 6903 | 19.597 |
| 6904 | 19.597 |
| 6905 | 19.597 |
| 6906 | 19.597 |
| 6907 | 19.597 |
| 6908 | 19.597 |
| 6909 | 19.597 |
| 6910 | 19.597 |
| 6911 | 19.597 |
| 6912 | 20.098 |
| 6913 | 20.098 |
| 6914 | 20.098 |
| 6915 | 20.098 |
| 6916 | 20.098 |
| 6917 | 20.098 |
| 6918 | 20.098 |
| 6919 | 20.098 |
| 6920 | 19.597 |
| 6921 | 19.597 |
| 6922 | 19.597 |
| 6923 | 19.597 |
| 6924 | 19.597 |
| 6925 | 19.597 |
| 6926 | 19.597 |
| 6927 | 19.597 |
| 6928 | 19.597 |
| 6929 | 19.597 |
| 6930 | 19.597 |
| 6931 | 19.597 |
| 6932 | 19.597 |
| 6933 | 19.597 |
| 6934 | 19.597 |
| 6935 | 19.597 |
| 6936 | 19.597 |
| 6937 | 19.597 |
| 6938 | 19.597 |
| 6939 | 19.597 |
| 6940 | 19.597 |
| 6941 | 19.597 |
| 6942 | 19.597 |
| 6943 | 19.597 |
| 6944 | 19.597 |
| 6945 | 19.597 |
| 6946 | 19.597 |
| 6947 | 19.597 |
| 6948 | 19.597 |
| 6949 | 19.597 |
| 6950 | 19.597 |
| 6951 | 19.597 |
| 6952 | 19.597 |
| 6953 | 19.597 |
| 6954 | 19.597 |
| 6955 | 19.597 |
| 6956 | 19.597 |
| 6957 | 19.597 |
| 6958 | 19.597 |
| 6959 | 19.597 |
| 6960 | 19.597 |
| 6961 | 19.597 |
| 6962 | 19.597 |
| 6963 | 19.597 |
| 6964 | 19.597 |
| 6965 | 19.597 |
| 6966 | 19.597 |
| 6967 | 19.597 |
| 6968 | 19.597 |
| 6969 | 19.597 |
| 6970 | 19.597 |
| 6971 | 19.597 |
| 6972 | 19.097 |
| 6973 | 19.097 |
| 6974 | 19.597 |
| 6975 | 19.597 |
| 6976 | 19.597 |
| 6977 | 19.597 |
| 6978 | 19.597 |
| 6979 | 19.597 |
| 6980 | 19.597 |
| 6981 | 19.597 |
| 6982 | 19.597 |
| 6983 | 19.597 |
| 6984 | 19.597 |
| 6985 | 20.098 |
| 6986 | 19.597 |
| 6987 | 19.597 |
| 6988 | 19.597 |
| 6989 | 19.597 |
| 6990 | 19.597 |
| 6991 | 19.597 |
| 6992 | 19.597 |
| 6993 | 19.597 |
| 6994 | 19.597 |
| 6995 | 19.597 |
| 6996 | 19.597 |
| 6997 | 19.097 |
| 6998 | 19.597 |
| 6999 | 19.597 |
| 7000 | 19.597 |
| 7001 | 19.597 |
| 7002 | 19.597 |
| 7003 | 19.597 |
| 7004 | 19.597 |
| 7005 | 19.597 |
| 7006 | 19.597 |
| 7007 | 19.597 |
| 7008 | 19.597 |
| 7009 | 19.597 |
| 7010 | 19.597 |
| 7011 | 19.597 |
| 7012 | 19.597 |
| 7013 | 19.597 |
| 7014 | 19.597 |
| 7015 | 19.597 |
| 7016 | 19.597 |
| 7017 | 19.597 |
| 7018 | 19.097 |
| 7019 | 19.097 |
| 7020 | 19.097 |
| 7021 | 19.097 |
| 7022 | 19.097 |
| 7023 | 19.597 |
| 7024 | 19.597 |
| 7025 | 19.597 |
| 7026 | 19.597 |
| 7027 | 19.597 |
| 7028 | 19.597 |
| 7029 | 19.597 |
| 7030 | 19.597 |
| 7031 | 19.597 |
| 7032 | 19.097 |
| 7033 | 19.097 |
| 7034 | 19.097 |
| 7035 | 19.097 |
| 7036 | 19.097 |
| 7037 | 18.596 |
| 7038 | 18.596 |
| 7039 | 18.596 |
| 7040 | 18.596 |
| 7041 | 18.096 |
| 7042 | 18.096 |
| 7043 | 18.096 |
| 7044 | 17.595 |
| 7045 | 17.595 |
| 7046 | 17.595 |
| 7047 | 17.095 |
| 7048 | 17.095 |
| 7049 | 18.096 |
| 7050 | 18.096 |
| 7051 | 18.596 |
| 7052 | 18.596 |
| 7053 | 18.096 |
| 7054 | 17.595 |
| 7055 | 17.595 |
| 7056 | 17.595 |
| 7057 | 17.595 |
| 7058 | 17.595 |
| 7059 | 17.095 |
| 7060 | 17.595 |
| 7061 | 17.595 |
| 7062 | 18.096 |
| 7063 | 17.595 |
| 7064 | 17.595 |
| 7065 | 17.095 |
| 7066 | 17.095 |
| 7067 | 17.095 |
| 7068 | 16.594 |
| 7069 | 16.594 |
| 7070 | 16.594 |
| 7071 | 16.093 |
| 7072 | 16.093 |
| 7073 | 17.095 |
| 7074 | 17.595 |
| 7075 | 18.096 |
| 7076 | 18.096 |
| 7077 | 18.096 |
| 7078 | 18.096 |
| 7079 | 17.095 |
| 7080 | 17.095 |
| 7081 | 17.095 |
| 7082 | 17.095 |
| 7083 | 17.095 |
| 7084 | 17.095 |
| 7085 | 17.595 |
| 7086 | 18.096 |
| 7087 | 18.596 |
| 7088 | 18.096 |
| 7089 | 18.096 |
| 7090 | 17.595 |
| 7091 | 16.594 |
| 7092 | 16.594 |
| 7093 | 16.594 |
| 7094 | 16.594 |
| 7095 | 16.594 |
| 7096 | 17.095 |
| 7097 | 18.096 |
| 7098 | 18.096 |
| 7099 | 18.596 |
| 7100 | 18.596 |
| 7101 | 18.596 |
| 7102 | 18.596 |
| 7103 | 17.595 |
| 7104 | 17.595 |
| 7105 | 17.595 |
| 7106 | 17.595 |
| 7107 | 17.595 |
| 7108 | 17.595 |
| 7109 | 17.595 |
| 7110 | 18.596 |
| 7111 | 18.596 |
| 7112 | 18.596 |
| 7113 | 18.596 |
| 7114 | 18.596 |
| 7115 | 17.595 |
| 7116 | 17.595 |
| 7117 | 17.095 |
| 7118 | 17.595 |
| 7119 | 17.595 |
| 7120 | 17.595 |
| 7121 | 18.596 |
| 7122 | 18.596 |
| 7123 | 19.097 |
| 7124 | 19.097 |
| 7125 | 19.097 |
| 7126 | 19.097 |
| 7127 | 18.096 |
| 7128 | 18.096 |
| 7129 | 18.096 |
| 7130 | 18.096 |
| 7131 | 18.096 |
| 7132 | 18.096 |
| 7133 | 18.096 |
| 7134 | 18.596 |
| 7135 | 18.596 |
| 7136 | 18.596 |
| 7137 | 18.596 |
| 7138 | 18.596 |
| 7139 | 18.596 |
| 7140 | 18.096 |
| 7141 | 18.096 |
| 7142 | 17.595 |
| 7143 | 18.096 |
| 7144 | 18.096 |
| 7145 | 18.096 |
| 7146 | 18.096 |
| 7147 | 18.596 |
| 7148 | 18.596 |
| 7149 | 18.596 |
| 7150 | 18.596 |
| 7151 | 18.096 |
| 7152 | 18.096 |
| 7153 | 18.096 |
| 7154 | 18.096 |
| 7155 | 18.096 |
| 7156 | 18.096 |
| 7157 | 17.595 |
| 7158 | 17.595 |
| 7159 | 18.096 |
| 7160 | 18.096 |
| 7161 | 18.096 |
| 7162 | 18.096 |
| 7163 | 18.096 |
| 7164 | 18.096 |
| 7165 | 18.096 |
| 7166 | 17.595 |
| 7167 | 17.595 |
| 7168 | 17.595 |
| 7169 | 18.096 |
| 7170 | 18.096 |
| 7171 | 18.096 |
| 7172 | 18.096 |
| 7173 | 18.596 |
| 7174 | 18.596 |
| 7175 | 18.596 |
| 7176 | 18.096 |
| 7177 | 18.096 |
| 7178 | 18.096 |
| 7179 | 18.096 |
| 7180 | 18.096 |
| 7181 | 18.096 |
| 7182 | 18.096 |
| 7183 | 18.096 |
| 7184 | 18.596 |
| 7185 | 18.596 |
| 7186 | 18.596 |
| 7187 | 18.596 |
| 7188 | 18.596 |
| 7189 | 18.596 |
| 7190 | 18.596 |
| 7191 | 18.596 |
| 7192 | 18.096 |
| 7193 | 18.096 |
| 7194 | 18.596 |
| 7195 | 18.596 |
| 7196 | 18.596 |
| 7197 | 18.596 |
| 7198 | 18.596 |
| 7199 | 18.596 |
| 7200 | 18.596 |
| 7201 | 18.596 |
| 7202 | 18.596 |
| 7203 | 18.596 |
| 7204 | 18.096 |
| 7205 | 18.596 |
| 7206 | 18.096 |
| 7207 | 18.096 |
| 7208 | 18.096 |
| 7209 | 18.096 |
| 7210 | 18.096 |
| 7211 | 18.096 |
| 7212 | 18.096 |
| 7213 | 18.096 |
| 7214 | 18.096 |
| 7215 | 18.096 |
| 7216 | 18.096 |
| 7217 | 17.595 |
| 7218 | 18.096 |
| 7219 | 18.096 |
| 7220 | 18.096 |
| 7221 | 18.596 |
| 7222 | 18.596 |
| 7223 | 18.596 |
| 7224 | 18.596 |
| 7225 | 18.596 |
| 7226 | 18.596 |
| 7227 | 18.596 |
| 7228 | 18.596 |
| 7229 | 18.596 |
| 7230 | 18.596 |
| 7231 | 18.596 |
| 7232 | 18.096 |
| 7233 | 18.096 |
| 7234 | 18.096 |
| 7235 | 18.096 |
| 7236 | 18.096 |
| 7237 | 18.096 |
| 7238 | 17.595 |
| 7239 | 17.595 |
| 7240 | 17.595 |
| 7241 | 17.595 |
| 7242 | 17.595 |
| 7243 | 17.595 |
| 7244 | 17.595 |
| 7245 | 17.595 |
| 7246 | 18.096 |
| 7247 | 18.096 |
| 7248 | 18.096 |
| 7249 | 18.596 |
| 7250 | 18.096 |
| 7251 | 18.096 |
| 7252 | 18.096 |
| 7253 | 18.096 |
| 7254 | 18.096 |
| 7255 | 17.595 |
| 7256 | 17.595 |
| 7257 | 17.595 |
| 7258 | 17.595 |
| 7259 | 17.595 |
| 7260 | 17.095 |
| 7261 | 17.095 |
| 7262 | 17.095 |
| 7263 | 17.095 |
| 7264 | 17.095 |
| 7265 | 17.095 |
| 7266 | 17.095 |
| 7267 | 17.095 |
| 7268 | 17.095 |
| 7269 | 17.095 |
| 7270 | 18.096 |
| 7271 | 18.096 |
| 7272 | 18.096 |
| 7273 | 18.096 |
| 7274 | 18.096 |
| 7275 | 18.096 |
| 7276 | 17.595 |
| 7277 | 17.595 |
| 7278 | 17.595 |
| 7279 | 17.095 |
| 7280 | 17.095 |
| 7281 | 17.095 |
| 7282 | 17.095 |
| 7283 | 17.095 |
| 7284 | 17.095 |
| 7285 | 16.594 |
| 7286 | 16.594 |
| 7287 | 17.095 |
| 7288 | 17.095 |
| 7289 | 17.095 |
| 7290 | 17.095 |
| 7291 | 17.095 |
| 7292 | 17.095 |
| 7293 | 17.595 |
| 7294 | 17.595 |
| 7295 | 17.595 |
| 7296 | 17.595 |
| 7297 | 17.595 |
| 7298 | 17.595 |
| 7299 | 17.095 |
| 7300 | 17.095 |
| 7301 | 17.095 |
| 7302 | 17.095 |
| 7303 | 17.095 |
| 7304 | 17.095 |
| 7305 | 17.095 |
| 7306 | 17.095 |
| 7307 | 16.594 |
| 7308 | 16.594 |
| 7309 | 16.594 |
| 7310 | 16.594 |
| 7311 | 16.594 |
| 7312 | 16.594 |
| 7313 | 17.095 |
| 7314 | 17.095 |
| 7315 | 17.095 |
| 7316 | 17.095 |
| 7317 | 16.594 |
| 7318 | 16.594 |
| 7319 | 16.594 |
| 7320 | 16.594 |
| 7321 | 16.594 |
| 7322 | 16.594 |
| 7323 | 16.594 |
| 7324 | 16.594 |
| 7325 | 16.594 |
| 7326 | 16.594 |
| 7327 | 16.594 |
| 7328 | 16.594 |
| 7329 | 16.594 |
| 7330 | 16.594 |
| 7331 | 16.594 |
| 7332 | 16.093 |
| 7333 | 16.093 |
| 7334 | 16.093 |
| 7335 | 17.095 |
| 7336 | 17.095 |
| 7337 | 17.095 |
| 7338 | 17.095 |
| 7339 | 17.095 |
| 7340 | 16.594 |
| 7341 | 16.594 |
| 7342 | 16.594 |
| 7343 | 16.594 |
| 7344 | 17.095 |
| 7345 | 17.095 |
| 7346 | 17.095 |
| 7347 | 16.594 |
| 7348 | 16.594 |
| 7349 | 16.594 |
| 7350 | 16.594 |
| 7351 | 17.095 |
| 7352 | 17.095 |
| 7353 | 16.594 |
| 7354 | 16.594 |
| 7355 | 16.594 |
| 7356 | 16.594 |
| 7357 | 16.594 |
| 7358 | 17.095 |
| 7359 | 17.095 |
| 7360 | 17.595 |
| 7361 | 17.595 |
| 7362 | 17.595 |
| 7363 | 17.595 |
| 7364 | 17.095 |
| 7365 | 17.095 |
| 7366 | 17.095 |
| 7367 | 17.095 |
| 7368 | 17.095 |
| 7369 | 17.095 |
| 7370 | 17.095 |
| 7371 | 17.095 |
| 7372 | 17.095 |
| 7373 | 17.095 |
| 7374 | 17.095 |
| 7375 | 17.095 |
| 7376 | 17.095 |
| 7377 | 17.095 |
| 7378 | 17.095 |
| 7379 | 17.095 |
| 7380 | 17.095 |
| 7381 | 17.095 |
| 7382 | 16.594 |
| 7383 | 16.594 |
| 7384 | 17.095 |
| 7385 | 17.095 |
| 7386 | 17.095 |
| 7387 | 17.095 |
| 7388 | 17.095 |
| 7389 | 17.095 |
| 7390 | 17.095 |
| 7391 | 17.095 |
| 7392 | 17.095 |
| 7393 | 17.095 |
| 7394 | 17.095 |
| 7395 | 17.095 |
| 7396 | 17.095 |
| 7397 | 17.595 |
| 7398 | 17.595 |
| 7399 | 17.595 |
| 7400 | 17.595 |
| 7401 | 17.595 |
| 7402 | 17.095 |
| 7403 | 17.095 |
| 7404 | 17.095 |
| 7405 | 17.095 |
| 7406 | 17.095 |
| 7407 | 17.095 |
| 7408 | 17.095 |
| 7409 | 17.095 |
| 7410 | 17.095 |
| 7411 | 17.595 |
| 7412 | 17.595 |
| 7413 | 17.595 |
| 7414 | 17.095 |
| 7415 | 17.095 |
| 7416 | 17.595 |
| 7417 | 17.595 |
| 7418 | 17.595 |
| 7419 | 17.095 |
| 7420 | 17.095 |
| 7421 | 17.095 |
| 7422 | 17.095 |
| 7423 | 17.095 |
| 7424 | 17.095 |
| 7425 | 17.095 |
| 7426 | 17.095 |
| 7427 | 17.095 |
| 7428 | 17.095 |
| 7429 | 17.095 |
| 7430 | 17.095 |
| 7431 | 17.095 |
| 7432 | 17.095 |
| 7433 | 17.095 |
| 7434 | 17.095 |
| 7435 | 17.095 |
| 7436 | 17.095 |
| 7437 | 17.095 |
| 7438 | 17.095 |
| 7439 | 17.595 |
| 7440 | 17.595 |
| 7441 | 17.595 |
| 7442 | 17.595 |
| 7443 | 17.595 |
| 7444 | 17.595 |
| 7445 | 17.595 |
| 7446 | 17.595 |
| 7447 | 17.595 |
| 7448 | 17.595 |
| 7449 | 17.595 |
| 7450 | 17.595 |
| 7451 | 17.595 |
| 7452 | 17.595 |
| 7453 | 17.595 |
| 7454 | 17.095 |
| 7455 | 17.095 |
| 7456 | 17.095 |
| 7457 | 17.595 |
| 7458 | 17.595 |
| 7459 | 17.595 |
| 7460 | 17.595 |
| 7461 | 17.595 |
| 7462 | 17.595 |
| 7463 | 17.595 |
| 7464 | 17.595 |
| 7465 | 17.095 |
| 7466 | 17.095 |
| 7467 | 17.095 |
| 7468 | 17.095 |
| 7469 | 17.095 |
| 7470 | 17.595 |
| 7471 | 17.595 |
| 7472 | 17.595 |
| 7473 | 17.595 |
| 7474 | 17.595 |
| 7475 | 17.095 |
| 7476 | 17.095 |
| 7477 | 17.095 |
| 7478 | 17.095 |
| 7479 | 17.095 |
| 7480 | 17.095 |
| 7481 | 17.595 |
| 7482 | 17.595 |
| 7483 | 18.096 |
| 7484 | 17.595 |
| 7485 | 17.595 |
| 7486 | 17.595 |
| 7487 | 17.595 |
| 7488 | 17.095 |
| 7489 | 17.095 |
| 7490 | 17.095 |
| 7491 | 17.095 |
| 7492 | 17.095 |
| 7493 | 17.095 |
| 7494 | 17.595 |
| 7495 | 17.595 |
| 7496 | 17.595 |
| 7497 | 17.595 |
| 7498 | 17.595 |
| 7499 | 17.595 |
| 7500 | 17.095 |
| 7501 | 17.095 |
| 7502 | 17.095 |
| 7503 | 16.594 |
| 7504 | 17.095 |
| 7505 | 17.595 |
| 7506 | 17.595 |
| 7507 | 17.595 |
| 7508 | 17.595 |
| 7509 | 18.096 |
| 7510 | 18.096 |
| 7511 | 17.595 |
| 7512 | 17.095 |
| 7513 | 17.095 |
| 7514 | 17.095 |
| 7515 | 17.095 |
| 7516 | 17.095 |
| 7517 | 16.594 |
| 7518 | 17.095 |
| 7519 | 17.095 |
| 7520 | 17.595 |
| 7521 | 17.595 |
| 7522 | 17.595 |
| 7523 | 17.095 |
| 7524 | 17.095 |
| 7525 | 16.594 |
| 7526 | 16.594 |
| 7527 | 16.594 |
| 7528 | 16.594 |
| 7529 | 16.594 |
| 7530 | 17.095 |
| 7531 | 17.095 |
| 7532 | 17.095 |
| 7533 | 17.095 |
| 7534 | 17.095 |
| 7535 | 17.095 |
| 7536 | 17.095 |
| 7537 | 17.095 |
| 7538 | 17.095 |
| 7539 | 17.095 |
| 7540 | 17.095 |
| 7541 | 16.594 |
| 7542 | 16.594 |
| 7543 | 16.594 |
| 7544 | 17.095 |
| 7545 | 17.595 |
| 7546 | 17.595 |
| 7547 | 17.095 |
| 7548 | 17.095 |
| 7549 | 16.594 |
| 7550 | 16.594 |
| 7551 | 16.594 |
| 7552 | 16.594 |
| 7553 | 16.594 |
| 7554 | 16.594 |
| 7555 | 17.095 |
| 7556 | 17.095 |
| 7557 | 17.095 |
| 7558 | 17.095 |
| 7559 | 17.095 |
| 7560 | 16.594 |
| 7561 | 16.594 |
| 7562 | 16.594 |
| 7563 | 16.594 |
| 7564 | 16.594 |
| 7565 | 16.093 |
| 7566 | 16.093 |
| 7567 | 16.093 |
| 7568 | 16.594 |
| 7569 | 17.095 |
| 7570 | 17.595 |
| 7571 | 17.095 |
| 7572 | 17.095 |
| 7573 | 16.594 |
| 7574 | 16.594 |
| 7575 | 16.594 |
| 7576 | 16.093 |
| 7577 | 16.594 |
| 7578 | 16.594 |
| 7579 | 17.095 |
| 7580 | 17.095 |
| 7581 | 17.095 |
| 7582 | 17.095 |
| 7583 | 17.095 |
| 7584 | 17.095 |
| 7585 | 17.095 |
| 7586 | 16.594 |
| 7587 | 16.594 |
| 7588 | 16.093 |
| 7589 | 16.093 |
| 7590 | 16.093 |
| 7591 | 16.594 |
| 7592 | 16.594 |
| 7593 | 16.594 |
| 7594 | 17.095 |
| 7595 | 17.095 |
| 7596 | 17.095 |
| 7597 | 17.095 |
| 7598 | 17.095 |
| 7599 | 17.095 |
| 7600 | 16.594 |
| 7601 | 16.093 |
| 7602 | 16.594 |
| 7603 | 16.594 |
| 7604 | 16.594 |
| 7605 | 16.594 |
| 7606 | 16.594 |
| 7607 | 16.594 |
| 7608 | 16.594 |
| 7609 | 16.594 |
| 7610 | 16.594 |
| 7611 | 16.594 |
| 7612 | 16.594 |
| 7613 | 16.594 |
| 7614 | 16.594 |
| 7615 | 16.093 |
| 7616 | 16.093 |
| 7617 | 16.093 |
| 7618 | 16.594 |
| 7619 | 16.594 |
| 7620 | 16.594 |
| 7621 | 16.594 |
| 7622 | 16.594 |
| 7623 | 16.093 |
| 7624 | 15.593 |
| 7625 | 15.593 |
| 7626 | 15.593 |
| 7627 | 15.593 |
| 7628 | 16.093 |
| 7629 | 16.093 |
| 7630 | 16.093 |
| 7631 | 16.093 |
| 7632 | 16.093 |
| 7633 | 16.093 |
| 7634 | 16.093 |
| 7635 | 16.093 |
| 7636 | 15.593 |
| 7637 | 16.093 |
| 7638 | 16.093 |
| 7639 | 15.593 |
| 7640 | 15.593 |
| 7641 | 15.593 |
| 7642 | 15.593 |
| 7643 | 15.092 |
| 7644 | 15.092 |
| 7645 | 15.092 |
| 7646 | 15.092 |
| 7647 | 14.591 |
| 7648 | 15.092 |
| 7649 | 15.092 |
| 7650 | 15.092 |
| 7651 | 15.092 |
| 7652 | 15.092 |
| 7653 | 15.092 |
| 7654 | 14.591 |
| 7655 | 15.092 |
| 7656 | 15.092 |
| 7657 | 14.591 |
| 7658 | 14.591 |
| 7659 | 14.591 |
| 7660 | 14.591 |
| 7661 | 14.09 |
| 7662 | 14.09 |
| 7663 | 14.09 |
| 7664 | 14.09 |
| 7665 | 13.589 |
| 7666 | 13.589 |
| 7667 | 13.589 |
| 7668 | 13.589 |
| 7669 | 13.589 |
| 7670 | 13.088 |
| 7671 | 13.589 |
| 7672 | 13.088 |
| 7673 | 13.088 |
| 7674 | 13.088 |
| 7675 | 13.088 |
| 7676 | 13.088 |
| 7677 | 13.088 |
| 7678 | 12.587 |
| 7679 | 12.587 |
| 7680 | 12.587 |
| 7681 | 12.587 |
| 7682 | 12.587 |
| 7683 | 12.086 |
| 7684 | 12.086 |
| 7685 | 12.086 |
| 7686 | 12.086 |
| 7687 | 12.086 |
| 7688 | 11.585 |
| 7689 | 11.585 |
| 7690 | 11.585 |
| 7691 | 11.585 |
| 7692 | 11.084 |
| 7693 | 11.084 |
| 7694 | 11.084 |
| 7695 | 10.583 |
| 7696 | 10.583 |
| 7697 | 10.583 |
| 7698 | 11.084 |
| 7699 | 11.084 |
| 7700 | 11.084 |
| 7701 | 10.583 |
| 7702 | 10.583 |
| 7703 | 10.583 |
| 7704 | 10.583 |
| 7705 | 10.583 |
| 7706 | 10.082 |
| 7707 | 10.082 |
| 7708 | 10.082 |
| 7709 | 10.082 |
| 7710 | 10.082 |
| 7711 | 10.583 |
| 7712 | 10.082 |
| 7713 | 10.082 |
| 7714 | 10.082 |
| 7715 | 9.58 |
| 7716 | 9.58 |
| 7717 | 10.082 |
| 7718 | 10.082 |
| 7719 | 11.585 |
| 7720 | 12.086 |
| 7721 | 11.084 |
| 7722 | 11.084 |
| 7723 | 11.585 |
| 7724 | 10.583 |
| 7725 | 10.082 |
| 7726 | 9.58 |
| 7727 | 9.079 |
| 7728 | 9.079 |
| 7729 | 9.58 |
| 7730 | 9.079 |
| 7731 | 9.58 |
| 7732 | 11.585 |
| 7733 | 11.084 |
| 7734 | 10.583 |
| 7735 | 10.082 |
| 7736 | 9.58 |
| 7737 | 9.079 |
| 7738 | 9.079 |
| 7739 | 9.079 |
| 7740 | 9.079 |
| 7741 | 9.079 |
| 7742 | 9.079 |
| 7743 | 9.079 |
| 7744 | 9.079 |
| 7745 | 9.079 |
| 7746 | 8.578 |
| 7747 | 8.578 |
| 7748 | 8.076 |
| 7749 | 8.076 |
| 7750 | 7.575 |
| 7751 | 7.575 |
| 7752 | 7.575 |
| 7753 | 7.575 |
| 7754 | 8.076 |
| 7755 | 8.578 |
| 7756 | 10.082 |
| 7757 | 12.086 |
| 7758 | 12.587 |
| 7759 | 12.086 |
| 7760 | 12.086 |
| 7761 | 11.084 |
| 7762 | 10.082 |
| 7763 | 9.079 |
| 7764 | 8.578 |
| 7765 | 8.578 |
| 7766 | 9.58 |
| 7767 | 11.084 |
| 7768 | 12.086 |
| 7769 | 12.086 |
| 7770 | 12.587 |
| 7771 | 12.587 |
| 7772 | 12.587 |
| 7773 | 11.585 |
| 7774 | 10.082 |
| 7775 | 10.082 |
| 7776 | 9.58 |
| 7777 | 9.58 |
| 7778 | 9.58 |
| 7779 | 9.58 |
| 7780 | 12.086 |
| 7781 | 12.587 |
| 7782 | 13.088 |
| 7783 | 13.088 |
| 7784 | 13.088 |
| 7785 | 13.088 |
| 7786 | 12.587 |
| 7787 | 11.585 |
| 7788 | 10.583 |
| 7789 | 10.583 |
| 7790 | 10.583 |
| 7791 | 11.084 |
| 7792 | 12.086 |
| 7793 | 13.088 |
| 7794 | 13.088 |
| 7795 | 13.589 |
| 7796 | 13.589 |
| 7797 | 13.088 |
| 7798 | 12.086 |
| 7799 | 11.585 |
| 7800 | 11.084 |
| 7801 | 11.084 |
| 7802 | 11.084 |
| 7803 | 10.583 |
| 7804 | 10.583 |
| 7805 | 12.587 |
| 7806 | 13.088 |
| 7807 | 13.589 |
| 7808 | 13.589 |
| 7809 | 13.088 |
| 7810 | 13.088 |
| 7811 | 12.086 |
| 7812 | 11.585 |
| 7813 | 11.084 |
| 7814 | 11.084 |
| 7815 | 11.585 |
| 7816 | 12.086 |
| 7817 | 13.088 |
| 7818 | 13.088 |
| 7819 | 13.589 |
| 7820 | 13.589 |
| 7821 | 13.589 |
| 7822 | 13.088 |
| 7823 | 12.086 |
| 7824 | 12.086 |
| 7825 | 12.086 |
| 7826 | 11.585 |
| 7827 | 11.585 |
| 7828 | 11.084 |
| 7829 | 11.585 |
| 7830 | 12.587 |
| 7831 | 13.088 |
| 7832 | 13.088 |
| 7833 | 13.088 |
| 7834 | 12.587 |
| 7835 | 12.587 |
| 7836 | 12.086 |
| 7837 | 11.585 |
| 7838 | 11.585 |
| 7839 | 12.086 |
| 7840 | 12.086 |
| 7841 | 12.587 |
| 7842 | 13.088 |
| 7843 | 13.088 |
| 7844 | 13.088 |
| 7845 | 13.088 |
| 7846 | 13.088 |
| 7847 | 12.587 |
| 7848 | 12.086 |
| 7849 | 12.086 |
| 7850 | 12.086 |
| 7851 | 12.086 |
| 7852 | 11.585 |
| 7853 | 11.585 |
| 7854 | 12.086 |
| 7855 | 12.587 |
| 7856 | 13.088 |
| 7857 | 13.088 |
| 7858 | 13.088 |
| 7859 | 13.088 |
| 7860 | 12.587 |
| 7861 | 12.587 |
| 7862 | 12.086 |
| 7863 | 12.086 |
| 7864 | 12.086 |
| 7865 | 12.587 |
| 7866 | 12.587 |
| 7867 | 13.088 |
| 7868 | 13.088 |
| 7869 | 13.088 |
| 7870 | 13.088 |
| 7871 | 12.587 |
| 7872 | 12.086 |
| 7873 | 12.086 |
| 7874 | 12.086 |
| 7875 | 12.086 |
| 7876 | 12.086 |
| 7877 | 12.086 |
| 7878 | 11.585 |
| 7879 | 12.587 |
| 7880 | 12.587 |
| 7881 | 13.088 |
| 7882 | 13.088 |
| 7883 | 13.088 |
| 7884 | 13.088 |
| 7885 | 12.587 |
| 7886 | 12.587 |
| 7887 | 12.086 |
| 7888 | 12.086 |
| 7889 | 12.086 |
| 7890 | 12.587 |
| 7891 | 12.587 |
| 7892 | 12.587 |
| 7893 | 13.088 |
| 7894 | 13.088 |
| 7895 | 13.088 |
| 7896 | 12.587 |
| 7897 | 12.587 |
| 7898 | 12.086 |
| 7899 | 12.086 |
| 7900 | 12.086 |
| 7901 | 12.086 |
| 7902 | 12.086 |
| 7903 | 12.587 |
| 7904 | 13.088 |
| 7905 | 13.088 |
| 7906 | 13.088 |
| 7907 | 12.587 |
| 7908 | 12.587 |
| 7909 | 12.587 |
| 7910 | 12.086 |
| 7911 | 12.086 |
| 7912 | 12.086 |
| 7913 | 12.086 |
| 7914 | 12.587 |
| 7915 | 12.587 |
| 7916 | 12.587 |
| 7917 | 12.587 |
| 7918 | 12.587 |
| 7919 | 12.587 |
| 7920 | 12.587 |
| 7921 | 12.086 |
| 7922 | 12.086 |
| 7923 | 12.086 |
| 7924 | 12.086 |
| 7925 | 12.086 |
| 7926 | 12.086 |
| 7927 | 11.585 |
| 7928 | 11.585 |
| 7929 | 11.585 |
| 7930 | 12.086 |
| 7931 | 12.086 |
| 7932 | 12.086 |
| 7933 | 12.086 |
| 7934 | 11.585 |
| 7935 | 11.585 |
| 7936 | 11.585 |
| 7937 | 11.585 |
| 7938 | 11.084 |
| 7939 | 11.585 |
| 7940 | 11.585 |
| 7941 | 12.587 |
| 7942 | 12.086 |
| 7943 | 12.086 |
| 7944 | 12.086 |
| 7945 | 11.585 |
| 7946 | 11.585 |
| 7947 | 11.585 |
| 7948 | 11.585 |
| 7949 | 11.084 |
| 7950 | 11.084 |
| 7951 | 11.084 |
| 7952 | 11.084 |
| 7953 | 10.583 |
| 7954 | 10.583 |
| 7955 | 11.084 |
| 7956 | 11.084 |
| 7957 | 11.585 |
| 7958 | 11.585 |
| 7959 | 11.084 |
| 7960 | 10.583 |
| 7961 | 10.583 |
| 7962 | 10.583 |
| 7963 | 10.082 |
| 7964 | 10.583 |
| 7965 | 10.583 |
| 7966 | 10.583 |
| 7967 | 10.583 |
| 7968 | 10.583 |
| 7969 | 10.082 |
| 7970 | 10.082 |
| 7971 | 10.082 |
| 7972 | 10.082 |
| 7973 | 10.082 |
| 7974 | 9.58 |
| 7975 | 9.58 |
| 7976 | 9.58 |
| 7977 | 9.079 |
| 7978 | 9.079 |
| 7979 | 10.082 |
| 7980 | 11.084 |
| 7981 | 11.585 |
| 7982 | 11.585 |
| 7983 | 11.585 |
| 7984 | 11.084 |
| 7985 | 10.583 |
| 7986 | 10.082 |
| 7987 | 9.58 |
| 7988 | 9.58 |
| 7989 | 9.58 |
| 7990 | 9.58 |
| 7991 | 9.079 |
| 7992 | 9.079 |
| 7993 | 9.079 |
| 7994 | 9.079 |
| 7995 | 9.079 |
| 7996 | 9.079 |
| 7997 | 8.578 |
| 7998 | 8.578 |
| 7999 | 8.578 |
| 8000 | 8.578 |
| 8001 | 8.578 |
| 8002 | 8.578 |
| 8003 | 8.578 |
| 8004 | 8.578 |
| 8005 | 10.583 |
| 8006 | 11.084 |
| 8007 | 11.084 |
| 8008 | 11.084 |
| 8009 | 11.084 |
| 8010 | 11.084 |
| 8011 | 9.58 |
| 8012 | 9.079 |
| 8013 | 9.079 |
| 8014 | 8.578 |
| 8015 | 8.578 |
| 8016 | 8.578 |
| 8017 | 8.578 |
| 8018 | 9.079 |
| 8019 | 8.578 |
| 8020 | 9.079 |
| 8021 | 9.079 |
| 8022 | 8.578 |
| 8023 | 9.079 |
| 8024 | 8.578 |
| 8025 | 8.076 |
| 8026 | 8.076 |
| 8027 | 8.578 |
| 8028 | 9.58 |
| 8029 | 10.583 |
| 8030 | 11.585 |
| 8031 | 12.086 |
| 8032 | 12.086 |
| 8033 | 12.086 |
| 8034 | 12.086 |
| 8035 | 11.585 |
| 8036 | 10.583 |
| 8037 | 10.082 |
| 8038 | 9.58 |
| 8039 | 9.079 |
| 8040 | 9.079 |
| 8041 | 8.578 |
| 8042 | 9.079 |
| 8043 | 10.583 |
| 8044 | 11.585 |
| 8045 | 12.086 |
| 8046 | 12.086 |
| 8047 | 12.086 |
| 8048 | 12.086 |
| 8049 | 10.583 |
| 8050 | 10.583 |
| 8051 | 10.082 |
| 8052 | 10.082 |
| 8053 | 10.583 |
| 8054 | 11.585 |
| 8055 | 12.086 |
| 8056 | 12.587 |
| 8057 | 12.587 |
| 8058 | 12.086 |
| 8059 | 12.086 |
| 8060 | 11.084 |
| 8061 | 10.082 |
| 8062 | 10.082 |
| 8063 | 9.58 |
| 8064 | 10.082 |
| 8065 | 9.58 |
| 8066 | 10.082 |
| 8067 | 10.583 |
| 8068 | 12.086 |
| 8069 | 12.587 |
| 8070 | 12.587 |
| 8071 | 12.587 |
| 8072 | 12.587 |
| 8073 | 11.585 |
| 8074 | 10.583 |
| 8075 | 10.583 |
| 8076 | 10.082 |
| 8077 | 10.583 |
| 8078 | 11.084 |
| 8079 | 12.086 |
| 8080 | 12.587 |
| 8081 | 12.587 |
| 8082 | 12.587 |
| 8083 | 12.587 |
| 8084 | 12.086 |
| 8085 | 11.084 |
| 8086 | 10.583 |
| 8087 | 10.583 |
| 8088 | 10.583 |
| 8089 | 10.583 |
| 8090 | 10.082 |
| 8091 | 10.082 |
| 8092 | 11.585 |
| 8093 | 12.587 |
| 8094 | 12.587 |
| 8095 | 12.086 |
| 8096 | 12.587 |
| 8097 | 12.086 |
| 8098 | 11.084 |
| 8099 | 10.583 |
| 8100 | 10.583 |
| 8101 | 10.583 |
| 8102 | 10.583 |
| 8103 | 11.585 |
| 8104 | 13.088 |
| 8105 | 13.088 |
| 8106 | 13.088 |
| 8107 | 13.088 |
| 8108 | 13.088 |
| 8109 | 11.585 |
| 8110 | 11.084 |
| 8111 | 11.084 |
| 8112 | 11.084 |
| 8113 | 10.583 |
| 8114 | 10.583 |
| 8115 | 10.082 |
| 8116 | 10.583 |
| 8117 | 11.585 |
| 8118 | 12.587 |
| 8119 | 12.587 |
| 8120 | 12.086 |
| 8121 | 12.086 |
| 8122 | 11.084 |
| 8123 | 11.084 |
| 8124 | 10.583 |
| 8125 | 10.583 |
| 8126 | 10.583 |
| 8127 | 10.583 |
| 8128 | 11.084 |
| 8129 | 11.585 |
| 8130 | 11.585 |
| 8131 | 12.086 |
| 8132 | 11.585 |
| 8133 | 11.585 |
| 8134 | 11.084 |
| 8135 | 11.084 |
| 8136 | 11.084 |
| 8137 | 10.583 |
| 8138 | 10.583 |
| 8139 | 10.082 |
| 8140 | 10.082 |
| 8141 | 11.084 |
| 8142 | 11.585 |
| 8143 | 11.585 |
| 8144 | 11.585 |
| 8145 | 11.585 |
| 8146 | 11.084 |
| 8147 | 11.084 |
| 8148 | 10.583 |
| 8149 | 10.583 |
| 8150 | 10.082 |
| 8151 | 10.082 |
| 8152 | 10.583 |
| 8153 | 11.585 |
| 8154 | 11.585 |
| 8155 | 11.585 |
| 8156 | 11.585 |
| 8157 | 11.585 |
| 8158 | 11.585 |
| 8159 | 10.583 |
| 8160 | 10.583 |
| 8161 | 10.583 |
| 8162 | 10.583 |
| 8163 | 10.082 |
| 8164 | 10.082 |
| 8165 | 11.084 |
| 8166 | 11.585 |
| 8167 | 11.585 |
| 8168 | 11.585 |
| 8169 | 11.585 |
| 8170 | 11.585 |
| 8171 | 11.585 |
| 8172 | 11.084 |
| 8173 | 10.583 |
| 8174 | 10.583 |
| 8175 | 10.583 |
| 8176 | 11.084 |
| 8177 | 11.084 |
| 8178 | 11.585 |
| 8179 | 11.585 |
| 8180 | 11.585 |
| 8181 | 11.585 |
| 8182 | 11.585 |
| 8183 | 11.084 |
| 8184 | 11.084 |
| 8185 | 11.084 |
| 8186 | 10.583 |
| 8187 | 10.583 |
| 8188 | 10.583 |
| 8189 | 10.082 |
| 8190 | 10.583 |
| 8191 | 11.084 |
| 8192 | 11.084 |
| 8193 | 11.585 |
| 8194 | 11.585 |
| 8195 | 11.585 |
| 8196 | 11.084 |
| 8197 | 10.583 |
| 8198 | 11.084 |
| 8199 | 11.084 |
| 8200 | 11.084 |
| 8201 | 11.084 |
| 8202 | 11.585 |
| 8203 | 11.585 |
| 8204 | 11.585 |
| 8205 | 11.585 |
| 8206 | 11.585 |
| 8207 | 11.084 |
| 8208 | 11.084 |
| 8209 | 11.084 |
| 8210 | 11.084 |
| 8211 | 11.084 |
| 8212 | 10.583 |
| 8213 | 10.082 |
| 8214 | 10.082 |
| 8215 | 11.084 |
| 8216 | 11.084 |
| 8217 | 11.084 |
| 8218 | 11.084 |
| 8219 | 11.585 |
| 8220 | 11.084 |
| 8221 | 11.084 |
| 8222 | 11.084 |
| 8223 | 11.084 |
| 8224 | 10.583 |
| 8225 | 10.082 |
| 8226 | 10.583 |
| 8227 | 10.583 |
| 8228 | 11.084 |
| 8229 | 11.084 |
| 8230 | 11.084 |
| 8231 | 10.583 |
| 8232 | 10.082 |
| 8233 | 10.082 |
| 8234 | 10.082 |
| 8235 | 10.082 |
| 8236 | 9.58 |
| 8237 | 9.58 |
| 8238 | 9.58 |
| 8239 | 10.583 |
| 8240 | 11.084 |
| 8241 | 11.585 |
| 8242 | 11.585 |
| 8243 | 11.585 |
| 8244 | 11.585 |
| 8245 | 11.585 |
| 8246 | 11.084 |
| 8247 | 10.583 |
| 8248 | 10.082 |
| 8249 | 9.58 |
| 8250 | 9.58 |
| 8251 | 10.082 |
| 8252 | 10.583 |
| 8253 | 10.583 |
| 8254 | 10.583 |
| 8255 | 10.583 |
| 8256 | 10.082 |
| 8257 | 9.58 |
| 8258 | 9.58 |
| 8259 | 9.58 |
| 8260 | 9.58 |
| 8261 | 9.079 |
| 8262 | 9.079 |
| 8263 | 10.082 |
| 8264 | 10.583 |
| 8265 | 11.084 |
| 8266 | 11.084 |
| 8267 | 11.084 |
| 8268 | 11.084 |
| 8269 | 11.084 |
| 8270 | 10.583 |
| 8271 | 10.082 |
| 8272 | 9.58 |
| 8273 | 9.58 |
| 8274 | 10.082 |
| 8275 | 10.082 |
| 8276 | 10.082 |
| 8277 | 10.583 |
| 8278 | 10.082 |
| 8279 | 10.082 |
| 8280 | 10.082 |
| 8281 | 9.58 |
| 8282 | 9.079 |
| 8283 | 9.079 |
| 8284 | 9.079 |
| 8285 | 9.079 |
| 8286 | 8.578 |
| 8287 | 8.578 |
| 8288 | 9.58 |
| 8289 | 10.583 |
| 8290 | 10.583 |
| 8291 | 10.583 |
| 8292 | 10.082 |
| 8293 | 10.082 |
| 8294 | 9.58 |
| 8295 | 9.58 |
| 8296 | 9.079 |
| 8297 | 9.079 |
| 8298 | 8.578 |
| 8299 | 8.578 |
| 8300 | 8.578 |
| 8301 | 8.578 |
| 8302 | 8.578 |
| 8303 | 8.578 |
| 8304 | 8.578 |
| 8305 | 8.076 |
| 8306 | 8.076 |
| 8307 | 8.076 |
| 8308 | 8.076 |
| 8309 | 7.575 |
| 8310 | 7.575 |
| 8311 | 7.575 |
| 8312 | 7.073 |
| 8313 | 7.073 |
| 8314 | 6.572 |
| 8315 | 6.572 |
| 8316 | 7.073 |
| 8317 | 6.572 |
| 8318 | 7.073 |
| 8319 | 7.073 |
| 8320 | 7.073 |
| 8321 | 6.572 |
| 8322 | 6.572 |
| 8323 | 6.572 |
| 8324 | 6.572 |
| 8325 | 6.572 |
| 8326 | 6.572 |
| 8327 | 6.572 |
| 8328 | 6.07 |
| 8329 | 6.572 |
| 8330 | 6.572 |
| 8331 | 6.07 |
| 8332 | 6.07 |
| 8333 | 6.07 |
| 8334 | 6.07 |
| 8335 | 5.569 |
| 8336 | 5.569 |
| 8337 | 6.07 |
| 8338 | 6.07 |
| 8339 | 6.07 |
| 8340 | 6.07 |
| 8341 | 6.07 |
| 8342 | 6.07 |
| 8343 | 6.07 |
| 8344 | 6.07 |
| 8345 | 5.569 |
| 8346 | 5.569 |
| 8347 | 5.569 |
| 8348 | 5.569 |
| 8349 | 5.569 |
| 8350 | 5.569 |
| 8351 | 5.569 |
| 8352 | 6.07 |
| 8353 | 6.07 |
| 8354 | 5.569 |
| 8355 | 5.569 |
| 8356 | 5.569 |
| 8357 | 5.067 |
| 8358 | 5.067 |
| 8359 | 5.569 |
| 8360 | 5.067 |
| 8361 | 5.569 |
| 8362 | 5.569 |
| 8363 | 5.569 |
| 8364 | 7.575 |
| 8365 | 9.079 |
| 8366 | 9.079 |
| 8367 | 9.079 |
| 8368 | 8.578 |
| 8369 | 8.076 |
| 8370 | 7.575 |
| 8371 | 6.572 |
| 8372 | 6.07 |
| 8373 | 6.07 |
| 8374 | 6.07 |
| 8375 | 5.569 |
| 8376 | 5.569 |
| 8377 | 5.569 |
| 8378 | 5.569 |
| 8379 | 6.07 |
| 8380 | 5.569 |
| 8381 | 5.569 |
| 8382 | 5.569 |
| 8383 | 5.569 |
| 8384 | 5.067 |
| 8385 | 5.067 |
| 8386 | 5.569 |
| 8387 | 5.569 |
| 8388 | 5.569 |
| 8389 | 6.572 |
| 8390 | 6.572 |
| 8391 | 7.073 |
| 8392 | 6.572 |
| 8393 | 6.572 |
| 8394 | 6.572 |
| 8395 | 6.07 |
| 8396 | 5.569 |
| 8397 | 5.569 |
| 8398 | 5.569 |
| 8399 | 5.569 |
| 8400 | 5.569 |
| 8401 | 5.569 |
| 8402 | 5.569 |
| 8403 | 5.569 |
| 8404 | 5.569 |
| 8405 | 5.569 |
| 8406 | 5.569 |
| 8407 | 5.569 |
| 8408 | 5.569 |
| 8409 | 5.569 |
| 8410 | 5.067 |
| 8411 | 5.067 |
| 8412 | 5.569 |
| 8413 | 5.569 |
| 8414 | 7.575 |
| 8415 | 8.578 |
| 8416 | 8.578 |
| 8417 | 8.578 |
| 8418 | 8.578 |
| 8419 | 8.578 |
| 8420 | 6.572 |
| 8421 | 5.569 |
| 8422 | 5.569 |
| 8423 | 5.569 |
| 8424 | 5.569 |
| 8425 | 5.067 |
| 8426 | 5.569 |
| 8427 | 7.073 |
| 8428 | 8.076 |
| 8429 | 8.076 |
| 8430 | 8.076 |
| 8431 | 8.076 |
| 8432 | 6.572 |
| 8433 | 6.07 |
| 8434 | 5.569 |
| 8435 | 5.569 |
| 8436 | 6.07 |
| 8437 | 6.572 |
| 8438 | 8.076 |
| 8439 | 9.079 |
| 8440 | 9.079 |
| 8441 | 9.58 |
| 8442 | 9.58 |
| 8443 | 9.079 |
| 8444 | 9.079 |
| 8445 | 7.073 |
| 8446 | 6.07 |
| 8447 | 6.07 |
| 8448 | 6.07 |
| 8449 | 6.07 |
| 8450 | 5.569 |
| 8451 | 5.569 |
| 8452 | 8.076 |
| 8453 | 8.578 |
| 8454 | 8.578 |
| 8455 | 8.578 |
| 8456 | 8.578 |
| 8457 | 7.073 |
| 8458 | 6.572 |
| 8459 | 6.572 |
| 8460 | 6.572 |
| 8461 | 6.572 |
| 8462 | 7.073 |
| 8463 | 7.575 |
| 8464 | 8.076 |
| 8465 | 8.578 |
| 8466 | 8.578 |
| 8467 | 8.578 |
| 8468 | 8.076 |
| 8469 | 7.073 |
| 8470 | 6.572 |
| 8471 | 6.572 |
| 8472 | 6.572 |
| 8473 | 6.572 |
| 8474 | 6.07 |
| 8475 | 6.07 |
| 8476 | 6.572 |
| 8477 | 8.076 |
| 8478 | 8.578 |
| 8479 | 8.578 |
| 8480 | 8.578 |
| 8481 | 8.578 |
| 8482 | 8.076 |
| 8483 | 7.073 |
| 8484 | 6.572 |
| 8485 | 6.07 |
| 8486 | 7.073 |
| 8487 | 7.575 |
| 8488 | 9.079 |
| 8489 | 9.079 |
| 8490 | 9.58 |
| 8491 | 9.58 |
| 8492 | 9.079 |
| 8493 | 8.578 |
| 8494 | 7.073 |
| 8495 | 7.073 |
| 8496 | 7.073 |
| 8497 | 6.572 |
| 8498 | 6.572 |
| 8499 | 6.07 |
| 8500 | 6.07 |
| 8501 | 8.578 |
| 8502 | 9.58 |
| 8503 | 9.58 |
| 8504 | 9.58 |
| 8505 | 9.58 |
| 8506 | 9.58 |
| 8507 | 9.079 |
| 8508 | 8.076 |
| 8509 | 7.575 |
| 8510 | 7.575 |
| 8511 | 8.076 |
| 8512 | 8.578 |
| 8513 | 9.079 |
| 8514 | 9.58 |
| 8515 | 9.58 |
| 8516 | 9.58 |
| 8517 | 9.58 |
| 8518 | 8.076 |
| 8519 | 7.575 |
| 8520 | 8.076 |
| 8521 | 7.575 |
| 8522 | 7.073 |
| 8523 | 7.073 |
| 8524 | 6.572 |
| 8525 | 7.575 |
| 8526 | 9.079 |
| 8527 | 9.58 |
| 8528 | 10.082 |
| 8529 | 10.082 |
| 8530 | 10.082 |
| 8531 | 10.082 |
| 8532 | 9.079 |
| 8533 | 8.076 |
| 8534 | 7.575 |
| 8535 | 8.076 |
| 8536 | 8.076 |
| 8537 | 8.578 |
| 8538 | 9.58 |
| 8539 | 10.082 |
| 8540 | 10.082 |
| 8541 | 10.082 |
| 8542 | 9.079 |
| 8543 | 8.076 |
| 8544 | 8.076 |
| 8545 | 8.076 |
| 8546 | 7.575 |
| 8547 | 7.575 |
| 8548 | 7.073 |
| 8549 | 7.073 |
| 8550 | 8.578 |
| 8551 | 10.082 |
| 8552 | 10.082 |
| 8553 | 10.583 |
| 8554 | 10.583 |
| 8555 | 10.583 |
| 8556 | 10.082 |
| 8557 | 9.58 |
| 8558 | 9.079 |
| 8559 | 8.578 |
| 8560 | 9.079 |
| 8561 | 9.079 |
| 8562 | 10.082 |
| 8563 | 10.583 |
| 8564 | 10.583 |
| 8565 | 10.583 |
| 8566 | 10.583 |
| 8567 | 9.58 |
| 8568 | 9.079 |
| 8569 | 9.079 |
| 8570 | 8.578 |
| 8571 | 8.076 |
| 8572 | 8.076 |
| 8573 | 7.575 |
| 8574 | 7.575 |
| 8575 | 9.079 |
| 8576 | 10.082 |
| 8577 | 10.583 |
| 8578 | 10.583 |
| 8579 | 10.583 |
| 8580 | 10.583 |
| 8581 | 9.58 |
| 8582 | 8.076 |
| 8583 | 8.076 |
| 8584 | 8.578 |
| 8585 | 8.578 |
| 8586 | 8.578 |
| 8587 | 10.082 |
| 8588 | 10.583 |
| 8589 | 11.084 |
| 8590 | 11.084 |
| 8591 | 10.583 |
| 8592 | 10.082 |
| 8593 | 8.578 |
| 8594 | 8.578 |
| 8595 | 8.076 |
| 8596 | 8.076 |
| 8597 | 8.076 |
| 8598 | 7.575 |
| 8599 | 7.575 |
| 8600 | 9.58 |
| 8601 | 10.082 |
| 8602 | 10.583 |
| 8603 | 10.583 |
| 8604 | 10.583 |
| 8605 | 10.082 |
| 8606 | 9.58 |
| 8607 | 8.578 |
| 8608 | 8.578 |
| 8609 | 9.079 |
| 8610 | 9.079 |
| 8611 | 9.58 |
| 8612 | 10.082 |
| 8613 | 10.583 |
| 8614 | 10.583 |
| 8615 | 10.583 |
| 8616 | 10.082 |
| 8617 | 9.079 |
| 8618 | 8.578 |
| 8619 | 8.076 |
| 8620 | 8.076 |
| 8621 | 8.076 |
| 8622 | 7.575 |
| 8623 | 7.575 |
| 8624 | 8.578 |
| 8625 | 10.082 |
| 8626 | 10.583 |
| 8627 | 11.084 |
| 8628 | 10.583 |
| 8629 | 10.583 |
| 8630 | 10.583 |
| 8631 | 10.082 |
| 8632 | 9.079 |
| 8633 | 8.578 |
| 8634 | 8.578 |
| 8635 | 9.079 |
| 8636 | 9.079 |
| 8637 | 9.58 |
| 8638 | 9.58 |
| 8639 | 9.58 |
| 8640 | 9.079 |
| 8641 | 8.578 |
| 8642 | 8.076 |
| 8643 | 8.076 |
| 8644 | 7.575 |
| 8645 | 7.575 |
| 8646 | 7.073 |
| 8647 | 7.073 |
| 8648 | 7.575 |
| 8649 | 8.076 |
| 8650 | 10.082 |
| 8651 | 10.583 |
| 8652 | 11.084 |
| 8653 | 11.084 |
| 8654 | 10.583 |
| 8655 | 10.583 |
| 8656 | 10.082 |
| 8657 | 9.079 |
| 8658 | 8.578 |
| 8659 | 8.578 |
| 8660 | 8.578 |
| 8661 | 8.578 |
| 8662 | 8.578 |
| 8663 | 9.079 |
| 8664 | 8.578 |
| 8665 | 8.578 |
| 8666 | 8.578 |
| 8667 | 8.076 |
| 8668 | 7.575 |
| 8669 | 7.073 |
| 8670 | 7.073 |
| 8671 | 7.073 |
| 8672 | 7.073 |
| 8673 | 7.073 |
| 8674 | 9.079 |
| 8675 | 10.082 |
| 8676 | 10.583 |
| 8677 | 11.084 |
| 8678 | 10.583 |
| 8679 | 10.583 |
| 8680 | 10.583 |
| 8681 | 9.079 |
| 8682 | 8.578 |
| 8683 | 7.575 |
| 8684 | 8.076 |
| 8685 | 8.076 |
| 8686 | 8.076 |
| 8687 | 8.076 |
| 8688 | 8.578 |
| 8689 | 8.578 |
| 8690 | 8.578 |
| 8691 | 8.076 |
| 8692 | 8.076 |
| 8693 | 8.076 |
| 8694 | 7.575 |
| 8695 | 7.073 |
| 8696 | 7.073 |
| 8697 | 7.073 |
| 8698 | 8.076 |
| 8699 | 9.58 |
| 8700 | 10.583 |
| 8701 | 11.084 |
| 8702 | 11.084 |
| 8703 | 10.082 |
| 8704 | 10.583 |
| 8705 | 10.082 |
| 8706 | 9.58 |
| 8707 | 8.578 |
| 8708 | 8.076 |
| 8709 | 7.575 |
| 8710 | 7.073 |
| 8711 | 7.073 |
| 8712 | 7.575 |
| 8713 | 7.575 |
| 8714 | 8.076 |
| 8715 | 7.575 |
| 8716 | 7.575 |
| 8717 | 8.076 |
| 8718 | 8.076 |
| 8719 | 7.575 |
| 8720 | 7.073 |
| 8721 | 7.575 |
| 8722 | 6.572 |
| 8723 | 7.575 |
| 8724 | 8.578 |
| 8725 | 10.082 |
| 8726 | 11.084 |
| 8727 | 11.084 |
| 8728 | 11.084 |
| 8729 | 10.583 |
| 8730 | 11.084 |
| 8731 | 10.082 |
| 8732 | 8.076 |
| 8733 | 7.575 |
| 8734 | 7.073 |
| 8735 | 7.073 |
| 8736 | 7.575 |
| 8737 | 7.073 |
| 8738 | 7.073 |
| 8739 | 7.073 |
| 8740 | 7.575 |
| 8741 | 7.575 |
| 8742 | 7.073 |
| 8743 | 7.575 |